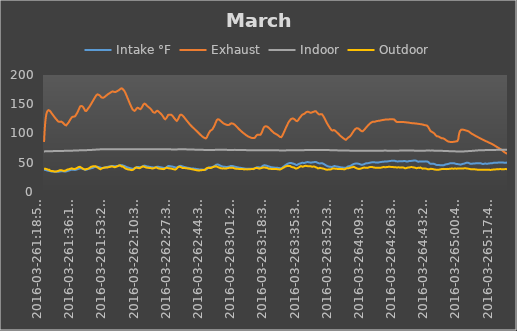
| Category | Intake °F | Exhaust | Indoor | Outdoor |
|---|---|---|---|---|
| 2016-03-261:18:55 PM | 37.85 | 85.662 | 69.35 | 40.1 |
| 2016-03-261:18:59 PM | 37.85 | 90.388 | 69.35 | 39.988 |
| 2016-03-261:19:03 PM | 37.85 | 94.888 | 69.35 | 39.988 |
| 2016-03-261:19:07 PM | 37.962 | 99.05 | 69.35 | 39.988 |
| 2016-03-261:19:11 PM | 37.962 | 102.875 | 69.35 | 40.1 |
| 2016-03-261:19:15 PM | 37.962 | 106.475 | 69.35 | 39.988 |
| 2016-03-261:19:19 PM | 37.962 | 109.738 | 69.35 | 39.875 |
| 2016-03-261:19:23 PM | 37.962 | 112.775 | 69.462 | 39.762 |
| 2016-03-261:19:27 PM | 37.85 | 115.588 | 69.462 | 39.762 |
| 2016-03-261:19:31 PM | 37.85 | 118.175 | 69.35 | 39.762 |
| 2016-03-261:19:35 PM | 37.85 | 120.425 | 69.462 | 39.65 |
| 2016-03-261:19:39 PM | 37.738 | 122.562 | 69.462 | 39.65 |
| 2016-03-261:19:43 PM | 37.738 | 124.588 | 69.462 | 39.65 |
| 2016-03-261:19:47 PM | 37.738 | 126.388 | 69.462 | 39.538 |
| 2016-03-261:19:51 PM | 37.625 | 127.962 | 69.462 | 39.425 |
| 2016-03-261:19:55 PM | 37.512 | 129.425 | 69.462 | 39.425 |
| 2016-03-261:20:00 PM | 37.512 | 130.775 | 69.462 | 39.425 |
| 2016-03-261:20:04 PM | 37.4 | 131.9 | 69.462 | 39.312 |
| 2016-03-261:20:08 PM | 37.288 | 133.025 | 69.462 | 39.312 |
| 2016-03-261:20:12 PM | 37.288 | 134.038 | 69.462 | 39.312 |
| 2016-03-261:20:16 PM | 37.175 | 134.825 | 69.462 | 39.2 |
| 2016-03-261:20:20 PM | 37.062 | 135.612 | 69.462 | 39.2 |
| 2016-03-261:20:24 PM | 37.062 | 136.288 | 69.462 | 39.088 |
| 2016-03-261:20:28 PM | 36.95 | 136.962 | 69.462 | 38.975 |
| 2016-03-261:20:32 PM | 36.838 | 137.525 | 69.462 | 38.75 |
| 2016-03-261:20:36 PM | 36.838 | 137.975 | 69.462 | 38.638 |
| 2016-03-261:20:40 PM | 36.725 | 138.312 | 69.462 | 38.525 |
| 2016-03-261:20:44 PM | 36.612 | 138.988 | 69.462 | 38.525 |
| 2016-03-261:20:48 PM | 36.612 | 139.212 | 69.462 | 38.412 |
| 2016-03-261:20:52 PM | 36.5 | 139.438 | 69.575 | 38.412 |
| 2016-03-261:20:56 PM | 36.5 | 139.662 | 69.462 | 38.188 |
| 2016-03-261:21:00 PM | 36.388 | 139.775 | 69.462 | 38.075 |
| 2016-03-261:21:05 PM | 36.388 | 139.775 | 69.575 | 38.075 |
| 2016-03-261:21:09 PM | 36.275 | 139.888 | 69.575 | 37.962 |
| 2016-03-261:21:13 PM | 36.162 | 139.888 | 69.575 | 37.85 |
| 2016-03-261:21:17 PM | 36.162 | 139.888 | 69.575 | 37.85 |
| 2016-03-261:21:21 PM | 36.05 | 139.888 | 69.575 | 37.85 |
| 2016-03-261:21:25 PM | 36.05 | 139.775 | 69.575 | 37.85 |
| 2016-03-261:21:29 PM | 35.938 | 139.662 | 69.575 | 37.962 |
| 2016-03-261:21:33 PM | 35.938 | 139.55 | 69.575 | 37.962 |
| 2016-03-261:21:37 PM | 35.938 | 139.438 | 69.575 | 37.962 |
| 2016-03-261:21:45 PM | 35.938 | 139.325 | 69.575 | 37.625 |
| 2016-03-261:21:49 PM | 35.825 | 139.212 | 69.688 | 37.4 |
| 2016-03-261:21:53 PM | 35.825 | 139.1 | 69.575 | 37.062 |
| 2016-03-261:21:57 PM | 35.825 | 138.875 | 69.575 | 36.725 |
| 2016-03-261:22:01 PM | 35.712 | 138.762 | 69.688 | 36.5 |
| 2016-03-261:22:05 PM | 35.6 | 138.538 | 69.688 | 36.5 |
| 2016-03-261:22:09 PM | 35.488 | 138.312 | 69.688 | 36.388 |
| 2016-03-261:22:13 PM | 35.6 | 138.088 | 69.688 | 36.388 |
| 2016-03-261:22:17 PM | 35.488 | 137.75 | 69.688 | 36.275 |
| 2016-03-261:22:21 PM | 35.488 | 137.525 | 69.688 | 36.275 |
| 2016-03-261:22:25 PM | 35.375 | 137.3 | 69.688 | 36.275 |
| 2016-03-261:22:29 PM | 35.262 | 137.075 | 69.688 | 36.162 |
| 2016-03-261:22:33 PM | 35.262 | 136.85 | 69.688 | 36.05 |
| 2016-03-261:22:37 PM | 35.262 | 136.175 | 69.688 | 36.05 |
| 2016-03-261:22:41 PM | 35.262 | 135.838 | 69.688 | 35.938 |
| 2016-03-261:22:45 PM | 35.15 | 135.5 | 69.688 | 35.938 |
| 2016-03-261:22:49 PM | 35.15 | 135.275 | 69.688 | 35.825 |
| 2016-03-261:22:53 PM | 35.15 | 134.938 | 69.688 | 35.825 |
| 2016-03-261:22:57 PM | 35.15 | 134.6 | 69.688 | 35.938 |
| 2016-03-261:23:01 PM | 35.15 | 134.375 | 69.688 | 35.938 |
| 2016-03-261:23:05 PM | 35.15 | 133.925 | 69.688 | 35.825 |
| 2016-03-261:23:13 PM | 35.038 | 133.7 | 69.8 | 35.825 |
| 2016-03-261:23:21 PM | 35.038 | 133.362 | 69.8 | 35.825 |
| 2016-03-261:23:25 PM | 35.038 | 133.138 | 69.688 | 35.825 |
| 2016-03-261:23:29 PM | 35.038 | 132.8 | 69.8 | 35.712 |
| 2016-03-261:23:33 PM | 35.038 | 132.462 | 69.8 | 35.6 |
| 2016-03-261:23:37 PM | 35.038 | 132.238 | 69.8 | 35.6 |
| 2016-03-261:23:41 PM | 34.925 | 131.9 | 69.8 | 35.6 |
| 2016-03-261:23:45 PM | 35.038 | 131.562 | 69.8 | 35.6 |
| 2016-03-261:23:49 PM | 34.925 | 131.338 | 69.8 | 35.488 |
| 2016-03-261:23:53 PM | 34.925 | 131 | 69.8 | 35.488 |
| 2016-03-261:23:58 PM | 34.925 | 130.775 | 69.912 | 35.488 |
| 2016-03-261:24:02 PM | 34.812 | 130.55 | 69.912 | 35.488 |
| 2016-03-261:24:06 PM | 34.925 | 130.212 | 69.912 | 35.375 |
| 2016-03-261:24:10 PM | 34.812 | 129.988 | 69.8 | 35.375 |
| 2016-03-261:24:14 PM | 34.812 | 129.65 | 69.8 | 35.262 |
| 2016-03-261:24:18 PM | 34.812 | 129.425 | 69.8 | 35.15 |
| 2016-03-261:24:22 PM | 34.812 | 129.088 | 69.912 | 35.15 |
| 2016-03-261:24:26 PM | 34.7 | 128.863 | 69.912 | 35.038 |
| 2016-03-261:24:30 PM | 34.7 | 128.525 | 69.912 | 35.038 |
| 2016-03-261:24:34 PM | 34.7 | 128.3 | 69.912 | 35.038 |
| 2016-03-261:24:38 PM | 34.7 | 127.962 | 69.912 | 35.038 |
| 2016-03-261:24:42 PM | 34.7 | 127.625 | 69.912 | 35.038 |
| 2016-03-261:24:46 PM | 34.7 | 127.4 | 69.912 | 35.15 |
| 2016-03-261:24:51 PM | 34.7 | 127.062 | 69.912 | 35.038 |
| 2016-03-261:24:55 PM | 34.7 | 126.838 | 69.912 | 35.038 |
| 2016-03-261:24:59 PM | 34.7 | 126.5 | 69.912 | 35.038 |
| 2016-03-261:25:03 PM | 34.588 | 126.163 | 69.912 | 34.925 |
| 2016-03-261:25:11 PM | 34.588 | 125.938 | 69.912 | 34.925 |
| 2016-03-261:25:15 PM | 34.588 | 125.712 | 69.912 | 35.038 |
| 2016-03-261:25:19 PM | 34.588 | 125.375 | 69.912 | 35.038 |
| 2016-03-261:25:23 PM | 34.588 | 125.15 | 69.912 | 35.15 |
| 2016-03-261:25:27 PM | 34.588 | 124.812 | 69.912 | 35.15 |
| 2016-03-261:25:31 PM | 34.588 | 124.588 | 69.912 | 35.15 |
| 2016-03-261:25:35 PM | 34.588 | 124.362 | 69.912 | 35.15 |
| 2016-03-261:25:39 PM | 34.588 | 124.025 | 69.912 | 35.15 |
| 2016-03-261:25:43 PM | 34.588 | 123.8 | 70.025 | 35.262 |
| 2016-03-261:25:47 PM | 34.475 | 123.462 | 70.025 | 35.375 |
| 2016-03-261:25:52 PM | 34.588 | 123.238 | 70.025 | 35.375 |
| 2016-03-261:25:56 PM | 34.588 | 123.012 | 70.025 | 35.488 |
| 2016-03-261:26:00 PM | 34.588 | 122.788 | 70.025 | 35.488 |
| 2016-03-261:26:04 PM | 34.588 | 122.562 | 70.025 | 35.6 |
| 2016-03-261:26:08 PM | 34.588 | 122.338 | 70.025 | 35.6 |
| 2016-03-261:26:12 PM | 34.588 | 122.112 | 70.025 | 35.712 |
| 2016-03-261:26:16 PM | 34.588 | 121.888 | 70.025 | 35.712 |
| 2016-03-261:26:20 PM | 34.588 | 121.663 | 70.025 | 35.712 |
| 2016-03-261:26:24 PM | 34.588 | 121.438 | 70.025 | 35.712 |
| 2016-03-261:26:28 PM | 34.588 | 121.212 | 70.025 | 35.712 |
| 2016-03-261:26:32 PM | 34.588 | 120.762 | 70.138 | 35.712 |
| 2016-03-261:26:36 PM | 34.588 | 120.538 | 70.025 | 35.825 |
| 2016-03-261:26:40 PM | 34.588 | 120.312 | 70.025 | 35.825 |
| 2016-03-261:26:44 PM | 34.588 | 120.088 | 70.138 | 36.05 |
| 2016-03-261:26:48 PM | 34.588 | 119.975 | 70.138 | 36.05 |
| 2016-03-261:26:52 PM | 34.7 | 119.862 | 70.138 | 36.275 |
| 2016-03-261:26:56 PM | 34.7 | 119.862 | 70.138 | 36.5 |
| 2016-03-261:27:00 PM | 34.7 | 119.862 | 70.138 | 36.612 |
| 2016-03-261:27:04 PM | 34.7 | 119.975 | 70.025 | 36.725 |
| 2016-03-261:27:09 PM | 34.812 | 119.975 | 70.138 | 36.838 |
| 2016-03-261:27:13 PM | 34.812 | 119.975 | 70.138 | 36.838 |
| 2016-03-261:27:17 PM | 34.925 | 119.975 | 70.138 | 36.95 |
| 2016-03-261:27:21 PM | 34.925 | 119.975 | 70.138 | 36.95 |
| 2016-03-261:27:25 PM | 35.038 | 119.975 | 70.138 | 37.062 |
| 2016-03-261:27:29 PM | 35.038 | 119.862 | 70.138 | 37.175 |
| 2016-03-261:27:33 PM | 35.038 | 119.862 | 70.138 | 37.175 |
| 2016-03-261:27:37 PM | 35.038 | 119.975 | 70.138 | 37.288 |
| 2016-03-261:27:41 PM | 35.15 | 120.088 | 70.138 | 37.4 |
| 2016-03-261:27:45 PM | 35.15 | 120.2 | 70.138 | 37.4 |
| 2016-03-261:27:49 PM | 35.262 | 120.2 | 70.138 | 37.4 |
| 2016-03-261:27:53 PM | 35.262 | 120.312 | 70.25 | 37.4 |
| 2016-03-261:27:57 PM | 35.375 | 120.425 | 70.25 | 37.4 |
| 2016-03-261:28:01 PM | 35.375 | 120.425 | 70.25 | 37.512 |
| 2016-03-261:28:06 PM | 35.488 | 120.425 | 70.25 | 37.512 |
| 2016-03-261:28:10 PM | 35.488 | 120.425 | 70.25 | 37.288 |
| 2016-03-261:28:14 PM | 35.488 | 120.312 | 70.25 | 37.288 |
| 2016-03-261:28:18 PM | 35.488 | 120.312 | 70.25 | 37.288 |
| 2016-03-261:28:22 PM | 35.488 | 120.2 | 70.25 | 37.175 |
| 2016-03-261:28:26 PM | 35.6 | 120.088 | 70.25 | 37.175 |
| 2016-03-261:28:30 PM | 35.6 | 119.975 | 70.25 | 37.175 |
| 2016-03-261:28:34 PM | 35.6 | 119.862 | 70.25 | 37.175 |
| 2016-03-261:28:38 PM | 35.488 | 119.75 | 70.25 | 37.175 |
| 2016-03-261:28:42 PM | 35.488 | 119.525 | 70.25 | 37.062 |
| 2016-03-261:28:46 PM | 35.488 | 119.413 | 70.25 | 37.062 |
| 2016-03-261:28:50 PM | 35.488 | 119.3 | 70.25 | 36.838 |
| 2016-03-261:28:54 PM | 35.488 | 119.075 | 70.25 | 36.725 |
| 2016-03-261:28:58 PM | 35.375 | 118.85 | 70.25 | 36.5 |
| 2016-03-261:29:03 PM | 35.488 | 118.625 | 70.25 | 36.388 |
| 2016-03-261:29:07 PM | 35.375 | 118.4 | 70.25 | 36.388 |
| 2016-03-261:29:11 PM | 35.375 | 118.175 | 70.362 | 36.275 |
| 2016-03-261:29:15 PM | 35.262 | 117.95 | 70.25 | 36.162 |
| 2016-03-261:29:19 PM | 35.262 | 117.725 | 70.362 | 36.162 |
| 2016-03-261:29:23 PM | 35.262 | 117.5 | 70.25 | 36.162 |
| 2016-03-261:29:27 PM | 35.262 | 117.275 | 70.25 | 36.05 |
| 2016-03-261:29:31 PM | 35.262 | 117.05 | 70.25 | 36.05 |
| 2016-03-261:29:35 PM | 35.15 | 116.825 | 70.362 | 36.05 |
| 2016-03-261:29:39 PM | 35.15 | 116.6 | 70.362 | 35.938 |
| 2016-03-261:29:43 PM | 35.15 | 116.262 | 70.25 | 35.938 |
| 2016-03-261:29:47 PM | 35.038 | 116.038 | 70.362 | 36.05 |
| 2016-03-261:29:51 PM | 35.038 | 115.812 | 70.362 | 36.05 |
| 2016-03-261:29:56 PM | 35.038 | 115.588 | 70.362 | 36.162 |
| 2016-03-261:30:00 PM | 35.038 | 115.362 | 70.362 | 36.162 |
| 2016-03-261:30:04 PM | 35.038 | 115.138 | 70.362 | 36.162 |
| 2016-03-261:30:08 PM | 35.038 | 114.913 | 70.362 | 36.275 |
| 2016-03-261:30:12 PM | 35.038 | 114.8 | 70.362 | 36.275 |
| 2016-03-261:30:16 PM | 35.038 | 114.575 | 70.362 | 36.275 |
| 2016-03-261:30:20 PM | 35.038 | 114.462 | 70.362 | 36.275 |
| 2016-03-261:30:24 PM | 35.038 | 114.35 | 70.362 | 36.388 |
| 2016-03-261:30:28 PM | 35.038 | 114.125 | 70.362 | 36.5 |
| 2016-03-261:30:32 PM | 35.038 | 114.012 | 70.362 | 36.5 |
| 2016-03-261:30:36 PM | 35.038 | 113.9 | 70.362 | 36.612 |
| 2016-03-261:30:40 PM | 35.038 | 113.9 | 70.362 | 36.838 |
| 2016-03-261:30:44 PM | 35.15 | 113.9 | 70.362 | 36.95 |
| 2016-03-261:30:48 PM | 35.15 | 113.9 | 70.362 | 37.062 |
| 2016-03-261:30:52 PM | 35.15 | 113.9 | 70.362 | 37.288 |
| 2016-03-261:30:57 PM | 35.262 | 114.125 | 70.362 | 37.512 |
| 2016-03-261:31:01 PM | 35.262 | 114.238 | 70.362 | 37.625 |
| 2016-03-261:31:05 PM | 35.375 | 114.462 | 70.362 | 37.85 |
| 2016-03-261:31:09 PM | 35.375 | 114.8 | 70.362 | 38.075 |
| 2016-03-261:31:13 PM | 35.488 | 115.138 | 70.475 | 38.188 |
| 2016-03-261:31:17 PM | 35.6 | 115.475 | 70.475 | 38.188 |
| 2016-03-261:31:21 PM | 35.712 | 115.812 | 70.475 | 38.3 |
| 2016-03-261:31:25 PM | 35.712 | 116.15 | 70.475 | 38.3 |
| 2016-03-261:31:29 PM | 35.938 | 116.488 | 70.475 | 38.412 |
| 2016-03-261:31:33 PM | 36.05 | 116.712 | 70.475 | 38.412 |
| 2016-03-261:31:37 PM | 36.162 | 116.938 | 70.475 | 38.525 |
| 2016-03-261:31:41 PM | 36.162 | 117.275 | 70.475 | 38.525 |
| 2016-03-261:31:45 PM | 36.275 | 117.388 | 70.475 | 38.638 |
| 2016-03-261:31:49 PM | 36.388 | 117.725 | 70.475 | 38.638 |
| 2016-03-261:31:53 PM | 36.388 | 117.95 | 70.475 | 38.638 |
| 2016-03-261:31:58 PM | 36.388 | 118.288 | 70.475 | 38.638 |
| 2016-03-261:32:02 PM | 36.388 | 118.512 | 70.475 | 38.525 |
| 2016-03-261:32:06 PM | 36.612 | 118.738 | 70.475 | 38.638 |
| 2016-03-261:32:10 PM | 36.612 | 119.075 | 70.475 | 38.75 |
| 2016-03-261:32:14 PM | 36.725 | 119.413 | 70.588 | 38.862 |
| 2016-03-261:32:18 PM | 36.725 | 119.862 | 70.475 | 39.088 |
| 2016-03-261:32:22 PM | 36.838 | 120.2 | 70.475 | 39.2 |
| 2016-03-261:32:26 PM | 36.838 | 120.65 | 70.588 | 39.2 |
| 2016-03-261:32:30 PM | 36.95 | 121.1 | 70.588 | 39.2 |
| 2016-03-261:32:34 PM | 37.062 | 121.438 | 70.588 | 39.2 |
| 2016-03-261:32:38 PM | 37.175 | 121.888 | 70.588 | 39.312 |
| 2016-03-261:32:42 PM | 37.175 | 122.225 | 70.588 | 39.425 |
| 2016-03-261:32:46 PM | 37.288 | 122.675 | 70.588 | 39.538 |
| 2016-03-261:32:50 PM | 37.4 | 123.012 | 70.588 | 39.65 |
| 2016-03-261:32:55 PM | 37.4 | 123.462 | 70.588 | 39.762 |
| 2016-03-261:32:59 PM | 37.512 | 123.8 | 70.588 | 39.875 |
| 2016-03-261:33:03 PM | 37.625 | 124.138 | 70.7 | 39.875 |
| 2016-03-261:33:07 PM | 37.625 | 124.475 | 70.588 | 39.762 |
| 2016-03-261:33:11 PM | 37.738 | 124.812 | 70.588 | 39.875 |
| 2016-03-261:33:15 PM | 37.738 | 125.038 | 70.588 | 39.875 |
| 2016-03-261:33:19 PM | 37.85 | 125.262 | 70.7 | 39.988 |
| 2016-03-261:33:23 PM | 37.85 | 125.6 | 70.7 | 40.1 |
| 2016-03-261:33:27 PM | 37.85 | 125.938 | 70.7 | 40.212 |
| 2016-03-261:33:31 PM | 37.962 | 126.275 | 70.7 | 40.212 |
| 2016-03-261:33:35 PM | 37.962 | 126.612 | 70.7 | 40.325 |
| 2016-03-261:33:39 PM | 37.962 | 126.95 | 70.7 | 40.438 |
| 2016-03-261:33:43 PM | 38.075 | 127.288 | 70.7 | 40.438 |
| 2016-03-261:33:47 PM | 38.075 | 127.625 | 70.7 | 40.438 |
| 2016-03-261:33:52 PM | 38.075 | 127.85 | 70.7 | 40.438 |
| 2016-03-261:33:56 PM | 38.188 | 128.075 | 70.7 | 40.438 |
| 2016-03-261:34:00 PM | 38.188 | 128.188 | 70.7 | 40.55 |
| 2016-03-261:34:04 PM | 38.188 | 128.3 | 70.812 | 40.438 |
| 2016-03-261:34:08 PM | 38.188 | 128.412 | 70.7 | 40.438 |
| 2016-03-261:34:12 PM | 38.188 | 128.525 | 70.812 | 40.212 |
| 2016-03-261:34:16 PM | 38.188 | 128.637 | 70.812 | 40.1 |
| 2016-03-261:34:20 PM | 38.188 | 128.637 | 70.7 | 39.875 |
| 2016-03-261:34:24 PM | 38.188 | 128.75 | 70.812 | 39.762 |
| 2016-03-261:34:28 PM | 38.188 | 128.75 | 70.7 | 39.538 |
| 2016-03-261:34:32 PM | 38.075 | 128.863 | 70.812 | 39.425 |
| 2016-03-261:34:36 PM | 38.075 | 128.863 | 70.7 | 39.312 |
| 2016-03-261:34:40 PM | 38.075 | 128.975 | 70.7 | 39.312 |
| 2016-03-261:34:44 PM | 38.075 | 128.975 | 70.812 | 39.312 |
| 2016-03-261:34:49 PM | 38.075 | 128.975 | 70.812 | 39.312 |
| 2016-03-261:34:53 PM | 37.962 | 128.863 | 70.812 | 39.2 |
| 2016-03-261:34:57 PM | 37.962 | 128.863 | 70.812 | 39.2 |
| 2016-03-261:35:01 PM | 37.962 | 128.863 | 70.812 | 39.425 |
| 2016-03-261:35:05 PM | 37.85 | 128.863 | 70.812 | 39.425 |
| 2016-03-261:35:09 PM | 37.85 | 128.975 | 70.812 | 39.425 |
| 2016-03-261:35:13 PM | 37.85 | 128.975 | 70.812 | 39.425 |
| 2016-03-261:35:17 PM | 37.738 | 129.088 | 70.812 | 39.425 |
| 2016-03-261:35:21 PM | 37.85 | 129.088 | 70.812 | 39.425 |
| 2016-03-261:35:25 PM | 37.738 | 129.2 | 70.812 | 39.425 |
| 2016-03-261:35:29 PM | 37.85 | 129.312 | 70.812 | 39.65 |
| 2016-03-261:35:33 PM | 37.85 | 129.538 | 70.812 | 39.762 |
| 2016-03-261:35:37 PM | 37.85 | 129.65 | 70.812 | 39.875 |
| 2016-03-261:35:41 PM | 37.85 | 129.988 | 70.812 | 39.988 |
| 2016-03-261:35:46 PM | 37.962 | 130.212 | 70.812 | 40.1 |
| 2016-03-261:35:50 PM | 37.962 | 130.55 | 70.925 | 40.1 |
| 2016-03-261:35:54 PM | 38.075 | 131 | 70.925 | 40.1 |
| 2016-03-261:35:58 PM | 38.075 | 131.338 | 70.925 | 40.1 |
| 2016-03-261:36:02 PM | 38.188 | 131.788 | 70.925 | 40.212 |
| 2016-03-261:36:06 PM | 38.188 | 132.125 | 70.925 | 40.325 |
| 2016-03-261:36:10 PM | 38.3 | 132.575 | 70.925 | 40.325 |
| 2016-03-261:36:14 PM | 38.3 | 132.912 | 70.925 | 40.438 |
| 2016-03-261:36:18 PM | 38.412 | 133.362 | 70.925 | 40.438 |
| 2016-03-261:36:22 PM | 38.525 | 133.7 | 70.925 | 40.55 |
| 2016-03-261:36:26 PM | 38.525 | 134.15 | 71.038 | 40.662 |
| 2016-03-261:36:30 PM | 38.638 | 134.488 | 71.038 | 40.775 |
| 2016-03-261:36:34 PM | 38.638 | 134.825 | 70.925 | 40.775 |
| 2016-03-261:36:38 PM | 38.75 | 135.162 | 71.038 | 40.888 |
| 2016-03-261:36:42 PM | 38.862 | 135.388 | 71.038 | 41 |
| 2016-03-261:36:46 PM | 38.862 | 135.838 | 71.038 | 41.338 |
| 2016-03-261:36:51 PM | 38.862 | 136.288 | 71.038 | 41.562 |
| 2016-03-261:36:55 PM | 38.975 | 136.738 | 71.038 | 41.788 |
| 2016-03-261:36:59 PM | 39.088 | 137.188 | 71.038 | 42.012 |
| 2016-03-261:37:03 PM | 39.2 | 137.638 | 71.038 | 42.125 |
| 2016-03-261:37:07 PM | 39.2 | 138.088 | 71.038 | 42.35 |
| 2016-03-261:37:11 PM | 39.312 | 138.65 | 71.038 | 42.575 |
| 2016-03-261:37:15 PM | 39.425 | 139.1 | 71.15 | 42.688 |
| 2016-03-261:37:19 PM | 39.538 | 139.55 | 71.15 | 42.8 |
| 2016-03-261:37:23 PM | 39.65 | 140.112 | 71.15 | 42.8 |
| 2016-03-261:37:27 PM | 39.762 | 140.675 | 71.15 | 42.8 |
| 2016-03-261:37:31 PM | 39.762 | 141.125 | 71.15 | 42.8 |
| 2016-03-261:37:35 PM | 39.875 | 141.688 | 71.15 | 42.8 |
| 2016-03-261:37:39 PM | 39.988 | 142.138 | 71.262 | 42.912 |
| 2016-03-261:37:43 PM | 39.988 | 142.7 | 71.262 | 43.025 |
| 2016-03-261:37:48 PM | 40.1 | 143.15 | 71.15 | 43.025 |
| 2016-03-261:37:52 PM | 40.212 | 143.712 | 71.15 | 43.025 |
| 2016-03-261:37:56 PM | 40.212 | 144.162 | 71.262 | 43.138 |
| 2016-03-261:38:00 PM | 40.325 | 144.725 | 71.262 | 43.25 |
| 2016-03-261:38:04 PM | 40.325 | 145.175 | 71.262 | 43.138 |
| 2016-03-261:38:08 PM | 40.325 | 145.625 | 71.262 | 43.025 |
| 2016-03-261:38:12 PM | 40.438 | 146.075 | 71.262 | 43.025 |
| 2016-03-261:38:16 PM | 40.438 | 146.3 | 71.262 | 42.912 |
| 2016-03-261:38:20 PM | 40.438 | 146.638 | 71.375 | 42.688 |
| 2016-03-261:38:24 PM | 40.55 | 146.75 | 71.262 | 42.462 |
| 2016-03-261:38:28 PM | 40.55 | 146.862 | 71.375 | 42.35 |
| 2016-03-261:38:32 PM | 40.438 | 146.862 | 71.262 | 42.125 |
| 2016-03-261:38:36 PM | 40.438 | 146.975 | 71.262 | 42.012 |
| 2016-03-261:38:40 PM | 40.438 | 146.862 | 71.375 | 41.9 |
| 2016-03-261:38:45 PM | 40.438 | 146.975 | 71.375 | 41.788 |
| 2016-03-261:38:49 PM | 40.325 | 146.975 | 71.375 | 41.675 |
| 2016-03-261:38:53 PM | 40.212 | 146.975 | 71.375 | 41.45 |
| 2016-03-261:38:57 PM | 40.212 | 146.862 | 71.375 | 41.338 |
| 2016-03-261:39:01 PM | 40.1 | 146.862 | 71.375 | 41.225 |
| 2016-03-261:39:05 PM | 39.988 | 146.862 | 71.375 | 41.112 |
| 2016-03-261:39:09 PM | 39.988 | 146.862 | 71.375 | 41 |
| 2016-03-261:39:13 PM | 39.988 | 146.862 | 71.375 | 40.888 |
| 2016-03-261:39:17 PM | 39.875 | 146.75 | 71.375 | 40.775 |
| 2016-03-261:39:21 PM | 39.875 | 146.638 | 71.375 | 40.662 |
| 2016-03-261:39:25 PM | 39.762 | 146.412 | 71.375 | 40.55 |
| 2016-03-261:39:29 PM | 39.65 | 146.3 | 71.375 | 40.325 |
| 2016-03-261:39:33 PM | 39.65 | 146.075 | 71.375 | 40.1 |
| 2016-03-261:39:37 PM | 39.538 | 145.85 | 71.488 | 39.988 |
| 2016-03-261:39:41 PM | 39.538 | 145.625 | 71.375 | 39.875 |
| 2016-03-261:39:46 PM | 39.425 | 145.288 | 71.375 | 39.762 |
| 2016-03-261:39:50 PM | 39.312 | 144.95 | 71.375 | 39.538 |
| 2016-03-261:39:54 PM | 39.312 | 144.612 | 71.375 | 39.312 |
| 2016-03-261:39:58 PM | 39.2 | 144.275 | 71.375 | 39.312 |
| 2016-03-261:40:02 PM | 39.088 | 143.938 | 71.488 | 39.2 |
| 2016-03-261:40:06 PM | 39.088 | 143.6 | 71.488 | 39.2 |
| 2016-03-261:40:10 PM | 38.975 | 143.262 | 71.375 | 39.088 |
| 2016-03-261:40:14 PM | 38.862 | 142.812 | 71.375 | 39.088 |
| 2016-03-261:40:18 PM | 38.75 | 142.475 | 71.375 | 38.975 |
| 2016-03-261:40:22 PM | 38.638 | 142.025 | 71.375 | 38.75 |
| 2016-03-261:40:26 PM | 38.638 | 141.575 | 71.375 | 38.638 |
| 2016-03-261:40:30 PM | 38.525 | 141.125 | 71.488 | 38.525 |
| 2016-03-261:40:34 PM | 38.412 | 140.675 | 71.488 | 38.525 |
| 2016-03-261:40:38 PM | 38.3 | 140.338 | 71.375 | 38.525 |
| 2016-03-261:40:43 PM | 38.3 | 139.888 | 71.488 | 38.412 |
| 2016-03-261:40:47 PM | 38.188 | 139.55 | 71.375 | 38.3 |
| 2016-03-261:40:51 PM | 38.075 | 139.1 | 71.375 | 38.3 |
| 2016-03-261:40:55 PM | 37.962 | 138.762 | 71.375 | 38.412 |
| 2016-03-261:40:59 PM | 37.962 | 138.538 | 71.375 | 38.525 |
| 2016-03-261:41:03 PM | 37.85 | 138.425 | 71.375 | 38.638 |
| 2016-03-261:41:07 PM | 37.85 | 138.312 | 71.375 | 38.862 |
| 2016-03-261:41:11 PM | 37.85 | 138.312 | 71.375 | 38.975 |
| 2016-03-261:41:15 PM | 37.85 | 138.312 | 71.375 | 39.088 |
| 2016-03-261:41:19 PM | 37.85 | 138.312 | 71.488 | 39.2 |
| 2016-03-261:41:23 PM | 37.962 | 138.425 | 71.488 | 39.2 |
| 2016-03-261:41:27 PM | 37.962 | 138.538 | 71.488 | 39.312 |
| 2016-03-261:41:31 PM | 38.075 | 138.762 | 71.488 | 39.312 |
| 2016-03-261:41:39 PM | 38.075 | 138.988 | 71.488 | 39.538 |
| 2016-03-261:41:43 PM | 38.188 | 139.212 | 71.488 | 39.538 |
| 2016-03-261:41:47 PM | 38.3 | 139.438 | 71.488 | 39.538 |
| 2016-03-261:41:51 PM | 38.3 | 139.662 | 71.488 | 39.538 |
| 2016-03-261:41:55 PM | 38.412 | 139.888 | 71.6 | 39.312 |
| 2016-03-261:41:59 PM | 38.525 | 140.225 | 71.6 | 39.312 |
| 2016-03-261:42:03 PM | 38.638 | 140.562 | 71.6 | 39.312 |
| 2016-03-261:42:08 PM | 38.75 | 140.9 | 71.6 | 39.312 |
| 2016-03-261:42:12 PM | 38.862 | 141.238 | 71.6 | 39.538 |
| 2016-03-261:42:16 PM | 38.975 | 141.575 | 71.6 | 39.65 |
| 2016-03-261:42:20 PM | 39.088 | 141.912 | 71.6 | 39.762 |
| 2016-03-261:42:24 PM | 39.088 | 142.25 | 71.6 | 39.875 |
| 2016-03-261:42:28 PM | 39.2 | 142.7 | 71.6 | 39.762 |
| 2016-03-261:42:32 PM | 39.312 | 143.038 | 71.6 | 39.875 |
| 2016-03-261:42:36 PM | 39.425 | 143.262 | 71.6 | 39.988 |
| 2016-03-261:42:40 PM | 39.538 | 143.6 | 71.6 | 40.1 |
| 2016-03-261:42:44 PM | 39.538 | 143.825 | 71.6 | 40.1 |
| 2016-03-261:42:48 PM | 39.65 | 144.05 | 71.712 | 40.212 |
| 2016-03-261:42:52 PM | 39.65 | 144.388 | 71.6 | 40.325 |
| 2016-03-261:42:56 PM | 39.65 | 144.612 | 71.6 | 40.438 |
| 2016-03-261:43:00 PM | 39.762 | 144.95 | 71.6 | 40.55 |
| 2016-03-261:43:05 PM | 39.762 | 145.175 | 71.6 | 40.662 |
| 2016-03-261:43:09 PM | 39.875 | 145.512 | 71.712 | 40.662 |
| 2016-03-261:43:13 PM | 39.875 | 145.738 | 71.6 | 40.775 |
| 2016-03-261:43:17 PM | 39.875 | 146.075 | 71.712 | 41 |
| 2016-03-261:43:25 PM | 39.875 | 146.412 | 71.712 | 41.338 |
| 2016-03-261:43:29 PM | 39.988 | 146.75 | 71.712 | 41.45 |
| 2016-03-261:43:33 PM | 39.988 | 147.2 | 71.712 | 41.675 |
| 2016-03-261:43:40 PM | 40.1 | 147.538 | 71.712 | 41.9 |
| 2016-03-261:43:44 PM | 40.1 | 147.988 | 71.712 | 42.125 |
| 2016-03-261:43:48 PM | 40.212 | 148.212 | 71.712 | 42.238 |
| 2016-03-261:43:52 PM | 40.212 | 148.662 | 71.825 | 42.35 |
| 2016-03-261:43:56 PM | 40.325 | 148.888 | 71.825 | 42.575 |
| 2016-03-261:44:00 PM | 40.438 | 149.338 | 71.712 | 42.688 |
| 2016-03-261:44:05 PM | 40.438 | 149.675 | 71.825 | 42.912 |
| 2016-03-261:44:09 PM | 40.438 | 150.125 | 71.825 | 43.025 |
| 2016-03-261:44:13 PM | 40.55 | 150.35 | 71.825 | 43.025 |
| 2016-03-261:44:17 PM | 40.55 | 150.8 | 71.825 | 43.138 |
| 2016-03-261:44:21 PM | 40.662 | 151.138 | 71.825 | 43.25 |
| 2016-03-261:44:25 PM | 40.662 | 151.588 | 71.825 | 43.362 |
| 2016-03-261:44:29 PM | 40.662 | 151.925 | 71.825 | 43.475 |
| 2016-03-261:44:33 PM | 40.775 | 152.375 | 71.938 | 43.475 |
| 2016-03-261:44:37 PM | 40.888 | 152.712 | 71.938 | 43.475 |
| 2016-03-261:44:41 PM | 40.888 | 153.05 | 71.938 | 43.475 |
| 2016-03-261:44:45 PM | 41 | 153.5 | 72.05 | 43.362 |
| 2016-03-261:44:49 PM | 41.112 | 153.838 | 72.05 | 43.475 |
| 2016-03-261:44:53 PM | 41.112 | 154.175 | 72.05 | 43.588 |
| 2016-03-261:44:57 PM | 41.225 | 154.625 | 72.05 | 43.7 |
| 2016-03-261:45:01 PM | 41.338 | 154.962 | 72.05 | 43.7 |
| 2016-03-261:45:05 PM | 41.338 | 155.412 | 72.05 | 43.812 |
| 2016-03-261:45:10 PM | 41.45 | 155.75 | 72.162 | 43.812 |
| 2016-03-261:45:14 PM | 41.562 | 156.088 | 72.162 | 43.925 |
| 2016-03-261:45:18 PM | 41.562 | 156.425 | 72.162 | 44.038 |
| 2016-03-261:45:22 PM | 41.675 | 156.875 | 72.162 | 44.15 |
| 2016-03-261:45:26 PM | 41.9 | 157.212 | 72.162 | 44.262 |
| 2016-03-261:45:30 PM | 41.9 | 157.55 | 72.162 | 44.375 |
| 2016-03-261:45:34 PM | 42.012 | 158 | 72.162 | 44.375 |
| 2016-03-261:45:38 PM | 42.125 | 158.338 | 72.162 | 44.375 |
| 2016-03-261:45:42 PM | 42.238 | 158.788 | 72.275 | 44.488 |
| 2016-03-261:45:46 PM | 42.35 | 159.125 | 72.275 | 44.375 |
| 2016-03-261:45:50 PM | 42.35 | 159.462 | 72.275 | 44.262 |
| 2016-03-261:45:54 PM | 42.462 | 159.912 | 72.275 | 44.15 |
| 2016-03-261:45:58 PM | 42.462 | 160.25 | 72.275 | 44.15 |
| 2016-03-261:46:02 PM | 42.575 | 160.588 | 72.275 | 44.15 |
| 2016-03-261:46:07 PM | 42.688 | 160.925 | 72.275 | 43.925 |
| 2016-03-261:46:11 PM | 42.688 | 161.375 | 72.388 | 44.038 |
| 2016-03-261:46:15 PM | 42.688 | 161.712 | 72.388 | 44.038 |
| 2016-03-261:46:19 PM | 42.8 | 162.05 | 72.388 | 44.038 |
| 2016-03-261:46:23 PM | 42.912 | 162.388 | 72.388 | 44.038 |
| 2016-03-261:46:27 PM | 42.912 | 162.725 | 72.388 | 44.15 |
| 2016-03-261:46:31 PM | 42.912 | 163.062 | 72.388 | 44.15 |
| 2016-03-261:46:35 PM | 43.025 | 163.513 | 72.388 | 44.15 |
| 2016-03-261:46:39 PM | 43.025 | 163.738 | 72.5 | 44.038 |
| 2016-03-261:46:43 PM | 43.025 | 164.075 | 72.5 | 43.925 |
| 2016-03-261:46:47 PM | 43.025 | 164.525 | 72.5 | 43.812 |
| 2016-03-261:46:51 PM | 43.138 | 164.75 | 72.5 | 43.7 |
| 2016-03-261:46:55 PM | 43.138 | 165.088 | 72.612 | 43.475 |
| 2016-03-261:46:59 PM | 43.25 | 165.425 | 72.5 | 43.362 |
| 2016-03-261:47:03 PM | 43.138 | 165.763 | 72.612 | 43.25 |
| 2016-03-261:47:08 PM | 43.25 | 166.1 | 72.612 | 43.025 |
| 2016-03-261:47:12 PM | 43.25 | 166.325 | 72.612 | 42.912 |
| 2016-03-261:47:16 PM | 43.138 | 166.55 | 72.612 | 42.8 |
| 2016-03-261:47:20 PM | 43.25 | 166.775 | 72.612 | 42.575 |
| 2016-03-261:47:24 PM | 43.25 | 166.775 | 72.612 | 42.35 |
| 2016-03-261:47:28 PM | 43.138 | 166.888 | 72.612 | 42.238 |
| 2016-03-261:47:35 PM | 43.138 | 166.888 | 72.725 | 41.9 |
| 2016-03-261:47:39 PM | 43.138 | 166.888 | 72.725 | 41.788 |
| 2016-03-261:47:43 PM | 43.025 | 166.775 | 72.725 | 41.675 |
| 2016-03-261:47:47 PM | 43.025 | 166.775 | 72.725 | 41.338 |
| 2016-03-261:47:51 PM | 42.912 | 166.662 | 72.725 | 41.112 |
| 2016-03-261:47:55 PM | 42.8 | 166.662 | 72.725 | 41 |
| 2016-03-261:47:59 PM | 42.8 | 166.55 | 72.725 | 41 |
| 2016-03-261:48:04 PM | 42.688 | 166.438 | 72.725 | 41 |
| 2016-03-261:48:08 PM | 42.688 | 166.325 | 72.838 | 41 |
| 2016-03-261:48:12 PM | 42.575 | 166.212 | 72.725 | 41 |
| 2016-03-261:48:16 PM | 42.462 | 166.1 | 72.838 | 40.888 |
| 2016-03-261:48:20 PM | 42.462 | 165.988 | 72.838 | 40.888 |
| 2016-03-261:48:24 PM | 42.35 | 165.875 | 72.838 | 40.775 |
| 2016-03-261:48:28 PM | 42.238 | 165.763 | 72.838 | 40.662 |
| 2016-03-261:48:32 PM | 42.238 | 165.763 | 72.838 | 40.325 |
| 2016-03-261:48:40 PM | 42.238 | 165.65 | 72.95 | 39.762 |
| 2016-03-261:48:44 PM | 42.125 | 165.538 | 72.838 | 39.65 |
| 2016-03-261:48:48 PM | 42.125 | 165.425 | 72.838 | 39.312 |
| 2016-03-261:48:52 PM | 42.125 | 165.312 | 72.838 | 39.088 |
| 2016-03-261:48:56 PM | 42.012 | 165.088 | 72.95 | 38.862 |
| 2016-03-261:49:00 PM | 42.012 | 164.862 | 72.95 | 38.75 |
| 2016-03-261:49:04 PM | 41.9 | 164.638 | 72.838 | 38.638 |
| 2016-03-261:49:08 PM | 41.788 | 164.3 | 72.95 | 38.638 |
| 2016-03-261:49:12 PM | 41.675 | 163.962 | 72.95 | 38.75 |
| 2016-03-261:49:16 PM | 41.675 | 163.625 | 72.95 | 38.862 |
| 2016-03-261:49:21 PM | 41.562 | 163.288 | 72.95 | 38.975 |
| 2016-03-261:49:25 PM | 41.45 | 162.95 | 72.838 | 39.088 |
| 2016-03-261:49:29 PM | 41.338 | 162.612 | 72.838 | 39.2 |
| 2016-03-261:49:33 PM | 41.225 | 162.275 | 72.838 | 39.312 |
| 2016-03-261:49:37 PM | 41.112 | 162.162 | 72.838 | 39.425 |
| 2016-03-261:49:41 PM | 41 | 161.938 | 72.838 | 39.65 |
| 2016-03-261:49:45 PM | 41 | 161.825 | 72.95 | 39.762 |
| 2016-03-261:49:49 PM | 41 | 161.712 | 72.95 | 39.988 |
| 2016-03-261:49:53 PM | 41 | 161.712 | 72.95 | 40.1 |
| 2016-03-261:49:57 PM | 41 | 161.6 | 72.95 | 40.212 |
| 2016-03-261:50:01 PM | 41 | 161.488 | 72.95 | 40.212 |
| 2016-03-261:50:05 PM | 41 | 161.488 | 72.95 | 40.325 |
| 2016-03-261:50:09 PM | 41 | 161.375 | 72.95 | 40.55 |
| 2016-03-261:50:13 PM | 41.112 | 161.375 | 72.95 | 40.55 |
| 2016-03-261:50:17 PM | 41 | 161.263 | 72.95 | 40.775 |
| 2016-03-261:50:22 PM | 41 | 161.15 | 72.95 | 40.888 |
| 2016-03-261:50:26 PM | 41 | 161.038 | 73.062 | 40.775 |
| 2016-03-261:50:30 PM | 41 | 160.925 | 72.95 | 40.775 |
| 2016-03-261:50:34 PM | 41 | 160.925 | 72.95 | 40.888 |
| 2016-03-261:50:38 PM | 41 | 160.925 | 73.062 | 40.888 |
| 2016-03-261:50:42 PM | 41 | 161.038 | 73.062 | 41 |
| 2016-03-261:50:46 PM | 41 | 161.15 | 73.062 | 41.112 |
| 2016-03-261:50:50 PM | 41.112 | 161.263 | 73.062 | 41.225 |
| 2016-03-261:50:54 PM | 41.112 | 161.263 | 73.062 | 41.45 |
| 2016-03-261:50:58 PM | 41.225 | 161.375 | 73.062 | 41.562 |
| 2016-03-261:51:02 PM | 41.225 | 161.6 | 73.062 | 41.562 |
| 2016-03-261:51:06 PM | 41.338 | 161.712 | 73.062 | 41.562 |
| 2016-03-261:51:10 PM | 41.45 | 161.825 | 73.062 | 41.562 |
| 2016-03-261:51:15 PM | 41.562 | 162.05 | 73.062 | 41.675 |
| 2016-03-261:51:19 PM | 41.562 | 162.162 | 73.062 | 41.788 |
| 2016-03-261:51:23 PM | 41.675 | 162.275 | 73.062 | 41.788 |
| 2016-03-261:51:27 PM | 41.788 | 162.388 | 73.175 | 41.675 |
| 2016-03-261:51:31 PM | 41.788 | 162.612 | 73.175 | 41.675 |
| 2016-03-261:51:35 PM | 41.9 | 162.838 | 73.175 | 41.788 |
| 2016-03-261:51:39 PM | 42.012 | 162.95 | 73.175 | 41.675 |
| 2016-03-261:51:43 PM | 42.012 | 163.175 | 73.175 | 41.675 |
| 2016-03-261:51:47 PM | 42.125 | 163.288 | 73.175 | 41.788 |
| 2016-03-261:51:51 PM | 42.125 | 163.513 | 73.175 | 41.788 |
| 2016-03-261:51:55 PM | 42.238 | 163.625 | 73.175 | 41.788 |
| 2016-03-261:51:59 PM | 42.238 | 163.85 | 73.175 | 41.675 |
| 2016-03-261:52:03 PM | 42.35 | 164.075 | 73.175 | 41.562 |
| 2016-03-261:52:07 PM | 42.35 | 164.188 | 73.288 | 41.45 |
| 2016-03-261:52:11 PM | 42.462 | 164.412 | 73.288 | 41.562 |
| 2016-03-261:52:16 PM | 42.575 | 164.525 | 73.175 | 41.675 |
| 2016-03-261:52:20 PM | 42.575 | 164.75 | 73.175 | 41.675 |
| 2016-03-261:52:24 PM | 42.575 | 165.088 | 73.175 | 41.788 |
| 2016-03-261:52:28 PM | 42.575 | 165.2 | 73.175 | 41.788 |
| 2016-03-261:52:32 PM | 42.688 | 165.425 | 73.062 | 41.788 |
| 2016-03-261:52:36 PM | 42.688 | 165.65 | 73.062 | 41.788 |
| 2016-03-261:52:40 PM | 42.688 | 165.763 | 73.062 | 41.788 |
| 2016-03-261:52:44 PM | 42.688 | 165.988 | 73.062 | 41.788 |
| 2016-03-261:52:48 PM | 42.8 | 166.1 | 73.062 | 41.788 |
| 2016-03-261:52:52 PM | 42.8 | 166.325 | 73.062 | 41.9 |
| 2016-03-261:52:56 PM | 42.912 | 166.438 | 72.95 | 42.012 |
| 2016-03-261:53:00 PM | 42.912 | 166.55 | 72.95 | 42.012 |
| 2016-03-261:53:04 PM | 42.912 | 166.775 | 73.062 | 42.012 |
| 2016-03-261:53:08 PM | 43.025 | 166.888 | 73.062 | 42.125 |
| 2016-03-261:53:12 PM | 43.025 | 167.112 | 73.062 | 42.238 |
| 2016-03-261:53:17 PM | 43.138 | 167.225 | 73.062 | 42.35 |
| 2016-03-261:53:21 PM | 43.138 | 167.338 | 73.062 | 42.35 |
| 2016-03-261:53:25 PM | 43.25 | 167.45 | 73.062 | 42.462 |
| 2016-03-261:53:28 PM | 43.25 | 167.675 | 73.062 | 42.462 |
| 2016-03-261:53:32 PM | 43.25 | 167.788 | 73.062 | 42.575 |
| 2016-03-261:53:36 PM | 43.362 | 167.9 | 73.062 | 42.575 |
| 2016-03-261:53:40 PM | 43.362 | 168.013 | 73.062 | 42.575 |
| 2016-03-261:53:44 PM | 43.362 | 168.238 | 73.062 | 42.575 |
| 2016-03-261:53:48 PM | 43.362 | 168.35 | 73.062 | 42.575 |
| 2016-03-261:53:53 PM | 43.475 | 168.462 | 73.175 | 42.575 |
| 2016-03-261:53:57 PM | 43.588 | 168.575 | 73.175 | 42.575 |
| 2016-03-261:54:01 PM | 43.588 | 168.8 | 73.175 | 42.575 |
| 2016-03-261:54:05 PM | 43.7 | 168.912 | 73.062 | 42.575 |
| 2016-03-261:54:09 PM | 43.812 | 169.025 | 73.062 | 42.688 |
| 2016-03-261:54:13 PM | 43.812 | 169.138 | 73.175 | 42.8 |
| 2016-03-261:54:17 PM | 43.925 | 169.362 | 73.175 | 43.025 |
| 2016-03-261:54:21 PM | 43.925 | 169.475 | 73.175 | 43.138 |
| 2016-03-261:54:25 PM | 44.038 | 169.588 | 73.175 | 43.25 |
| 2016-03-261:54:29 PM | 44.038 | 169.812 | 73.175 | 43.25 |
| 2016-03-261:54:33 PM | 44.038 | 169.925 | 73.175 | 43.362 |
| 2016-03-261:54:37 PM | 44.038 | 170.038 | 73.175 | 43.362 |
| 2016-03-261:54:41 PM | 44.15 | 170.263 | 73.175 | 43.475 |
| 2016-03-261:54:45 PM | 44.15 | 170.375 | 73.288 | 43.475 |
| 2016-03-261:54:49 PM | 44.262 | 170.488 | 73.175 | 43.475 |
| 2016-03-261:54:53 PM | 44.262 | 170.712 | 73.175 | 43.588 |
| 2016-03-261:54:57 PM | 44.262 | 170.825 | 73.288 | 43.588 |
| 2016-03-261:55:02 PM | 44.375 | 171.05 | 73.288 | 43.7 |
| 2016-03-261:55:06 PM | 44.375 | 171.162 | 73.288 | 43.7 |
| 2016-03-261:55:10 PM | 44.375 | 171.275 | 73.288 | 43.588 |
| 2016-03-261:55:14 PM | 44.375 | 171.388 | 73.175 | 43.475 |
| 2016-03-261:55:18 PM | 44.262 | 171.388 | 73.175 | 43.588 |
| 2016-03-261:55:22 PM | 44.262 | 171.5 | 73.175 | 43.588 |
| 2016-03-261:55:26 PM | 44.375 | 171.612 | 73.175 | 43.588 |
| 2016-03-261:55:30 PM | 44.375 | 171.725 | 73.175 | 43.588 |
| 2016-03-261:55:34 PM | 44.375 | 171.838 | 73.175 | 43.588 |
| 2016-03-261:55:38 PM | 44.375 | 171.95 | 73.175 | 43.475 |
| 2016-03-261:55:42 PM | 44.375 | 171.95 | 73.175 | 43.475 |
| 2016-03-261:55:46 PM | 44.375 | 171.95 | 73.175 | 43.362 |
| 2016-03-261:55:50 PM | 44.375 | 171.95 | 73.175 | 43.362 |
| 2016-03-261:55:58 PM | 44.375 | 171.95 | 73.175 | 43.475 |
| 2016-03-261:56:02 PM | 44.262 | 171.838 | 73.175 | 43.362 |
| 2016-03-261:56:06 PM | 44.262 | 171.725 | 73.175 | 43.25 |
| 2016-03-261:56:10 PM | 44.262 | 171.612 | 73.175 | 43.362 |
| 2016-03-261:56:14 PM | 44.262 | 171.388 | 73.175 | 43.25 |
| 2016-03-261:56:19 PM | 44.15 | 171.275 | 73.175 | 43.138 |
| 2016-03-261:56:23 PM | 44.15 | 171.275 | 73.175 | 42.912 |
| 2016-03-261:56:27 PM | 44.038 | 171.162 | 73.175 | 42.575 |
| 2016-03-261:56:31 PM | 44.038 | 171.275 | 73.062 | 42.35 |
| 2016-03-261:56:35 PM | 44.038 | 171.162 | 73.062 | 42.125 |
| 2016-03-261:56:39 PM | 44.038 | 171.162 | 73.175 | 42.125 |
| 2016-03-261:56:43 PM | 43.925 | 171.05 | 73.062 | 42.012 |
| 2016-03-261:56:47 PM | 44.038 | 171.05 | 73.062 | 42.125 |
| 2016-03-261:56:51 PM | 43.925 | 171.05 | 73.062 | 42.238 |
| 2016-03-261:56:55 PM | 43.925 | 171.05 | 73.062 | 42.35 |
| 2016-03-261:56:59 PM | 43.925 | 171.05 | 73.062 | 42.462 |
| 2016-03-261:57:03 PM | 43.925 | 171.05 | 73.062 | 42.575 |
| 2016-03-261:57:07 PM | 43.925 | 171.162 | 73.062 | 42.688 |
| 2016-03-261:57:11 PM | 43.925 | 171.162 | 73.062 | 42.688 |
| 2016-03-261:57:15 PM | 44.038 | 171.162 | 73.062 | 42.688 |
| 2016-03-261:57:19 PM | 44.038 | 171.275 | 73.062 | 42.8 |
| 2016-03-261:57:24 PM | 44.038 | 171.05 | 73.062 | 42.912 |
| 2016-03-261:57:28 PM | 44.15 | 171.05 | 73.062 | 42.912 |
| 2016-03-261:57:32 PM | 44.15 | 171.275 | 73.062 | 43.025 |
| 2016-03-261:57:36 PM | 44.262 | 171.388 | 73.062 | 43.138 |
| 2016-03-261:57:40 PM | 44.262 | 171.5 | 73.175 | 43.25 |
| 2016-03-261:57:44 PM | 44.262 | 171.725 | 73.175 | 43.362 |
| 2016-03-261:57:48 PM | 44.262 | 171.838 | 73.175 | 43.475 |
| 2016-03-261:57:52 PM | 44.375 | 171.95 | 73.175 | 43.588 |
| 2016-03-261:57:56 PM | 44.262 | 172.062 | 73.062 | 43.588 |
| 2016-03-261:58:00 PM | 44.375 | 172.062 | 73.062 | 43.588 |
| 2016-03-261:58:04 PM | 44.488 | 172.175 | 73.062 | 43.7 |
| 2016-03-261:58:08 PM | 44.488 | 172.288 | 73.175 | 43.812 |
| 2016-03-261:58:12 PM | 44.488 | 172.4 | 73.062 | 43.925 |
| 2016-03-261:58:16 PM | 44.6 | 172.513 | 73.175 | 44.038 |
| 2016-03-261:58:20 PM | 44.712 | 172.625 | 73.175 | 44.15 |
| 2016-03-261:58:24 PM | 44.6 | 172.738 | 73.175 | 44.262 |
| 2016-03-261:58:29 PM | 44.712 | 172.962 | 73.175 | 44.375 |
| 2016-03-261:58:33 PM | 44.712 | 173.075 | 73.175 | 44.375 |
| 2016-03-261:58:37 PM | 44.712 | 173.188 | 73.175 | 44.6 |
| 2016-03-261:58:41 PM | 44.825 | 173.3 | 73.175 | 44.6 |
| 2016-03-261:58:45 PM | 44.825 | 173.412 | 73.175 | 44.825 |
| 2016-03-261:58:49 PM | 44.938 | 173.638 | 73.175 | 44.825 |
| 2016-03-261:58:53 PM | 45.05 | 173.75 | 73.175 | 44.938 |
| 2016-03-261:58:57 PM | 45.05 | 173.862 | 73.175 | 45.05 |
| 2016-03-261:59:01 PM | 45.05 | 173.975 | 73.175 | 45.162 |
| 2016-03-261:59:05 PM | 45.162 | 174.088 | 73.175 | 45.275 |
| 2016-03-261:59:09 PM | 45.275 | 174.2 | 73.175 | 45.388 |
| 2016-03-261:59:13 PM | 45.275 | 174.425 | 73.175 | 45.5 |
| 2016-03-261:59:17 PM | 45.275 | 174.65 | 73.175 | 45.612 |
| 2016-03-261:59:21 PM | 45.388 | 174.763 | 73.062 | 45.612 |
| 2016-03-261:59:25 PM | 45.388 | 174.875 | 73.175 | 45.612 |
| 2016-03-261:59:29 PM | 45.388 | 175.1 | 73.175 | 45.612 |
| 2016-03-261:59:34 PM | 45.5 | 175.325 | 73.175 | 45.725 |
| 2016-03-261:59:38 PM | 45.5 | 175.438 | 73.175 | 45.612 |
| 2016-03-261:59:42 PM | 45.612 | 175.662 | 73.175 | 45.725 |
| 2016-03-261:59:46 PM | 45.612 | 175.888 | 73.175 | 45.612 |
| 2016-03-261:59:50 PM | 45.725 | 176.112 | 73.175 | 45.388 |
| 2016-03-261:59:54 PM | 45.725 | 176.225 | 73.175 | 45.05 |
| 2016-03-261:59:58 PM | 45.725 | 176.45 | 73.175 | 44.825 |
| 2016-03-262:00:02 PM | 45.838 | 176.675 | 73.175 | 44.6 |
| 2016-03-262:00:06 PM | 45.838 | 176.788 | 73.175 | 44.488 |
| 2016-03-262:00:10 PM | 45.838 | 176.9 | 73.175 | 44.375 |
| 2016-03-262:00:14 PM | 45.838 | 177.013 | 73.175 | 44.262 |
| 2016-03-262:00:18 PM | 45.95 | 177.125 | 73.175 | 44.262 |
| 2016-03-262:00:22 PM | 45.95 | 177.238 | 73.175 | 44.038 |
| 2016-03-262:00:26 PM | 45.95 | 177.238 | 73.175 | 43.925 |
| 2016-03-262:00:30 PM | 45.838 | 177.35 | 73.175 | 43.925 |
| 2016-03-262:00:35 PM | 45.838 | 177.35 | 73.175 | 43.7 |
| 2016-03-262:00:39 PM | 45.838 | 177.238 | 73.175 | 43.588 |
| 2016-03-262:00:43 PM | 45.838 | 177.238 | 73.175 | 43.362 |
| 2016-03-262:00:47 PM | 45.725 | 177.013 | 73.175 | 43.362 |
| 2016-03-262:00:51 PM | 45.725 | 176.788 | 73.175 | 43.475 |
| 2016-03-262:00:55 PM | 45.612 | 176.562 | 73.175 | 43.475 |
| 2016-03-262:00:59 PM | 45.5 | 176.338 | 73.175 | 43.475 |
| 2016-03-262:01:03 PM | 45.388 | 176.112 | 73.175 | 43.588 |
| 2016-03-262:01:07 PM | 45.388 | 175.775 | 73.062 | 43.588 |
| 2016-03-262:01:11 PM | 45.275 | 175.55 | 73.062 | 43.475 |
| 2016-03-262:01:15 PM | 45.05 | 175.325 | 73.062 | 43.475 |
| 2016-03-262:01:19 PM | 45.05 | 174.988 | 73.062 | 43.475 |
| 2016-03-262:01:23 PM | 45.05 | 174.875 | 73.062 | 43.25 |
| 2016-03-262:01:27 PM | 44.938 | 174.65 | 73.062 | 43.138 |
| 2016-03-262:01:32 PM | 44.938 | 174.538 | 73.062 | 42.912 |
| 2016-03-262:01:36 PM | 44.938 | 174.312 | 73.062 | 42.688 |
| 2016-03-262:01:40 PM | 44.825 | 174.088 | 73.175 | 42.575 |
| 2016-03-262:01:44 PM | 44.712 | 173.75 | 73.062 | 42.238 |
| 2016-03-262:01:48 PM | 44.712 | 173.412 | 73.175 | 41.9 |
| 2016-03-262:01:52 PM | 44.6 | 173.075 | 73.175 | 41.562 |
| 2016-03-262:01:56 PM | 44.488 | 172.85 | 73.175 | 41.338 |
| 2016-03-262:02:00 PM | 44.375 | 172.4 | 73.175 | 41.225 |
| 2016-03-262:02:04 PM | 44.375 | 172.062 | 73.175 | 41.112 |
| 2016-03-262:02:08 PM | 44.262 | 171.725 | 73.175 | 41 |
| 2016-03-262:02:12 PM | 44.15 | 171.275 | 73.175 | 40.888 |
| 2016-03-262:02:16 PM | 44.038 | 170.938 | 73.175 | 40.662 |
| 2016-03-262:02:20 PM | 43.925 | 170.488 | 73.175 | 40.55 |
| 2016-03-262:02:24 PM | 43.812 | 170.038 | 73.175 | 40.438 |
| 2016-03-262:02:28 PM | 43.7 | 169.588 | 73.175 | 40.438 |
| 2016-03-262:02:33 PM | 43.588 | 169.025 | 73.175 | 40.438 |
| 2016-03-262:02:37 PM | 43.475 | 168.575 | 73.175 | 40.325 |
| 2016-03-262:02:41 PM | 43.362 | 168.013 | 73.175 | 40.325 |
| 2016-03-262:02:45 PM | 43.138 | 167.562 | 73.175 | 40.1 |
| 2016-03-262:02:49 PM | 43.138 | 167 | 73.175 | 39.875 |
| 2016-03-262:02:53 PM | 43.025 | 166.55 | 73.175 | 39.65 |
| 2016-03-262:02:57 PM | 42.912 | 165.988 | 73.175 | 39.538 |
| 2016-03-262:03:01 PM | 42.8 | 165.425 | 73.175 | 39.312 |
| 2016-03-262:03:05 PM | 42.688 | 164.975 | 73.175 | 39.312 |
| 2016-03-262:03:09 PM | 42.688 | 164.412 | 73.175 | 39.2 |
| 2016-03-262:03:13 PM | 42.575 | 163.962 | 73.175 | 39.2 |
| 2016-03-262:03:17 PM | 42.462 | 163.4 | 73.175 | 39.2 |
| 2016-03-262:03:21 PM | 42.462 | 162.838 | 73.175 | 39.2 |
| 2016-03-262:03:25 PM | 42.35 | 162.275 | 73.175 | 39.2 |
| 2016-03-262:03:29 PM | 42.238 | 161.825 | 73.175 | 39.088 |
| 2016-03-262:03:34 PM | 42.125 | 161.263 | 73.175 | 39.088 |
| 2016-03-262:03:38 PM | 42.125 | 160.812 | 73.175 | 38.862 |
| 2016-03-262:03:42 PM | 42.012 | 160.138 | 73.175 | 38.862 |
| 2016-03-262:03:46 PM | 41.9 | 159.575 | 73.175 | 38.75 |
| 2016-03-262:03:50 PM | 41.9 | 159.125 | 73.175 | 38.638 |
| 2016-03-262:03:54 PM | 41.788 | 158.562 | 73.175 | 38.638 |
| 2016-03-262:03:58 PM | 41.675 | 158 | 73.175 | 38.525 |
| 2016-03-262:04:02 PM | 41.675 | 157.55 | 73.175 | 38.412 |
| 2016-03-262:04:06 PM | 41.45 | 156.988 | 73.175 | 38.412 |
| 2016-03-262:04:10 PM | 41.45 | 156.425 | 73.175 | 38.412 |
| 2016-03-262:04:14 PM | 41.45 | 155.975 | 73.175 | 38.412 |
| 2016-03-262:04:18 PM | 41.338 | 155.412 | 73.062 | 38.3 |
| 2016-03-262:04:22 PM | 41.338 | 154.85 | 73.062 | 38.412 |
| 2016-03-262:04:26 PM | 41.225 | 154.4 | 73.062 | 38.412 |
| 2016-03-262:04:30 PM | 41.225 | 153.838 | 73.062 | 38.412 |
| 2016-03-262:04:35 PM | 41.112 | 153.388 | 73.062 | 38.412 |
| 2016-03-262:04:39 PM | 41 | 152.825 | 73.062 | 38.3 |
| 2016-03-262:04:43 PM | 40.888 | 152.263 | 73.062 | 38.3 |
| 2016-03-262:04:47 PM | 40.775 | 151.7 | 73.062 | 38.188 |
| 2016-03-262:04:51 PM | 40.775 | 151.25 | 73.175 | 38.075 |
| 2016-03-262:04:55 PM | 40.775 | 150.688 | 73.062 | 38.075 |
| 2016-03-262:04:59 PM | 40.662 | 150.238 | 73.062 | 38.075 |
| 2016-03-262:05:03 PM | 40.662 | 149.675 | 73.062 | 38.075 |
| 2016-03-262:05:07 PM | 40.55 | 149.225 | 73.062 | 37.85 |
| 2016-03-262:05:11 PM | 40.55 | 148.775 | 73.062 | 37.738 |
| 2016-03-262:05:15 PM | 40.55 | 148.212 | 73.062 | 37.738 |
| 2016-03-262:05:19 PM | 40.438 | 147.763 | 73.062 | 37.738 |
| 2016-03-262:05:23 PM | 40.325 | 147.2 | 73.062 | 37.625 |
| 2016-03-262:05:27 PM | 40.325 | 146.75 | 73.175 | 37.512 |
| 2016-03-262:05:31 PM | 40.325 | 146.3 | 73.062 | 37.512 |
| 2016-03-262:05:36 PM | 40.212 | 145.85 | 73.062 | 37.4 |
| 2016-03-262:05:40 PM | 40.1 | 145.4 | 73.062 | 37.4 |
| 2016-03-262:05:44 PM | 40.1 | 144.838 | 73.062 | 37.4 |
| 2016-03-262:05:48 PM | 39.988 | 144.388 | 73.062 | 37.512 |
| 2016-03-262:05:52 PM | 39.988 | 143.938 | 73.062 | 37.512 |
| 2016-03-262:05:56 PM | 39.875 | 143.375 | 73.062 | 37.512 |
| 2016-03-262:06:00 PM | 39.762 | 142.925 | 73.062 | 37.512 |
| 2016-03-262:06:04 PM | 39.762 | 142.475 | 73.062 | 37.625 |
| 2016-03-262:06:08 PM | 39.762 | 142.138 | 73.062 | 37.625 |
| 2016-03-262:06:12 PM | 39.65 | 141.688 | 73.062 | 37.625 |
| 2016-03-262:06:16 PM | 39.65 | 141.35 | 73.062 | 37.738 |
| 2016-03-262:06:20 PM | 39.65 | 141.012 | 73.062 | 37.85 |
| 2016-03-262:06:24 PM | 39.538 | 140.675 | 73.062 | 38.075 |
| 2016-03-262:06:28 PM | 39.65 | 140.45 | 73.062 | 38.188 |
| 2016-03-262:06:32 PM | 39.538 | 140.225 | 73.175 | 38.188 |
| 2016-03-262:06:37 PM | 39.538 | 140 | 73.062 | 38.188 |
| 2016-03-262:06:41 PM | 39.65 | 139.888 | 73.062 | 38.3 |
| 2016-03-262:06:45 PM | 39.65 | 139.775 | 73.062 | 38.3 |
| 2016-03-262:06:49 PM | 39.762 | 139.662 | 73.062 | 38.525 |
| 2016-03-262:06:53 PM | 39.762 | 139.55 | 73.062 | 38.638 |
| 2016-03-262:06:57 PM | 39.875 | 139.438 | 73.062 | 38.862 |
| 2016-03-262:07:01 PM | 39.875 | 139.325 | 73.062 | 39.088 |
| 2016-03-262:07:05 PM | 39.988 | 139.1 | 73.062 | 39.312 |
| 2016-03-262:07:09 PM | 39.988 | 138.988 | 73.062 | 39.538 |
| 2016-03-262:07:13 PM | 40.1 | 138.875 | 73.062 | 39.762 |
| 2016-03-262:07:17 PM | 40.212 | 138.875 | 73.062 | 39.988 |
| 2016-03-262:07:21 PM | 40.212 | 138.875 | 73.062 | 40.212 |
| 2016-03-262:07:25 PM | 40.212 | 138.762 | 73.062 | 40.438 |
| 2016-03-262:07:29 PM | 40.325 | 138.762 | 73.062 | 40.662 |
| 2016-03-262:07:33 PM | 40.438 | 138.988 | 73.062 | 40.888 |
| 2016-03-262:07:38 PM | 40.55 | 139.1 | 73.062 | 41.112 |
| 2016-03-262:07:42 PM | 40.662 | 139.325 | 73.062 | 41.338 |
| 2016-03-262:07:46 PM | 40.775 | 139.55 | 73.062 | 41.45 |
| 2016-03-262:07:50 PM | 41 | 139.888 | 73.062 | 41.562 |
| 2016-03-262:07:54 PM | 41.112 | 140.112 | 73.062 | 41.788 |
| 2016-03-262:07:58 PM | 41.338 | 140.45 | 73.062 | 41.788 |
| 2016-03-262:08:02 PM | 41.45 | 140.788 | 73.062 | 41.9 |
| 2016-03-262:08:06 PM | 41.675 | 141.125 | 73.062 | 41.9 |
| 2016-03-262:08:10 PM | 41.788 | 141.575 | 73.062 | 41.9 |
| 2016-03-262:08:14 PM | 42.012 | 141.912 | 73.062 | 41.9 |
| 2016-03-262:08:18 PM | 42.238 | 142.362 | 73.062 | 41.9 |
| 2016-03-262:08:22 PM | 42.35 | 142.7 | 73.062 | 41.788 |
| 2016-03-262:08:26 PM | 42.462 | 143.038 | 73.062 | 41.675 |
| 2016-03-262:08:30 PM | 42.575 | 143.262 | 73.062 | 41.45 |
| 2016-03-262:08:35 PM | 42.688 | 143.488 | 73.062 | 41.338 |
| 2016-03-262:08:39 PM | 42.8 | 143.6 | 73.175 | 41.338 |
| 2016-03-262:08:43 PM | 42.912 | 143.712 | 73.175 | 41.338 |
| 2016-03-262:08:47 PM | 42.912 | 143.825 | 73.175 | 41.225 |
| 2016-03-262:08:51 PM | 42.912 | 143.938 | 73.175 | 41.338 |
| 2016-03-262:08:55 PM | 43.025 | 144.05 | 73.175 | 41.45 |
| 2016-03-262:08:59 PM | 43.025 | 144.05 | 73.175 | 41.338 |
| 2016-03-262:09:03 PM | 42.912 | 143.938 | 73.062 | 41.45 |
| 2016-03-262:09:07 PM | 42.912 | 144.05 | 73.062 | 41.45 |
| 2016-03-262:09:11 PM | 42.912 | 143.938 | 73.062 | 41.338 |
| 2016-03-262:09:15 PM | 42.8 | 143.825 | 73.062 | 41.112 |
| 2016-03-262:09:19 PM | 42.8 | 143.825 | 73.175 | 41 |
| 2016-03-262:09:23 PM | 42.8 | 143.712 | 73.175 | 40.888 |
| 2016-03-262:09:27 PM | 42.8 | 143.6 | 73.175 | 40.775 |
| 2016-03-262:09:31 PM | 42.688 | 143.375 | 73.175 | 40.662 |
| 2016-03-262:09:36 PM | 42.688 | 143.262 | 73.175 | 40.55 |
| 2016-03-262:09:40 PM | 42.575 | 143.038 | 73.175 | 40.325 |
| 2016-03-262:09:44 PM | 42.575 | 142.812 | 73.175 | 40.325 |
| 2016-03-262:09:48 PM | 42.462 | 142.588 | 73.175 | 40.438 |
| 2016-03-262:09:52 PM | 42.462 | 142.362 | 73.175 | 40.55 |
| 2016-03-262:09:56 PM | 42.35 | 142.138 | 73.175 | 40.662 |
| 2016-03-262:10:00 PM | 42.35 | 141.912 | 73.175 | 40.662 |
| 2016-03-262:10:04 PM | 42.238 | 141.575 | 73.175 | 40.775 |
| 2016-03-262:10:08 PM | 42.238 | 141.35 | 73.175 | 40.775 |
| 2016-03-262:10:12 PM | 42.125 | 141.35 | 73.175 | 40.888 |
| 2016-03-262:10:16 PM | 42.012 | 141.35 | 73.175 | 40.888 |
| 2016-03-262:10:20 PM | 42.012 | 141.462 | 73.175 | 41.112 |
| 2016-03-262:10:24 PM | 42.012 | 141.462 | 73.175 | 41.225 |
| 2016-03-262:10:28 PM | 42.125 | 141.575 | 73.175 | 41.338 |
| 2016-03-262:10:33 PM | 42.125 | 141.8 | 73.175 | 41.562 |
| 2016-03-262:10:37 PM | 42.238 | 142.025 | 73.175 | 41.9 |
| 2016-03-262:10:41 PM | 42.238 | 142.25 | 73.175 | 42.012 |
| 2016-03-262:10:45 PM | 42.462 | 142.475 | 73.175 | 42.125 |
| 2016-03-262:10:49 PM | 42.462 | 142.7 | 73.175 | 42.35 |
| 2016-03-262:10:53 PM | 42.575 | 143.038 | 73.175 | 42.462 |
| 2016-03-262:10:57 PM | 42.688 | 143.375 | 73.175 | 42.575 |
| 2016-03-262:11:01 PM | 42.688 | 143.712 | 73.175 | 42.8 |
| 2016-03-262:11:05 PM | 42.8 | 144.05 | 73.175 | 42.912 |
| 2016-03-262:11:09 PM | 42.912 | 144.388 | 73.175 | 43.138 |
| 2016-03-262:11:13 PM | 43.025 | 144.725 | 73.175 | 43.138 |
| 2016-03-262:11:17 PM | 43.138 | 145.062 | 73.175 | 43.138 |
| 2016-03-262:11:21 PM | 43.25 | 145.512 | 73.288 | 43.25 |
| 2016-03-262:11:25 PM | 43.362 | 145.85 | 73.175 | 43.362 |
| 2016-03-262:11:29 PM | 43.475 | 146.3 | 73.288 | 43.475 |
| 2016-03-262:11:33 PM | 43.588 | 146.638 | 73.175 | 43.7 |
| 2016-03-262:11:38 PM | 43.7 | 147.088 | 73.288 | 43.7 |
| 2016-03-262:11:42 PM | 43.812 | 147.425 | 73.288 | 43.812 |
| 2016-03-262:11:46 PM | 43.925 | 147.875 | 73.288 | 43.925 |
| 2016-03-262:11:50 PM | 44.038 | 148.325 | 73.288 | 43.925 |
| 2016-03-262:11:54 PM | 44.15 | 148.662 | 73.175 | 43.925 |
| 2016-03-262:11:58 PM | 44.375 | 149.112 | 73.288 | 43.812 |
| 2016-03-262:12:02 PM | 44.488 | 149.562 | 73.288 | 43.7 |
| 2016-03-262:12:06 PM | 44.6 | 149.9 | 73.288 | 43.588 |
| 2016-03-262:12:10 PM | 44.712 | 150.238 | 73.288 | 43.588 |
| 2016-03-262:12:14 PM | 44.825 | 150.462 | 73.288 | 43.588 |
| 2016-03-262:12:18 PM | 44.938 | 150.688 | 73.288 | 43.475 |
| 2016-03-262:12:22 PM | 44.938 | 150.8 | 73.288 | 43.475 |
| 2016-03-262:12:26 PM | 45.05 | 150.912 | 73.288 | 43.25 |
| 2016-03-262:12:30 PM | 44.938 | 151.025 | 73.288 | 43.138 |
| 2016-03-262:12:35 PM | 45.05 | 151.025 | 73.4 | 43.025 |
| 2016-03-262:12:39 PM | 45.05 | 151.025 | 73.288 | 42.912 |
| 2016-03-262:12:43 PM | 44.938 | 151.025 | 73.288 | 42.912 |
| 2016-03-262:12:47 PM | 44.938 | 150.912 | 73.288 | 42.912 |
| 2016-03-262:12:51 PM | 44.938 | 150.8 | 73.288 | 42.8 |
| 2016-03-262:12:55 PM | 44.825 | 150.688 | 73.4 | 42.8 |
| 2016-03-262:12:59 PM | 44.712 | 150.575 | 73.288 | 42.688 |
| 2016-03-262:13:03 PM | 44.712 | 150.35 | 73.288 | 42.462 |
| 2016-03-262:13:07 PM | 44.6 | 150.238 | 73.288 | 42.35 |
| 2016-03-262:13:11 PM | 44.488 | 150.013 | 73.288 | 42.125 |
| 2016-03-262:13:15 PM | 44.488 | 149.9 | 73.288 | 42.012 |
| 2016-03-262:13:19 PM | 44.375 | 149.675 | 73.288 | 41.9 |
| 2016-03-262:13:23 PM | 44.262 | 149.45 | 73.288 | 41.675 |
| 2016-03-262:13:27 PM | 44.262 | 149.225 | 73.288 | 41.562 |
| 2016-03-262:13:31 PM | 44.15 | 149 | 73.288 | 41.562 |
| 2016-03-262:13:36 PM | 44.038 | 148.662 | 73.288 | 41.562 |
| 2016-03-262:13:40 PM | 44.038 | 148.438 | 73.288 | 41.562 |
| 2016-03-262:13:44 PM | 43.925 | 148.212 | 73.288 | 41.675 |
| 2016-03-262:13:48 PM | 43.925 | 147.875 | 73.288 | 41.788 |
| 2016-03-262:13:52 PM | 43.812 | 147.65 | 73.288 | 41.788 |
| 2016-03-262:13:56 PM | 43.7 | 147.425 | 73.288 | 41.788 |
| 2016-03-262:14:00 PM | 43.7 | 147.088 | 73.288 | 41.788 |
| 2016-03-262:14:04 PM | 43.588 | 146.862 | 73.288 | 41.675 |
| 2016-03-262:14:08 PM | 43.588 | 146.75 | 73.175 | 41.562 |
| 2016-03-262:14:12 PM | 43.588 | 146.525 | 73.288 | 41.45 |
| 2016-03-262:14:16 PM | 43.588 | 146.3 | 73.175 | 41.45 |
| 2016-03-262:14:20 PM | 43.475 | 146.188 | 73.175 | 41.562 |
| 2016-03-262:14:24 PM | 43.475 | 145.962 | 73.175 | 41.45 |
| 2016-03-262:14:28 PM | 43.362 | 145.85 | 73.175 | 41.338 |
| 2016-03-262:14:32 PM | 43.362 | 145.625 | 73.175 | 41.338 |
| 2016-03-262:14:37 PM | 43.362 | 145.512 | 73.175 | 41.338 |
| 2016-03-262:14:41 PM | 43.25 | 145.4 | 73.175 | 41.225 |
| 2016-03-262:14:45 PM | 43.25 | 145.175 | 73.288 | 41.225 |
| 2016-03-262:14:49 PM | 43.25 | 144.95 | 73.175 | 41.225 |
| 2016-03-262:14:53 PM | 43.138 | 144.838 | 73.288 | 41.112 |
| 2016-03-262:14:57 PM | 43.138 | 144.725 | 73.288 | 41.112 |
| 2016-03-262:15:01 PM | 43.138 | 144.5 | 73.175 | 41.112 |
| 2016-03-262:15:05 PM | 43.025 | 144.388 | 73.288 | 41.112 |
| 2016-03-262:15:09 PM | 43.025 | 144.162 | 73.175 | 41.225 |
| 2016-03-262:15:13 PM | 43.025 | 143.938 | 73.175 | 41.225 |
| 2016-03-262:15:17 PM | 42.912 | 143.825 | 73.175 | 41.225 |
| 2016-03-262:15:21 PM | 42.8 | 143.6 | 73.288 | 41.112 |
| 2016-03-262:15:25 PM | 42.8 | 143.375 | 73.288 | 41.112 |
| 2016-03-262:15:29 PM | 42.688 | 143.15 | 73.288 | 41.112 |
| 2016-03-262:15:33 PM | 42.688 | 142.925 | 73.288 | 41 |
| 2016-03-262:15:37 PM | 42.688 | 142.812 | 73.175 | 41.112 |
| 2016-03-262:15:42 PM | 42.575 | 142.475 | 73.288 | 41.112 |
| 2016-03-262:15:46 PM | 42.575 | 142.362 | 73.288 | 41 |
| 2016-03-262:15:50 PM | 42.575 | 142.138 | 73.288 | 40.888 |
| 2016-03-262:15:54 PM | 42.575 | 141.912 | 73.288 | 40.888 |
| 2016-03-262:15:58 PM | 42.575 | 141.688 | 73.288 | 40.775 |
| 2016-03-262:16:02 PM | 42.575 | 141.35 | 73.175 | 40.662 |
| 2016-03-262:16:06 PM | 42.462 | 141.125 | 73.288 | 40.55 |
| 2016-03-262:16:10 PM | 42.462 | 140.9 | 73.175 | 40.438 |
| 2016-03-262:16:14 PM | 42.35 | 140.562 | 73.175 | 40.438 |
| 2016-03-262:16:18 PM | 42.462 | 140.338 | 73.175 | 40.438 |
| 2016-03-262:16:22 PM | 42.35 | 140 | 73.288 | 40.325 |
| 2016-03-262:16:26 PM | 42.35 | 139.662 | 73.175 | 40.325 |
| 2016-03-262:16:30 PM | 42.238 | 139.438 | 73.175 | 40.325 |
| 2016-03-262:16:34 PM | 42.238 | 139.1 | 73.175 | 40.438 |
| 2016-03-262:16:38 PM | 42.238 | 138.762 | 73.175 | 40.325 |
| 2016-03-262:16:43 PM | 42.125 | 138.425 | 73.175 | 40.325 |
| 2016-03-262:16:47 PM | 42.125 | 138.2 | 73.175 | 40.325 |
| 2016-03-262:16:51 PM | 42.125 | 137.862 | 73.175 | 40.212 |
| 2016-03-262:16:55 PM | 42.012 | 137.525 | 73.175 | 40.212 |
| 2016-03-262:16:59 PM | 42.012 | 137.188 | 73.175 | 40.212 |
| 2016-03-262:17:03 PM | 41.9 | 136.962 | 73.062 | 40.325 |
| 2016-03-262:17:07 PM | 41.9 | 136.738 | 73.175 | 40.325 |
| 2016-03-262:17:11 PM | 41.9 | 136.512 | 73.175 | 40.325 |
| 2016-03-262:17:15 PM | 41.9 | 136.4 | 73.062 | 40.325 |
| 2016-03-262:17:19 PM | 41.9 | 136.288 | 73.062 | 40.438 |
| 2016-03-262:17:23 PM | 41.9 | 136.062 | 73.175 | 40.438 |
| 2016-03-262:17:27 PM | 41.9 | 135.95 | 73.062 | 40.55 |
| 2016-03-262:17:31 PM | 41.9 | 135.838 | 73.175 | 40.662 |
| 2016-03-262:17:35 PM | 41.9 | 135.725 | 73.175 | 40.662 |
| 2016-03-262:17:40 PM | 41.9 | 135.612 | 73.175 | 40.888 |
| 2016-03-262:17:44 PM | 41.9 | 135.612 | 73.175 | 40.888 |
| 2016-03-262:17:48 PM | 41.9 | 135.5 | 73.175 | 41.112 |
| 2016-03-262:17:52 PM | 42.012 | 135.5 | 73.175 | 41.338 |
| 2016-03-262:17:56 PM | 41.9 | 135.5 | 73.062 | 41.45 |
| 2016-03-262:18:00 PM | 42.012 | 135.388 | 73.175 | 41.45 |
| 2016-03-262:18:04 PM | 41.9 | 135.388 | 73.175 | 41.562 |
| 2016-03-262:18:08 PM | 42.012 | 135.388 | 73.062 | 41.675 |
| 2016-03-262:18:12 PM | 42.012 | 135.5 | 73.175 | 41.788 |
| 2016-03-262:18:16 PM | 42.125 | 135.725 | 73.175 | 41.9 |
| 2016-03-262:18:20 PM | 42.238 | 135.838 | 73.175 | 42.012 |
| 2016-03-262:18:24 PM | 42.238 | 136.062 | 73.175 | 42.012 |
| 2016-03-262:18:28 PM | 42.35 | 136.4 | 73.175 | 42.012 |
| 2016-03-262:18:32 PM | 42.462 | 136.738 | 73.175 | 42.012 |
| 2016-03-262:18:36 PM | 42.462 | 137.075 | 73.175 | 42.012 |
| 2016-03-262:18:41 PM | 42.575 | 137.412 | 73.175 | 42.012 |
| 2016-03-262:18:45 PM | 42.688 | 137.75 | 73.175 | 42.012 |
| 2016-03-262:18:49 PM | 42.8 | 138.088 | 73.175 | 42.012 |
| 2016-03-262:18:53 PM | 42.912 | 138.2 | 73.175 | 42.012 |
| 2016-03-262:18:57 PM | 43.025 | 138.425 | 73.175 | 41.9 |
| 2016-03-262:19:01 PM | 43.025 | 138.538 | 73.175 | 41.9 |
| 2016-03-262:19:05 PM | 43.138 | 138.762 | 73.175 | 41.788 |
| 2016-03-262:19:09 PM | 43.138 | 138.762 | 73.175 | 41.675 |
| 2016-03-262:19:13 PM | 43.25 | 138.875 | 73.175 | 41.675 |
| 2016-03-262:19:17 PM | 43.25 | 138.875 | 73.062 | 41.562 |
| 2016-03-262:19:21 PM | 43.25 | 138.875 | 73.175 | 41.338 |
| 2016-03-262:19:25 PM | 43.25 | 138.875 | 73.175 | 41.112 |
| 2016-03-262:19:29 PM | 43.25 | 138.875 | 73.175 | 41 |
| 2016-03-262:19:33 PM | 43.25 | 138.762 | 73.175 | 40.888 |
| 2016-03-262:19:37 PM | 43.25 | 138.65 | 73.175 | 40.775 |
| 2016-03-262:19:42 PM | 43.25 | 138.538 | 73.175 | 40.55 |
| 2016-03-262:19:46 PM | 43.138 | 138.312 | 73.062 | 40.55 |
| 2016-03-262:19:50 PM | 43.138 | 138.2 | 73.062 | 40.438 |
| 2016-03-262:19:54 PM | 43.138 | 137.975 | 73.062 | 40.438 |
| 2016-03-262:19:58 PM | 43.025 | 137.75 | 73.175 | 40.325 |
| 2016-03-262:20:02 PM | 43.025 | 137.525 | 73.175 | 40.212 |
| 2016-03-262:20:06 PM | 42.912 | 137.412 | 73.175 | 40.1 |
| 2016-03-262:20:10 PM | 42.912 | 137.188 | 73.062 | 40.1 |
| 2016-03-262:20:14 PM | 42.8 | 136.962 | 73.175 | 40.1 |
| 2016-03-262:20:18 PM | 42.688 | 136.738 | 73.062 | 39.988 |
| 2016-03-262:20:22 PM | 42.575 | 136.512 | 73.062 | 39.988 |
| 2016-03-262:20:26 PM | 42.575 | 136.4 | 73.175 | 39.988 |
| 2016-03-262:20:30 PM | 42.575 | 136.175 | 73.062 | 39.875 |
| 2016-03-262:20:34 PM | 42.462 | 135.95 | 73.175 | 39.988 |
| 2016-03-262:20:39 PM | 42.35 | 135.725 | 73.062 | 39.875 |
| 2016-03-262:20:43 PM | 42.35 | 135.5 | 73.062 | 39.875 |
| 2016-03-262:20:47 PM | 42.35 | 135.388 | 73.062 | 39.875 |
| 2016-03-262:20:51 PM | 42.238 | 135.05 | 73.062 | 39.875 |
| 2016-03-262:20:55 PM | 42.238 | 134.825 | 73.062 | 39.875 |
| 2016-03-262:20:59 PM | 42.238 | 134.6 | 73.062 | 39.875 |
| 2016-03-262:21:03 PM | 42.238 | 134.375 | 73.062 | 39.762 |
| 2016-03-262:21:07 PM | 42.125 | 134.262 | 73.062 | 39.762 |
| 2016-03-262:21:11 PM | 42.125 | 134.038 | 73.062 | 39.762 |
| 2016-03-262:21:15 PM | 42.125 | 133.812 | 73.062 | 39.65 |
| 2016-03-262:21:19 PM | 42.125 | 133.588 | 73.062 | 39.65 |
| 2016-03-262:21:23 PM | 42.125 | 133.362 | 73.062 | 39.65 |
| 2016-03-262:21:27 PM | 42.012 | 133.138 | 73.062 | 39.538 |
| 2016-03-262:21:31 PM | 42.012 | 132.912 | 73.062 | 39.65 |
| 2016-03-262:21:36 PM | 42.012 | 132.688 | 73.062 | 39.538 |
| 2016-03-262:21:40 PM | 42.012 | 132.35 | 73.062 | 39.538 |
| 2016-03-262:21:44 PM | 41.9 | 132.125 | 73.062 | 39.538 |
| 2016-03-262:21:48 PM | 41.9 | 131.9 | 73.062 | 39.538 |
| 2016-03-262:21:52 PM | 41.9 | 131.562 | 73.062 | 39.425 |
| 2016-03-262:21:56 PM | 41.788 | 131.225 | 73.062 | 39.425 |
| 2016-03-262:22:00 PM | 41.788 | 131 | 73.062 | 39.312 |
| 2016-03-262:22:04 PM | 41.675 | 130.662 | 73.062 | 39.312 |
| 2016-03-262:22:08 PM | 41.675 | 130.438 | 73.062 | 39.312 |
| 2016-03-262:22:12 PM | 41.562 | 130.1 | 73.062 | 39.2 |
| 2016-03-262:22:16 PM | 41.562 | 129.762 | 73.062 | 39.2 |
| 2016-03-262:22:20 PM | 41.45 | 129.425 | 73.062 | 39.088 |
| 2016-03-262:22:24 PM | 41.338 | 129.088 | 73.062 | 39.088 |
| 2016-03-262:22:28 PM | 41.338 | 128.75 | 73.062 | 39.088 |
| 2016-03-262:22:32 PM | 41.338 | 128.3 | 72.95 | 39.088 |
| 2016-03-262:22:37 PM | 41.225 | 128.075 | 73.062 | 38.975 |
| 2016-03-262:22:41 PM | 41.112 | 127.625 | 73.062 | 38.975 |
| 2016-03-262:22:45 PM | 41.112 | 127.288 | 72.95 | 38.975 |
| 2016-03-262:22:49 PM | 41.112 | 126.95 | 72.95 | 38.975 |
| 2016-03-262:22:53 PM | 41 | 126.5 | 72.95 | 39.088 |
| 2016-03-262:22:57 PM | 41 | 126.275 | 72.95 | 39.2 |
| 2016-03-262:23:01 PM | 40.888 | 125.825 | 72.95 | 39.312 |
| 2016-03-262:23:05 PM | 40.888 | 125.488 | 72.95 | 39.425 |
| 2016-03-262:23:09 PM | 40.775 | 125.15 | 72.95 | 39.65 |
| 2016-03-262:23:13 PM | 40.775 | 124.812 | 72.95 | 39.762 |
| 2016-03-262:23:17 PM | 40.662 | 124.588 | 72.95 | 39.988 |
| 2016-03-262:23:21 PM | 40.662 | 124.362 | 72.95 | 40.212 |
| 2016-03-262:23:25 PM | 40.662 | 124.25 | 72.95 | 40.325 |
| 2016-03-262:23:29 PM | 40.775 | 124.25 | 72.95 | 40.325 |
| 2016-03-262:23:33 PM | 40.775 | 124.25 | 72.95 | 40.438 |
| 2016-03-262:23:38 PM | 40.888 | 124.362 | 72.838 | 40.55 |
| 2016-03-262:23:42 PM | 41.112 | 124.475 | 72.95 | 40.775 |
| 2016-03-262:23:46 PM | 41.112 | 124.7 | 72.95 | 41 |
| 2016-03-262:23:50 PM | 41.338 | 124.812 | 72.95 | 41.112 |
| 2016-03-262:23:54 PM | 41.45 | 125.038 | 72.95 | 41.338 |
| 2016-03-262:23:58 PM | 41.562 | 125.375 | 72.95 | 41.45 |
| 2016-03-262:24:02 PM | 41.675 | 125.6 | 72.95 | 41.338 |
| 2016-03-262:24:06 PM | 41.788 | 125.938 | 72.95 | 41.338 |
| 2016-03-262:24:10 PM | 42.012 | 126.275 | 72.95 | 41.112 |
| 2016-03-262:24:14 PM | 42.238 | 126.612 | 72.95 | 41 |
| 2016-03-262:24:18 PM | 42.462 | 127.062 | 72.95 | 41.112 |
| 2016-03-262:24:22 PM | 42.575 | 127.512 | 72.95 | 41.112 |
| 2016-03-262:24:26 PM | 42.688 | 127.85 | 72.95 | 41.112 |
| 2016-03-262:24:30 PM | 42.912 | 128.188 | 72.95 | 41.225 |
| 2016-03-262:24:34 PM | 43.138 | 128.525 | 72.95 | 41.338 |
| 2016-03-262:24:38 PM | 43.25 | 128.975 | 72.95 | 41.225 |
| 2016-03-262:24:42 PM | 43.362 | 129.312 | 72.95 | 41.112 |
| 2016-03-262:24:47 PM | 43.475 | 129.762 | 72.95 | 41.112 |
| 2016-03-262:24:51 PM | 43.7 | 130.212 | 72.95 | 41.112 |
| 2016-03-262:24:55 PM | 43.812 | 130.662 | 73.062 | 41 |
| 2016-03-262:24:59 PM | 44.038 | 131.112 | 73.062 | 40.888 |
| 2016-03-262:25:03 PM | 44.15 | 131.45 | 73.062 | 40.888 |
| 2016-03-262:25:07 PM | 44.262 | 131.675 | 72.95 | 40.775 |
| 2016-03-262:25:11 PM | 44.262 | 131.9 | 72.95 | 40.775 |
| 2016-03-262:25:15 PM | 44.375 | 132.012 | 72.95 | 40.775 |
| 2016-03-262:25:19 PM | 44.375 | 132.125 | 72.95 | 40.775 |
| 2016-03-262:25:23 PM | 44.375 | 132.125 | 72.95 | 40.662 |
| 2016-03-262:25:27 PM | 44.375 | 132.125 | 72.95 | 40.662 |
| 2016-03-262:25:31 PM | 44.262 | 132.125 | 72.95 | 40.55 |
| 2016-03-262:25:35 PM | 44.375 | 132.238 | 72.95 | 40.55 |
| 2016-03-262:25:39 PM | 44.262 | 132.238 | 72.95 | 40.55 |
| 2016-03-262:25:43 PM | 44.262 | 132.238 | 72.95 | 40.438 |
| 2016-03-262:25:47 PM | 44.262 | 132.238 | 72.95 | 40.438 |
| 2016-03-262:25:51 PM | 44.262 | 132.238 | 72.95 | 40.212 |
| 2016-03-262:25:56 PM | 44.15 | 132.35 | 72.95 | 40.212 |
| 2016-03-262:26:00 PM | 44.15 | 132.238 | 72.95 | 40.1 |
| 2016-03-262:26:04 PM | 44.15 | 132.35 | 72.95 | 40.1 |
| 2016-03-262:26:08 PM | 44.15 | 132.35 | 72.95 | 40.1 |
| 2016-03-262:26:12 PM | 44.038 | 132.238 | 72.95 | 40.1 |
| 2016-03-262:26:16 PM | 44.038 | 132.238 | 72.95 | 39.988 |
| 2016-03-262:26:20 PM | 43.925 | 132.238 | 72.95 | 39.988 |
| 2016-03-262:26:24 PM | 44.038 | 132.238 | 72.95 | 39.988 |
| 2016-03-262:26:28 PM | 43.925 | 132.125 | 72.95 | 39.988 |
| 2016-03-262:26:32 PM | 43.925 | 132.125 | 72.95 | 39.988 |
| 2016-03-262:26:36 PM | 43.812 | 132.125 | 72.95 | 39.988 |
| 2016-03-262:26:40 PM | 43.812 | 132.125 | 72.95 | 39.988 |
| 2016-03-262:26:44 PM | 43.812 | 132.012 | 72.838 | 39.988 |
| 2016-03-262:26:48 PM | 43.812 | 131.9 | 72.95 | 39.988 |
| 2016-03-262:26:52 PM | 43.812 | 131.788 | 72.95 | 39.875 |
| 2016-03-262:26:57 PM | 43.812 | 131.675 | 72.838 | 39.875 |
| 2016-03-262:27:01 PM | 43.812 | 131.45 | 72.838 | 39.875 |
| 2016-03-262:27:05 PM | 43.7 | 131.338 | 72.95 | 39.762 |
| 2016-03-262:27:09 PM | 43.7 | 131.112 | 72.838 | 39.65 |
| 2016-03-262:27:13 PM | 43.588 | 130.887 | 72.838 | 39.538 |
| 2016-03-262:27:17 PM | 43.588 | 130.662 | 72.838 | 39.425 |
| 2016-03-262:27:21 PM | 43.475 | 130.438 | 72.838 | 39.312 |
| 2016-03-262:27:25 PM | 43.362 | 130.212 | 72.838 | 39.312 |
| 2016-03-262:27:29 PM | 43.362 | 129.875 | 72.838 | 39.2 |
| 2016-03-262:27:33 PM | 43.362 | 129.538 | 72.838 | 39.2 |
| 2016-03-262:27:37 PM | 43.25 | 129.312 | 72.838 | 39.088 |
| 2016-03-262:27:41 PM | 43.138 | 128.975 | 72.838 | 39.088 |
| 2016-03-262:27:45 PM | 43.138 | 128.75 | 72.838 | 39.088 |
| 2016-03-262:27:49 PM | 43.025 | 128.412 | 72.838 | 39.088 |
| 2016-03-262:27:53 PM | 42.912 | 128.075 | 72.838 | 39.088 |
| 2016-03-262:27:57 PM | 42.912 | 127.85 | 72.838 | 39.088 |
| 2016-03-262:28:01 PM | 42.8 | 127.512 | 72.838 | 38.975 |
| 2016-03-262:28:05 PM | 42.688 | 127.175 | 72.838 | 38.975 |
| 2016-03-262:28:09 PM | 42.688 | 126.838 | 72.838 | 38.862 |
| 2016-03-262:28:13 PM | 42.575 | 126.5 | 72.838 | 38.75 |
| 2016-03-262:28:18 PM | 42.575 | 126.275 | 72.838 | 38.75 |
| 2016-03-262:28:22 PM | 42.462 | 126.05 | 72.838 | 38.638 |
| 2016-03-262:28:26 PM | 42.462 | 125.712 | 72.838 | 38.525 |
| 2016-03-262:28:30 PM | 42.35 | 125.488 | 72.838 | 38.412 |
| 2016-03-262:28:34 PM | 42.35 | 125.15 | 72.838 | 38.3 |
| 2016-03-262:28:38 PM | 42.238 | 124.925 | 72.838 | 38.3 |
| 2016-03-262:28:42 PM | 42.125 | 124.588 | 72.838 | 38.188 |
| 2016-03-262:28:46 PM | 42.125 | 124.362 | 72.838 | 38.188 |
| 2016-03-262:28:50 PM | 42.012 | 124.138 | 72.838 | 38.3 |
| 2016-03-262:28:54 PM | 42.012 | 123.8 | 72.838 | 38.3 |
| 2016-03-262:28:58 PM | 41.9 | 123.575 | 72.838 | 38.412 |
| 2016-03-262:29:02 PM | 41.9 | 123.238 | 72.838 | 38.525 |
| 2016-03-262:29:06 PM | 41.9 | 123.012 | 72.838 | 38.638 |
| 2016-03-262:29:10 PM | 41.788 | 122.788 | 72.838 | 38.862 |
| 2016-03-262:29:14 PM | 41.788 | 122.45 | 72.838 | 39.088 |
| 2016-03-262:29:18 PM | 41.788 | 122.225 | 72.838 | 39.2 |
| 2016-03-262:29:22 PM | 41.788 | 121.888 | 72.838 | 39.312 |
| 2016-03-262:29:27 PM | 41.788 | 121.663 | 72.838 | 39.538 |
| 2016-03-262:29:31 PM | 41.675 | 121.663 | 72.838 | 39.762 |
| 2016-03-262:29:35 PM | 41.675 | 121.55 | 72.838 | 39.988 |
| 2016-03-262:29:39 PM | 41.675 | 121.55 | 72.838 | 40.212 |
| 2016-03-262:29:43 PM | 41.675 | 121.663 | 72.838 | 40.438 |
| 2016-03-262:29:47 PM | 41.788 | 121.775 | 72.838 | 40.662 |
| 2016-03-262:29:51 PM | 41.9 | 122 | 72.838 | 40.775 |
| 2016-03-262:29:55 PM | 42.012 | 122.225 | 72.838 | 41 |
| 2016-03-262:29:59 PM | 42.238 | 122.562 | 72.838 | 41.225 |
| 2016-03-262:30:03 PM | 42.238 | 122.9 | 72.838 | 41.338 |
| 2016-03-262:30:07 PM | 42.462 | 123.238 | 72.838 | 41.562 |
| 2016-03-262:30:11 PM | 42.575 | 123.575 | 72.838 | 41.788 |
| 2016-03-262:30:15 PM | 42.688 | 124.025 | 72.838 | 41.9 |
| 2016-03-262:30:19 PM | 42.912 | 124.475 | 72.95 | 42.125 |
| 2016-03-262:30:23 PM | 43.025 | 124.812 | 72.838 | 42.35 |
| 2016-03-262:30:28 PM | 43.25 | 125.375 | 72.95 | 42.575 |
| 2016-03-262:30:32 PM | 43.362 | 125.825 | 72.95 | 42.8 |
| 2016-03-262:30:36 PM | 43.588 | 126.275 | 72.95 | 42.8 |
| 2016-03-262:30:40 PM | 43.7 | 126.725 | 72.95 | 42.912 |
| 2016-03-262:30:44 PM | 43.812 | 127.288 | 72.95 | 43.025 |
| 2016-03-262:30:48 PM | 44.038 | 127.85 | 72.95 | 43.138 |
| 2016-03-262:30:52 PM | 44.15 | 128.412 | 72.95 | 43.138 |
| 2016-03-262:30:56 PM | 44.262 | 128.863 | 72.95 | 43.138 |
| 2016-03-262:31:00 PM | 44.375 | 129.425 | 72.95 | 43.138 |
| 2016-03-262:31:04 PM | 44.488 | 129.875 | 73.062 | 43.138 |
| 2016-03-262:31:08 PM | 44.6 | 130.212 | 73.062 | 43.138 |
| 2016-03-262:31:12 PM | 44.712 | 130.662 | 73.062 | 43.138 |
| 2016-03-262:31:16 PM | 44.6 | 131 | 73.062 | 43.025 |
| 2016-03-262:31:20 PM | 44.712 | 131.338 | 73.062 | 43.025 |
| 2016-03-262:31:24 PM | 44.712 | 131.562 | 73.062 | 43.025 |
| 2016-03-262:31:28 PM | 44.825 | 131.788 | 73.062 | 43.025 |
| 2016-03-262:31:32 PM | 44.825 | 131.9 | 73.062 | 42.8 |
| 2016-03-262:31:36 PM | 44.712 | 132.012 | 73.062 | 42.8 |
| 2016-03-262:31:40 PM | 44.712 | 132.125 | 73.062 | 42.575 |
| 2016-03-262:31:44 PM | 44.712 | 132.238 | 72.95 | 42.462 |
| 2016-03-262:31:49 PM | 44.6 | 132.238 | 73.062 | 42.462 |
| 2016-03-262:31:53 PM | 44.6 | 132.238 | 73.062 | 42.35 |
| 2016-03-262:31:57 PM | 44.488 | 132.238 | 73.062 | 42.35 |
| 2016-03-262:32:01 PM | 44.488 | 132.125 | 73.062 | 42.238 |
| 2016-03-262:32:05 PM | 44.375 | 132.012 | 73.062 | 42.238 |
| 2016-03-262:32:09 PM | 44.262 | 132.012 | 73.062 | 42.012 |
| 2016-03-262:32:13 PM | 44.15 | 131.9 | 73.062 | 41.788 |
| 2016-03-262:32:17 PM | 44.038 | 131.675 | 73.062 | 41.675 |
| 2016-03-262:32:21 PM | 44.038 | 131.562 | 73.062 | 41.45 |
| 2016-03-262:32:25 PM | 43.925 | 131.45 | 73.062 | 41.338 |
| 2016-03-262:32:29 PM | 43.925 | 131.225 | 73.062 | 41.225 |
| 2016-03-262:32:33 PM | 43.812 | 131.112 | 73.062 | 41.112 |
| 2016-03-262:32:37 PM | 43.7 | 130.887 | 73.062 | 41 |
| 2016-03-262:32:41 PM | 43.588 | 130.775 | 73.062 | 41 |
| 2016-03-262:32:45 PM | 43.588 | 130.438 | 73.062 | 41 |
| 2016-03-262:32:49 PM | 43.475 | 130.325 | 73.062 | 40.888 |
| 2016-03-262:32:53 PM | 43.362 | 129.988 | 73.062 | 40.888 |
| 2016-03-262:32:57 PM | 43.362 | 129.762 | 73.062 | 40.888 |
| 2016-03-262:33:01 PM | 43.25 | 129.538 | 73.062 | 40.888 |
| 2016-03-262:33:06 PM | 43.25 | 129.312 | 73.062 | 40.888 |
| 2016-03-262:33:10 PM | 43.138 | 129.088 | 73.062 | 40.888 |
| 2016-03-262:33:14 PM | 43.138 | 128.863 | 73.062 | 40.888 |
| 2016-03-262:33:18 PM | 43.025 | 128.637 | 72.95 | 40.888 |
| 2016-03-262:33:22 PM | 43.025 | 128.3 | 72.95 | 40.888 |
| 2016-03-262:33:26 PM | 42.912 | 128.075 | 73.062 | 40.888 |
| 2016-03-262:33:30 PM | 42.912 | 127.85 | 72.95 | 40.888 |
| 2016-03-262:33:34 PM | 42.8 | 127.512 | 72.95 | 40.775 |
| 2016-03-262:33:38 PM | 42.8 | 127.288 | 72.95 | 40.888 |
| 2016-03-262:33:42 PM | 42.688 | 126.95 | 72.95 | 40.888 |
| 2016-03-262:33:46 PM | 42.688 | 126.725 | 72.95 | 40.888 |
| 2016-03-262:33:50 PM | 42.688 | 126.388 | 72.95 | 40.888 |
| 2016-03-262:33:54 PM | 42.575 | 126.163 | 72.95 | 40.775 |
| 2016-03-262:33:58 PM | 42.575 | 125.825 | 72.95 | 40.775 |
| 2016-03-262:34:02 PM | 42.462 | 125.6 | 72.95 | 40.775 |
| 2016-03-262:34:07 PM | 42.462 | 125.262 | 72.95 | 40.775 |
| 2016-03-262:34:11 PM | 42.35 | 125.038 | 72.95 | 40.775 |
| 2016-03-262:34:15 PM | 42.35 | 124.7 | 72.95 | 40.775 |
| 2016-03-262:34:19 PM | 42.238 | 124.475 | 72.95 | 40.775 |
| 2016-03-262:34:23 PM | 42.125 | 124.138 | 72.95 | 40.775 |
| 2016-03-262:34:27 PM | 42.012 | 123.913 | 72.95 | 40.775 |
| 2016-03-262:34:31 PM | 42.012 | 123.688 | 72.95 | 40.662 |
| 2016-03-262:34:35 PM | 42.012 | 123.35 | 72.95 | 40.662 |
| 2016-03-262:34:39 PM | 41.9 | 123.125 | 72.95 | 40.55 |
| 2016-03-262:34:43 PM | 41.9 | 122.788 | 72.95 | 40.55 |
| 2016-03-262:34:47 PM | 41.788 | 122.562 | 72.838 | 40.438 |
| 2016-03-262:34:51 PM | 41.788 | 122.225 | 72.838 | 40.438 |
| 2016-03-262:34:55 PM | 41.788 | 122 | 72.838 | 40.438 |
| 2016-03-262:34:59 PM | 41.675 | 121.663 | 72.838 | 40.438 |
| 2016-03-262:35:03 PM | 41.675 | 121.438 | 72.838 | 40.438 |
| 2016-03-262:35:08 PM | 41.562 | 121.1 | 72.838 | 40.325 |
| 2016-03-262:35:12 PM | 41.562 | 120.875 | 72.838 | 40.325 |
| 2016-03-262:35:16 PM | 41.45 | 120.65 | 72.838 | 40.325 |
| 2016-03-262:35:20 PM | 41.45 | 120.312 | 72.838 | 40.438 |
| 2016-03-262:35:24 PM | 41.45 | 120.088 | 72.838 | 40.325 |
| 2016-03-262:35:28 PM | 41.338 | 119.75 | 72.838 | 40.325 |
| 2016-03-262:35:32 PM | 41.338 | 119.525 | 72.838 | 40.325 |
| 2016-03-262:35:36 PM | 41.225 | 119.188 | 72.838 | 40.325 |
| 2016-03-262:35:40 PM | 41.225 | 118.962 | 72.838 | 40.212 |
| 2016-03-262:35:44 PM | 41.225 | 118.738 | 72.838 | 39.988 |
| 2016-03-262:35:48 PM | 41.112 | 118.4 | 72.838 | 39.988 |
| 2016-03-262:35:52 PM | 41.112 | 118.175 | 72.725 | 39.762 |
| 2016-03-262:35:56 PM | 41.112 | 117.95 | 72.725 | 39.875 |
| 2016-03-262:36:00 PM | 41.112 | 117.612 | 72.725 | 39.762 |
| 2016-03-262:36:04 PM | 41.112 | 117.388 | 72.725 | 39.762 |
| 2016-03-262:36:08 PM | 41 | 117.163 | 72.725 | 39.65 |
| 2016-03-262:36:12 PM | 41 | 116.825 | 72.725 | 39.65 |
| 2016-03-262:36:17 PM | 40.888 | 116.6 | 72.725 | 39.65 |
| 2016-03-262:36:21 PM | 40.888 | 116.375 | 72.725 | 39.65 |
| 2016-03-262:36:25 PM | 40.775 | 116.15 | 72.725 | 39.65 |
| 2016-03-262:36:29 PM | 40.775 | 115.925 | 72.725 | 39.65 |
| 2016-03-262:36:33 PM | 40.775 | 115.588 | 72.612 | 39.65 |
| 2016-03-262:36:37 PM | 40.662 | 115.362 | 72.612 | 39.65 |
| 2016-03-262:36:41 PM | 40.662 | 115.138 | 72.612 | 39.538 |
| 2016-03-262:36:45 PM | 40.662 | 114.913 | 72.612 | 39.538 |
| 2016-03-262:36:49 PM | 40.55 | 114.575 | 72.612 | 39.425 |
| 2016-03-262:36:53 PM | 40.55 | 114.35 | 72.612 | 39.425 |
| 2016-03-262:36:57 PM | 40.438 | 114.125 | 72.612 | 39.425 |
| 2016-03-262:37:01 PM | 40.438 | 113.9 | 72.612 | 39.425 |
| 2016-03-262:37:05 PM | 40.438 | 113.675 | 72.612 | 39.425 |
| 2016-03-262:37:09 PM | 40.438 | 113.45 | 72.612 | 39.425 |
| 2016-03-262:37:14 PM | 40.325 | 113.225 | 72.612 | 39.312 |
| 2016-03-262:37:18 PM | 40.325 | 113 | 72.612 | 39.2 |
| 2016-03-262:37:22 PM | 40.325 | 112.775 | 72.612 | 39.088 |
| 2016-03-262:37:26 PM | 40.212 | 112.55 | 72.5 | 38.975 |
| 2016-03-262:37:30 PM | 40.212 | 112.325 | 72.612 | 38.975 |
| 2016-03-262:37:34 PM | 40.212 | 111.988 | 72.5 | 38.975 |
| 2016-03-262:37:38 PM | 40.212 | 111.762 | 72.5 | 38.975 |
| 2016-03-262:37:42 PM | 40.212 | 111.65 | 72.5 | 38.862 |
| 2016-03-262:37:46 PM | 40.1 | 111.312 | 72.5 | 38.862 |
| 2016-03-262:37:50 PM | 40.1 | 111.088 | 72.612 | 38.862 |
| 2016-03-262:37:54 PM | 40.1 | 110.975 | 72.5 | 38.75 |
| 2016-03-262:37:58 PM | 40.1 | 110.75 | 72.5 | 38.75 |
| 2016-03-262:38:02 PM | 40.1 | 110.525 | 72.5 | 38.638 |
| 2016-03-262:38:06 PM | 40.1 | 110.413 | 72.5 | 38.638 |
| 2016-03-262:38:10 PM | 39.988 | 110.188 | 72.5 | 38.525 |
| 2016-03-262:38:14 PM | 39.988 | 109.962 | 72.5 | 38.525 |
| 2016-03-262:38:19 PM | 39.988 | 109.738 | 72.5 | 38.525 |
| 2016-03-262:38:23 PM | 39.988 | 109.625 | 72.5 | 38.412 |
| 2016-03-262:38:27 PM | 39.988 | 109.4 | 72.5 | 38.412 |
| 2016-03-262:38:31 PM | 39.988 | 109.175 | 72.5 | 38.412 |
| 2016-03-262:38:35 PM | 39.988 | 108.95 | 72.5 | 38.412 |
| 2016-03-262:38:39 PM | 39.988 | 108.838 | 72.5 | 38.3 |
| 2016-03-262:38:43 PM | 39.988 | 108.612 | 72.5 | 38.3 |
| 2016-03-262:38:47 PM | 39.988 | 108.388 | 72.5 | 38.188 |
| 2016-03-262:38:51 PM | 39.988 | 108.163 | 72.5 | 38.075 |
| 2016-03-262:38:55 PM | 39.875 | 107.938 | 72.5 | 38.075 |
| 2016-03-262:38:59 PM | 39.875 | 107.825 | 72.388 | 37.962 |
| 2016-03-262:39:03 PM | 39.875 | 107.6 | 72.388 | 37.962 |
| 2016-03-262:39:07 PM | 39.762 | 107.375 | 72.388 | 37.85 |
| 2016-03-262:39:11 PM | 39.762 | 107.15 | 72.388 | 37.85 |
| 2016-03-262:39:15 PM | 39.762 | 106.925 | 72.388 | 37.738 |
| 2016-03-262:39:20 PM | 39.762 | 106.812 | 72.388 | 37.625 |
| 2016-03-262:39:24 PM | 39.762 | 106.588 | 72.388 | 37.512 |
| 2016-03-262:39:28 PM | 39.762 | 106.362 | 72.388 | 37.512 |
| 2016-03-262:39:32 PM | 39.65 | 106.138 | 72.388 | 37.512 |
| 2016-03-262:39:36 PM | 39.538 | 105.913 | 72.388 | 37.512 |
| 2016-03-262:39:40 PM | 39.538 | 105.8 | 72.388 | 37.4 |
| 2016-03-262:39:44 PM | 39.538 | 105.575 | 72.388 | 37.4 |
| 2016-03-262:39:48 PM | 39.425 | 105.35 | 72.388 | 37.288 |
| 2016-03-262:39:52 PM | 39.425 | 105.125 | 72.388 | 37.288 |
| 2016-03-262:39:56 PM | 39.425 | 104.9 | 72.388 | 37.175 |
| 2016-03-262:40:00 PM | 39.312 | 104.675 | 72.388 | 37.288 |
| 2016-03-262:40:04 PM | 39.312 | 104.45 | 72.388 | 37.288 |
| 2016-03-262:40:08 PM | 39.312 | 104.225 | 72.388 | 37.288 |
| 2016-03-262:40:12 PM | 39.312 | 104.112 | 72.388 | 37.288 |
| 2016-03-262:40:16 PM | 39.2 | 103.888 | 72.388 | 37.288 |
| 2016-03-262:40:21 PM | 39.2 | 103.663 | 72.388 | 37.288 |
| 2016-03-262:40:25 PM | 39.2 | 103.325 | 72.275 | 37.288 |
| 2016-03-262:40:29 PM | 39.088 | 103.212 | 72.275 | 37.175 |
| 2016-03-262:40:33 PM | 39.088 | 102.988 | 72.388 | 37.062 |
| 2016-03-262:40:37 PM | 39.088 | 102.762 | 72.275 | 36.95 |
| 2016-03-262:40:41 PM | 38.975 | 102.538 | 72.275 | 36.838 |
| 2016-03-262:40:45 PM | 38.975 | 102.312 | 72.275 | 36.838 |
| 2016-03-262:40:49 PM | 38.975 | 102.088 | 72.275 | 36.838 |
| 2016-03-262:40:53 PM | 38.862 | 101.862 | 72.275 | 36.838 |
| 2016-03-262:40:57 PM | 38.862 | 101.638 | 72.275 | 36.725 |
| 2016-03-262:41:01 PM | 38.862 | 101.413 | 72.275 | 36.725 |
| 2016-03-262:41:05 PM | 38.75 | 101.3 | 72.275 | 36.725 |
| 2016-03-262:41:09 PM | 38.75 | 100.962 | 72.275 | 36.725 |
| 2016-03-262:41:13 PM | 38.638 | 100.738 | 72.275 | 36.725 |
| 2016-03-262:41:17 PM | 38.638 | 100.625 | 72.162 | 36.838 |
| 2016-03-262:41:22 PM | 38.638 | 100.4 | 72.162 | 36.838 |
| 2016-03-262:41:26 PM | 38.638 | 100.175 | 72.162 | 36.838 |
| 2016-03-262:41:30 PM | 38.525 | 99.95 | 72.162 | 36.838 |
| 2016-03-262:41:34 PM | 38.525 | 99.725 | 72.162 | 36.95 |
| 2016-03-262:41:38 PM | 38.525 | 99.5 | 72.162 | 36.95 |
| 2016-03-262:41:42 PM | 38.525 | 99.275 | 72.162 | 36.95 |
| 2016-03-262:41:46 PM | 38.412 | 99.05 | 72.162 | 36.95 |
| 2016-03-262:41:50 PM | 38.412 | 98.825 | 72.162 | 36.95 |
| 2016-03-262:41:54 PM | 38.412 | 98.6 | 72.162 | 36.95 |
| 2016-03-262:41:58 PM | 38.412 | 98.375 | 72.162 | 37.062 |
| 2016-03-262:42:02 PM | 38.412 | 98.15 | 72.162 | 36.95 |
| 2016-03-262:42:06 PM | 38.412 | 97.925 | 72.162 | 36.95 |
| 2016-03-262:42:10 PM | 38.3 | 97.7 | 72.162 | 36.95 |
| 2016-03-262:42:14 PM | 38.3 | 97.475 | 72.162 | 36.95 |
| 2016-03-262:42:19 PM | 38.3 | 97.25 | 72.162 | 36.95 |
| 2016-03-262:42:23 PM | 38.3 | 97.025 | 72.162 | 37.062 |
| 2016-03-262:42:27 PM | 38.3 | 96.913 | 72.162 | 37.062 |
| 2016-03-262:42:31 PM | 38.3 | 96.688 | 72.162 | 37.062 |
| 2016-03-262:42:35 PM | 38.3 | 96.462 | 72.162 | 37.175 |
| 2016-03-262:42:39 PM | 38.3 | 96.238 | 72.162 | 37.175 |
| 2016-03-262:42:43 PM | 38.3 | 96.125 | 72.162 | 37.288 |
| 2016-03-262:42:47 PM | 38.3 | 95.9 | 72.162 | 37.288 |
| 2016-03-262:42:51 PM | 38.3 | 95.675 | 72.05 | 37.288 |
| 2016-03-262:42:55 PM | 38.3 | 95.45 | 72.05 | 37.4 |
| 2016-03-262:42:59 PM | 38.3 | 95.338 | 72.05 | 37.4 |
| 2016-03-262:43:03 PM | 38.3 | 95.112 | 72.05 | 37.512 |
| 2016-03-262:43:07 PM | 38.188 | 95 | 72.05 | 37.512 |
| 2016-03-262:43:11 PM | 38.188 | 94.775 | 72.05 | 37.512 |
| 2016-03-262:43:15 PM | 38.3 | 94.663 | 72.05 | 37.512 |
| 2016-03-262:43:19 PM | 38.188 | 94.438 | 72.05 | 37.625 |
| 2016-03-262:43:23 PM | 38.3 | 94.212 | 72.05 | 37.512 |
| 2016-03-262:43:27 PM | 38.3 | 94.1 | 72.05 | 37.512 |
| 2016-03-262:43:32 PM | 38.188 | 93.988 | 72.05 | 37.512 |
| 2016-03-262:43:36 PM | 38.3 | 93.762 | 72.05 | 37.512 |
| 2016-03-262:43:40 PM | 38.188 | 93.65 | 72.05 | 37.512 |
| 2016-03-262:43:44 PM | 38.188 | 93.538 | 72.05 | 37.625 |
| 2016-03-262:43:48 PM | 38.188 | 93.312 | 71.938 | 37.512 |
| 2016-03-262:43:52 PM | 38.188 | 93.2 | 72.05 | 37.625 |
| 2016-03-262:43:56 PM | 38.3 | 93.088 | 71.938 | 37.625 |
| 2016-03-262:44:00 PM | 38.188 | 92.975 | 71.938 | 37.625 |
| 2016-03-262:44:04 PM | 38.188 | 92.75 | 71.938 | 37.738 |
| 2016-03-262:44:08 PM | 38.188 | 92.638 | 72.05 | 37.738 |
| 2016-03-262:44:12 PM | 38.188 | 92.525 | 71.938 | 37.85 |
| 2016-03-262:44:16 PM | 38.188 | 92.525 | 72.05 | 37.85 |
| 2016-03-262:44:20 PM | 38.188 | 92.3 | 71.938 | 37.85 |
| 2016-03-262:44:24 PM | 38.188 | 92.3 | 71.938 | 37.962 |
| 2016-03-262:44:28 PM | 38.188 | 92.188 | 71.938 | 37.962 |
| 2016-03-262:44:33 PM | 38.188 | 92.075 | 71.938 | 38.075 |
| 2016-03-262:44:37 PM | 38.188 | 91.962 | 71.938 | 38.075 |
| 2016-03-262:44:41 PM | 38.188 | 91.85 | 71.938 | 38.3 |
| 2016-03-262:44:45 PM | 38.188 | 91.85 | 71.938 | 38.525 |
| 2016-03-262:44:49 PM | 38.188 | 91.738 | 71.938 | 38.638 |
| 2016-03-262:44:53 PM | 38.188 | 91.625 | 71.938 | 38.975 |
| 2016-03-262:44:57 PM | 38.188 | 91.625 | 71.938 | 39.2 |
| 2016-03-262:45:01 PM | 38.188 | 91.625 | 71.938 | 39.538 |
| 2016-03-262:45:05 PM | 38.3 | 91.625 | 71.938 | 39.762 |
| 2016-03-262:45:09 PM | 38.3 | 91.738 | 71.938 | 39.988 |
| 2016-03-262:45:13 PM | 38.412 | 91.85 | 71.938 | 40.1 |
| 2016-03-262:45:17 PM | 38.525 | 92.188 | 71.938 | 40.325 |
| 2016-03-262:45:21 PM | 38.75 | 92.525 | 71.938 | 40.55 |
| 2016-03-262:45:25 PM | 38.862 | 92.862 | 71.938 | 40.55 |
| 2016-03-262:45:29 PM | 39.088 | 93.312 | 71.938 | 40.662 |
| 2016-03-262:45:34 PM | 39.312 | 93.762 | 71.938 | 40.775 |
| 2016-03-262:45:38 PM | 39.538 | 94.212 | 71.938 | 40.888 |
| 2016-03-262:45:42 PM | 39.762 | 94.775 | 71.938 | 41 |
| 2016-03-262:45:46 PM | 39.988 | 95.225 | 71.938 | 41.112 |
| 2016-03-262:45:50 PM | 40.212 | 95.788 | 71.938 | 41 |
| 2016-03-262:45:54 PM | 40.438 | 96.238 | 71.938 | 41.112 |
| 2016-03-262:45:58 PM | 40.662 | 96.8 | 71.938 | 41.225 |
| 2016-03-262:46:02 PM | 40.775 | 97.25 | 71.938 | 41.338 |
| 2016-03-262:46:06 PM | 41 | 97.812 | 71.938 | 41.45 |
| 2016-03-262:46:10 PM | 41.112 | 98.262 | 71.938 | 41.45 |
| 2016-03-262:46:14 PM | 41.225 | 98.6 | 71.938 | 41.562 |
| 2016-03-262:46:18 PM | 41.45 | 99.05 | 71.938 | 41.562 |
| 2016-03-262:46:22 PM | 41.562 | 99.5 | 71.938 | 41.562 |
| 2016-03-262:46:26 PM | 41.675 | 99.95 | 71.938 | 41.45 |
| 2016-03-262:46:30 PM | 41.675 | 100.288 | 71.938 | 41.338 |
| 2016-03-262:46:34 PM | 41.788 | 100.738 | 71.938 | 41.338 |
| 2016-03-262:46:39 PM | 41.9 | 100.962 | 71.938 | 41.225 |
| 2016-03-262:46:43 PM | 42.012 | 101.413 | 71.938 | 41.112 |
| 2016-03-262:46:47 PM | 42.012 | 101.75 | 71.938 | 41 |
| 2016-03-262:46:51 PM | 42.125 | 102.088 | 71.938 | 41 |
| 2016-03-262:46:55 PM | 42.238 | 102.538 | 71.938 | 41 |
| 2016-03-262:46:59 PM | 42.238 | 102.875 | 71.938 | 40.888 |
| 2016-03-262:47:03 PM | 42.35 | 103.212 | 71.938 | 41 |
| 2016-03-262:47:07 PM | 42.35 | 103.663 | 71.938 | 41 |
| 2016-03-262:47:11 PM | 42.35 | 104 | 71.938 | 41 |
| 2016-03-262:47:15 PM | 42.462 | 104.338 | 71.938 | 41 |
| 2016-03-262:47:19 PM | 42.462 | 104.562 | 71.938 | 41 |
| 2016-03-262:47:23 PM | 42.462 | 104.788 | 71.938 | 41 |
| 2016-03-262:47:27 PM | 42.462 | 105.012 | 71.938 | 40.888 |
| 2016-03-262:47:31 PM | 42.462 | 105.125 | 71.938 | 41 |
| 2016-03-262:47:35 PM | 42.462 | 105.35 | 71.938 | 41 |
| 2016-03-262:47:40 PM | 42.35 | 105.462 | 71.938 | 41 |
| 2016-03-262:47:44 PM | 42.462 | 105.575 | 71.938 | 41 |
| 2016-03-262:47:48 PM | 42.35 | 105.688 | 71.938 | 41.112 |
| 2016-03-262:47:52 PM | 42.35 | 105.688 | 71.938 | 41.225 |
| 2016-03-262:47:56 PM | 42.35 | 105.8 | 71.938 | 41.338 |
| 2016-03-262:48:00 PM | 42.238 | 105.8 | 71.938 | 41.45 |
| 2016-03-262:48:04 PM | 42.238 | 105.913 | 71.938 | 41.562 |
| 2016-03-262:48:08 PM | 42.125 | 105.913 | 71.938 | 41.788 |
| 2016-03-262:48:12 PM | 42.125 | 106.025 | 71.938 | 42.012 |
| 2016-03-262:48:16 PM | 42.125 | 106.138 | 71.938 | 42.125 |
| 2016-03-262:48:20 PM | 42.238 | 106.362 | 71.825 | 42.238 |
| 2016-03-262:48:24 PM | 42.238 | 106.7 | 71.938 | 42.238 |
| 2016-03-262:48:28 PM | 42.35 | 107.038 | 71.938 | 42.238 |
| 2016-03-262:48:32 PM | 42.575 | 107.375 | 71.938 | 42.238 |
| 2016-03-262:48:36 PM | 42.688 | 107.825 | 71.938 | 42.238 |
| 2016-03-262:48:40 PM | 42.8 | 108.163 | 71.938 | 42.125 |
| 2016-03-262:48:45 PM | 43.025 | 108.612 | 71.938 | 42.238 |
| 2016-03-262:48:49 PM | 43.138 | 109.062 | 71.938 | 42.35 |
| 2016-03-262:48:53 PM | 43.362 | 109.512 | 71.938 | 42.575 |
| 2016-03-262:48:57 PM | 43.475 | 109.85 | 71.938 | 42.688 |
| 2016-03-262:49:01 PM | 43.588 | 110.3 | 71.938 | 42.8 |
| 2016-03-262:49:05 PM | 43.812 | 110.638 | 71.938 | 42.8 |
| 2016-03-262:49:09 PM | 43.812 | 110.975 | 71.938 | 42.8 |
| 2016-03-262:49:13 PM | 43.925 | 111.312 | 71.938 | 42.912 |
| 2016-03-262:49:17 PM | 44.038 | 111.762 | 71.938 | 42.912 |
| 2016-03-262:49:21 PM | 44.15 | 112.1 | 71.938 | 43.138 |
| 2016-03-262:49:25 PM | 44.262 | 112.55 | 71.938 | 43.25 |
| 2016-03-262:49:29 PM | 44.375 | 113 | 71.938 | 43.362 |
| 2016-03-262:49:33 PM | 44.488 | 113.562 | 71.938 | 43.475 |
| 2016-03-262:49:37 PM | 44.6 | 114.012 | 71.938 | 43.588 |
| 2016-03-262:49:41 PM | 44.712 | 114.462 | 71.938 | 43.7 |
| 2016-03-262:49:45 PM | 44.938 | 115.025 | 72.05 | 43.812 |
| 2016-03-262:49:49 PM | 45.162 | 115.588 | 71.938 | 43.925 |
| 2016-03-262:49:53 PM | 45.275 | 116.15 | 71.938 | 43.925 |
| 2016-03-262:49:57 PM | 45.388 | 116.6 | 71.938 | 43.812 |
| 2016-03-262:50:01 PM | 45.5 | 117.163 | 72.05 | 43.812 |
| 2016-03-262:50:05 PM | 45.612 | 117.725 | 72.05 | 43.812 |
| 2016-03-262:50:09 PM | 45.838 | 118.288 | 72.05 | 43.7 |
| 2016-03-262:50:13 PM | 45.95 | 118.85 | 72.05 | 43.7 |
| 2016-03-262:50:17 PM | 46.175 | 119.3 | 72.05 | 43.812 |
| 2016-03-262:50:21 PM | 46.288 | 119.975 | 72.05 | 43.812 |
| 2016-03-262:50:25 PM | 46.4 | 120.425 | 72.05 | 43.7 |
| 2016-03-262:50:29 PM | 46.512 | 120.988 | 72.05 | 43.7 |
| 2016-03-262:50:33 PM | 46.625 | 121.438 | 72.05 | 43.7 |
| 2016-03-262:50:37 PM | 46.738 | 121.888 | 72.05 | 43.588 |
| 2016-03-262:50:41 PM | 46.85 | 122.338 | 72.05 | 43.588 |
| 2016-03-262:50:45 PM | 46.962 | 122.788 | 72.05 | 43.475 |
| 2016-03-262:50:49 PM | 46.962 | 123.125 | 72.05 | 43.25 |
| 2016-03-262:50:53 PM | 46.962 | 123.35 | 72.05 | 43.138 |
| 2016-03-262:50:58 PM | 47.075 | 123.575 | 72.05 | 43.138 |
| 2016-03-262:51:02 PM | 47.075 | 123.8 | 72.05 | 43.025 |
| 2016-03-262:51:06 PM | 47.075 | 123.913 | 72.05 | 43.025 |
| 2016-03-262:51:10 PM | 47.075 | 124.138 | 72.05 | 42.912 |
| 2016-03-262:51:14 PM | 46.962 | 124.25 | 72.05 | 42.688 |
| 2016-03-262:51:18 PM | 46.962 | 124.362 | 72.05 | 42.575 |
| 2016-03-262:51:22 PM | 46.962 | 124.362 | 72.05 | 42.462 |
| 2016-03-262:51:26 PM | 46.85 | 124.362 | 72.162 | 42.35 |
| 2016-03-262:51:30 PM | 46.85 | 124.362 | 72.05 | 42.238 |
| 2016-03-262:51:34 PM | 46.738 | 124.25 | 72.05 | 42.125 |
| 2016-03-262:51:38 PM | 46.738 | 124.25 | 72.162 | 42.125 |
| 2016-03-262:51:42 PM | 46.625 | 124.25 | 72.05 | 42.012 |
| 2016-03-262:51:47 PM | 46.512 | 124.138 | 72.05 | 42.012 |
| 2016-03-262:51:51 PM | 46.4 | 124.025 | 72.05 | 41.9 |
| 2016-03-262:51:55 PM | 46.288 | 123.913 | 72.05 | 41.9 |
| 2016-03-262:51:59 PM | 46.175 | 123.8 | 72.05 | 41.9 |
| 2016-03-262:52:03 PM | 46.062 | 123.575 | 72.05 | 41.788 |
| 2016-03-262:52:07 PM | 45.95 | 123.462 | 72.05 | 41.675 |
| 2016-03-262:52:11 PM | 45.838 | 123.35 | 72.162 | 41.562 |
| 2016-03-262:52:15 PM | 45.725 | 123.125 | 72.05 | 41.45 |
| 2016-03-262:52:19 PM | 45.612 | 123.012 | 72.05 | 41.338 |
| 2016-03-262:52:23 PM | 45.5 | 122.788 | 72.05 | 41.225 |
| 2016-03-262:52:27 PM | 45.388 | 122.562 | 72.05 | 41.112 |
| 2016-03-262:52:31 PM | 45.275 | 122.338 | 72.05 | 41 |
| 2016-03-262:52:35 PM | 45.275 | 122.225 | 72.05 | 41 |
| 2016-03-262:52:39 PM | 45.162 | 122 | 72.05 | 40.775 |
| 2016-03-262:52:43 PM | 44.938 | 121.775 | 72.162 | 40.775 |
| 2016-03-262:52:47 PM | 44.938 | 121.663 | 72.162 | 40.662 |
| 2016-03-262:52:51 PM | 44.825 | 121.438 | 72.05 | 40.662 |
| 2016-03-262:52:55 PM | 44.6 | 121.212 | 72.162 | 40.662 |
| 2016-03-262:52:59 PM | 44.488 | 120.988 | 72.05 | 40.55 |
| 2016-03-262:53:03 PM | 44.375 | 120.762 | 72.162 | 40.55 |
| 2016-03-262:53:07 PM | 44.375 | 120.538 | 72.05 | 40.438 |
| 2016-03-262:53:11 PM | 44.15 | 120.425 | 72.05 | 40.55 |
| 2016-03-262:53:15 PM | 44.15 | 120.2 | 72.162 | 40.438 |
| 2016-03-262:53:19 PM | 44.038 | 119.975 | 72.05 | 40.438 |
| 2016-03-262:53:23 PM | 44.038 | 119.75 | 72.05 | 40.325 |
| 2016-03-262:53:27 PM | 43.925 | 119.525 | 72.05 | 40.325 |
| 2016-03-262:53:31 PM | 43.812 | 119.3 | 72.162 | 40.325 |
| 2016-03-262:53:35 PM | 43.812 | 119.188 | 72.05 | 40.325 |
| 2016-03-262:53:39 PM | 43.7 | 118.962 | 72.05 | 40.325 |
| 2016-03-262:53:43 PM | 43.7 | 118.738 | 72.162 | 40.325 |
| 2016-03-262:53:47 PM | 43.588 | 118.625 | 72.162 | 40.212 |
| 2016-03-262:53:51 PM | 43.475 | 118.288 | 72.05 | 40.212 |
| 2016-03-262:53:55 PM | 43.475 | 118.175 | 72.162 | 40.325 |
| 2016-03-262:53:59 PM | 43.362 | 117.95 | 72.05 | 40.438 |
| 2016-03-262:54:03 PM | 43.362 | 117.725 | 72.05 | 40.438 |
| 2016-03-262:54:07 PM | 43.25 | 117.612 | 72.162 | 40.55 |
| 2016-03-262:54:11 PM | 43.25 | 117.388 | 72.05 | 40.55 |
| 2016-03-262:54:16 PM | 43.25 | 117.275 | 72.05 | 40.55 |
| 2016-03-262:54:20 PM | 43.138 | 117.163 | 72.05 | 40.55 |
| 2016-03-262:54:24 PM | 43.25 | 116.938 | 72.05 | 40.438 |
| 2016-03-262:54:28 PM | 43.138 | 116.938 | 72.05 | 40.438 |
| 2016-03-262:54:32 PM | 43.138 | 116.825 | 72.05 | 40.438 |
| 2016-03-262:54:36 PM | 43.138 | 116.712 | 72.05 | 40.438 |
| 2016-03-262:54:40 PM | 43.138 | 116.6 | 72.05 | 40.325 |
| 2016-03-262:54:44 PM | 43.138 | 116.6 | 72.05 | 40.325 |
| 2016-03-262:54:48 PM | 43.138 | 116.488 | 72.05 | 40.212 |
| 2016-03-262:54:52 PM | 43.138 | 116.375 | 72.05 | 40.1 |
| 2016-03-262:54:56 PM | 43.138 | 116.262 | 72.05 | 40.1 |
| 2016-03-262:55:00 PM | 43.138 | 116.15 | 72.05 | 40.212 |
| 2016-03-262:55:04 PM | 43.138 | 116.038 | 72.05 | 40.212 |
| 2016-03-262:55:08 PM | 43.138 | 115.925 | 72.05 | 40.212 |
| 2016-03-262:55:12 PM | 43.025 | 115.812 | 72.05 | 40.325 |
| 2016-03-262:55:16 PM | 43.025 | 115.7 | 72.05 | 40.212 |
| 2016-03-262:55:20 PM | 42.912 | 115.7 | 72.05 | 40.212 |
| 2016-03-262:55:24 PM | 42.912 | 115.475 | 72.05 | 40.325 |
| 2016-03-262:55:28 PM | 42.912 | 115.475 | 72.05 | 40.212 |
| 2016-03-262:55:32 PM | 42.912 | 115.362 | 72.05 | 40.212 |
| 2016-03-262:55:36 PM | 42.912 | 115.25 | 72.05 | 40.212 |
| 2016-03-262:55:40 PM | 42.912 | 115.25 | 72.05 | 40.212 |
| 2016-03-262:55:44 PM | 42.912 | 115.138 | 72.05 | 40.325 |
| 2016-03-262:55:48 PM | 42.912 | 115.025 | 72.05 | 40.325 |
| 2016-03-262:55:52 PM | 42.912 | 115.025 | 72.05 | 40.325 |
| 2016-03-262:55:56 PM | 42.912 | 114.913 | 72.05 | 40.325 |
| 2016-03-262:56:00 PM | 42.912 | 114.8 | 71.938 | 40.438 |
| 2016-03-262:56:04 PM | 42.912 | 114.8 | 72.05 | 40.55 |
| 2016-03-262:56:08 PM | 42.912 | 114.688 | 72.05 | 40.662 |
| 2016-03-262:56:12 PM | 42.912 | 114.575 | 72.05 | 40.775 |
| 2016-03-262:56:16 PM | 42.912 | 114.575 | 71.938 | 40.775 |
| 2016-03-262:56:20 PM | 42.912 | 114.462 | 71.938 | 40.888 |
| 2016-03-262:56:24 PM | 42.912 | 114.462 | 71.938 | 40.775 |
| 2016-03-262:56:28 PM | 42.912 | 114.462 | 71.938 | 40.775 |
| 2016-03-262:56:33 PM | 43.025 | 114.462 | 71.938 | 40.888 |
| 2016-03-262:56:37 PM | 43.025 | 114.462 | 71.938 | 40.888 |
| 2016-03-262:56:41 PM | 43.138 | 114.575 | 71.938 | 41 |
| 2016-03-262:56:45 PM | 43.138 | 114.575 | 71.938 | 41 |
| 2016-03-262:56:49 PM | 43.25 | 114.688 | 71.938 | 40.888 |
| 2016-03-262:56:53 PM | 43.362 | 114.688 | 71.938 | 40.888 |
| 2016-03-262:56:57 PM | 43.362 | 114.8 | 71.938 | 41 |
| 2016-03-262:57:01 PM | 43.362 | 114.8 | 71.938 | 41.112 |
| 2016-03-262:57:05 PM | 43.475 | 114.8 | 71.938 | 41.338 |
| 2016-03-262:57:09 PM | 43.475 | 114.8 | 71.938 | 41.338 |
| 2016-03-262:57:13 PM | 43.475 | 114.8 | 71.938 | 41.45 |
| 2016-03-262:57:17 PM | 43.588 | 114.913 | 71.938 | 41.562 |
| 2016-03-262:57:21 PM | 43.475 | 114.8 | 71.938 | 41.788 |
| 2016-03-262:57:25 PM | 43.475 | 114.913 | 71.938 | 41.788 |
| 2016-03-262:57:29 PM | 43.588 | 115.025 | 71.938 | 41.788 |
| 2016-03-262:57:33 PM | 43.588 | 115.25 | 71.938 | 41.675 |
| 2016-03-262:57:37 PM | 43.7 | 115.475 | 71.938 | 41.675 |
| 2016-03-262:57:41 PM | 43.925 | 115.812 | 71.938 | 41.562 |
| 2016-03-262:57:45 PM | 44.038 | 116.038 | 71.938 | 41.562 |
| 2016-03-262:57:49 PM | 44.15 | 116.375 | 71.938 | 41.562 |
| 2016-03-262:57:53 PM | 44.375 | 116.712 | 71.938 | 41.562 |
| 2016-03-262:57:57 PM | 44.488 | 116.938 | 71.938 | 41.562 |
| 2016-03-262:58:01 PM | 44.488 | 117.05 | 71.938 | 41.562 |
| 2016-03-262:58:05 PM | 44.6 | 117.163 | 71.938 | 41.562 |
| 2016-03-262:58:09 PM | 44.6 | 117.275 | 72.05 | 41.562 |
| 2016-03-262:58:13 PM | 44.6 | 117.388 | 71.938 | 41.562 |
| 2016-03-262:58:18 PM | 44.6 | 117.388 | 72.05 | 41.562 |
| 2016-03-262:58:22 PM | 44.712 | 117.388 | 71.938 | 41.562 |
| 2016-03-262:58:26 PM | 44.6 | 117.388 | 71.938 | 41.562 |
| 2016-03-262:58:30 PM | 44.6 | 117.388 | 71.938 | 41.562 |
| 2016-03-262:58:34 PM | 44.488 | 117.388 | 71.938 | 41.562 |
| 2016-03-262:58:38 PM | 44.488 | 117.275 | 71.938 | 41.675 |
| 2016-03-262:58:42 PM | 44.488 | 117.275 | 72.05 | 41.675 |
| 2016-03-262:58:46 PM | 44.375 | 117.163 | 71.938 | 41.788 |
| 2016-03-262:58:50 PM | 44.375 | 117.163 | 71.938 | 41.788 |
| 2016-03-262:58:54 PM | 44.262 | 117.05 | 71.938 | 41.788 |
| 2016-03-262:58:58 PM | 44.262 | 116.938 | 71.938 | 41.675 |
| 2016-03-262:59:02 PM | 44.15 | 116.938 | 71.938 | 41.675 |
| 2016-03-262:59:06 PM | 44.15 | 116.825 | 71.938 | 41.562 |
| 2016-03-262:59:10 PM | 44.15 | 116.825 | 71.938 | 41.562 |
| 2016-03-262:59:15 PM | 44.038 | 116.712 | 71.938 | 41.338 |
| 2016-03-262:59:19 PM | 44.038 | 116.712 | 71.938 | 41.225 |
| 2016-03-262:59:23 PM | 44.038 | 116.6 | 71.938 | 41.225 |
| 2016-03-262:59:27 PM | 44.038 | 116.488 | 71.938 | 41.112 |
| 2016-03-262:59:31 PM | 43.925 | 116.488 | 71.938 | 41 |
| 2016-03-262:59:35 PM | 43.925 | 116.375 | 71.938 | 41 |
| 2016-03-262:59:39 PM | 43.812 | 116.262 | 71.938 | 41 |
| 2016-03-262:59:43 PM | 43.812 | 116.038 | 71.938 | 40.888 |
| 2016-03-262:59:47 PM | 43.7 | 115.925 | 71.938 | 40.775 |
| 2016-03-262:59:51 PM | 43.7 | 115.812 | 71.938 | 40.662 |
| 2016-03-262:59:55 PM | 43.588 | 115.588 | 71.938 | 40.55 |
| 2016-03-262:59:59 PM | 43.475 | 115.475 | 71.938 | 40.438 |
| 2016-03-263:00:03 PM | 43.475 | 115.25 | 71.938 | 40.212 |
| 2016-03-263:00:07 PM | 43.362 | 115.025 | 71.938 | 40.1 |
| 2016-03-263:00:11 PM | 43.362 | 114.913 | 72.05 | 40.1 |
| 2016-03-263:00:15 PM | 43.25 | 114.688 | 72.05 | 40.1 |
| 2016-03-263:00:20 PM | 43.138 | 114.575 | 71.938 | 40.1 |
| 2016-03-263:00:24 PM | 43.025 | 114.35 | 71.938 | 39.988 |
| 2016-03-263:00:28 PM | 43.025 | 114.125 | 71.938 | 39.988 |
| 2016-03-263:00:32 PM | 42.912 | 113.9 | 71.938 | 39.875 |
| 2016-03-263:00:36 PM | 42.912 | 113.675 | 71.938 | 39.875 |
| 2016-03-263:00:40 PM | 42.8 | 113.45 | 71.938 | 39.875 |
| 2016-03-263:00:44 PM | 42.8 | 113.225 | 71.938 | 39.875 |
| 2016-03-263:00:48 PM | 42.8 | 113 | 71.938 | 39.875 |
| 2016-03-263:00:52 PM | 42.688 | 112.888 | 71.938 | 39.762 |
| 2016-03-263:00:56 PM | 42.688 | 112.663 | 71.938 | 39.875 |
| 2016-03-263:01:00 PM | 42.688 | 112.325 | 71.938 | 39.875 |
| 2016-03-263:01:04 PM | 42.575 | 112.1 | 71.938 | 39.875 |
| 2016-03-263:01:08 PM | 42.575 | 111.875 | 71.938 | 39.875 |
| 2016-03-263:01:12 PM | 42.462 | 111.762 | 71.938 | 39.875 |
| 2016-03-263:01:17 PM | 42.35 | 111.425 | 71.938 | 39.875 |
| 2016-03-263:01:21 PM | 42.35 | 111.312 | 71.938 | 39.875 |
| 2016-03-263:01:25 PM | 42.35 | 111.088 | 71.825 | 39.875 |
| 2016-03-263:01:29 PM | 42.238 | 110.75 | 71.825 | 39.875 |
| 2016-03-263:01:33 PM | 42.125 | 110.638 | 71.825 | 39.762 |
| 2016-03-263:01:37 PM | 42.125 | 110.413 | 71.938 | 39.762 |
| 2016-03-263:01:41 PM | 42.125 | 110.075 | 71.825 | 39.65 |
| 2016-03-263:01:45 PM | 42.012 | 109.962 | 71.825 | 39.65 |
| 2016-03-263:01:49 PM | 42.012 | 109.625 | 71.825 | 39.65 |
| 2016-03-263:01:53 PM | 42.012 | 109.4 | 71.825 | 39.65 |
| 2016-03-263:01:57 PM | 41.9 | 109.175 | 71.825 | 39.762 |
| 2016-03-263:02:01 PM | 41.788 | 108.95 | 71.825 | 39.65 |
| 2016-03-263:02:05 PM | 41.788 | 108.725 | 71.825 | 39.538 |
| 2016-03-263:02:09 PM | 41.788 | 108.5 | 71.825 | 39.538 |
| 2016-03-263:02:13 PM | 41.788 | 108.275 | 71.825 | 39.425 |
| 2016-03-263:02:18 PM | 41.675 | 108.05 | 71.825 | 39.425 |
| 2016-03-263:02:22 PM | 41.675 | 107.938 | 71.825 | 39.425 |
| 2016-03-263:02:26 PM | 41.675 | 107.6 | 71.825 | 39.425 |
| 2016-03-263:02:30 PM | 41.675 | 107.375 | 71.825 | 39.538 |
| 2016-03-263:02:34 PM | 41.562 | 107.15 | 71.825 | 39.538 |
| 2016-03-263:02:38 PM | 41.562 | 106.925 | 71.825 | 39.538 |
| 2016-03-263:02:42 PM | 41.562 | 106.7 | 71.825 | 39.425 |
| 2016-03-263:02:46 PM | 41.562 | 106.475 | 71.825 | 39.425 |
| 2016-03-263:02:50 PM | 41.45 | 106.362 | 71.825 | 39.425 |
| 2016-03-263:02:54 PM | 41.45 | 106.025 | 71.825 | 39.425 |
| 2016-03-263:02:58 PM | 41.45 | 105.913 | 71.825 | 39.425 |
| 2016-03-263:03:02 PM | 41.338 | 105.688 | 71.825 | 39.425 |
| 2016-03-263:03:06 PM | 41.338 | 105.462 | 71.825 | 39.538 |
| 2016-03-263:03:10 PM | 41.338 | 105.238 | 71.825 | 39.538 |
| 2016-03-263:03:15 PM | 41.225 | 105.012 | 71.825 | 39.538 |
| 2016-03-263:03:19 PM | 41.225 | 104.9 | 71.712 | 39.425 |
| 2016-03-263:03:23 PM | 41.225 | 104.675 | 71.712 | 39.425 |
| 2016-03-263:03:27 PM | 41.112 | 104.45 | 71.712 | 39.425 |
| 2016-03-263:03:31 PM | 41.112 | 104.225 | 71.712 | 39.425 |
| 2016-03-263:03:35 PM | 41.112 | 104.112 | 71.825 | 39.538 |
| 2016-03-263:03:39 PM | 41 | 103.775 | 71.712 | 39.425 |
| 2016-03-263:03:43 PM | 41 | 103.663 | 71.712 | 39.425 |
| 2016-03-263:03:47 PM | 41 | 103.438 | 71.712 | 39.425 |
| 2016-03-263:03:51 PM | 41 | 103.325 | 71.712 | 39.312 |
| 2016-03-263:03:55 PM | 41 | 103.1 | 71.712 | 39.2 |
| 2016-03-263:03:59 PM | 40.888 | 102.875 | 71.712 | 39.2 |
| 2016-03-263:04:03 PM | 40.888 | 102.762 | 71.712 | 39.2 |
| 2016-03-263:04:07 PM | 40.888 | 102.538 | 71.712 | 39.088 |
| 2016-03-263:04:11 PM | 40.775 | 102.312 | 71.712 | 39.088 |
| 2016-03-263:04:16 PM | 40.775 | 102.2 | 71.712 | 39.088 |
| 2016-03-263:04:20 PM | 40.775 | 101.975 | 71.712 | 39.088 |
| 2016-03-263:04:24 PM | 40.775 | 101.75 | 71.712 | 39.088 |
| 2016-03-263:04:28 PM | 40.662 | 101.638 | 71.712 | 39.088 |
| 2016-03-263:04:32 PM | 40.662 | 101.413 | 71.712 | 39.088 |
| 2016-03-263:04:36 PM | 40.55 | 101.188 | 71.712 | 39.088 |
| 2016-03-263:04:40 PM | 40.55 | 101.075 | 71.712 | 38.975 |
| 2016-03-263:04:44 PM | 40.55 | 100.962 | 71.712 | 38.862 |
| 2016-03-263:04:48 PM | 40.438 | 100.738 | 71.712 | 38.975 |
| 2016-03-263:04:52 PM | 40.438 | 100.512 | 71.712 | 38.862 |
| 2016-03-263:04:56 PM | 40.438 | 100.4 | 71.712 | 38.75 |
| 2016-03-263:05:00 PM | 40.325 | 100.175 | 71.712 | 38.75 |
| 2016-03-263:05:04 PM | 40.325 | 100.062 | 71.712 | 38.75 |
| 2016-03-263:05:08 PM | 40.212 | 99.838 | 71.712 | 38.638 |
| 2016-03-263:05:12 PM | 40.212 | 99.612 | 71.712 | 38.638 |
| 2016-03-263:05:17 PM | 40.212 | 99.5 | 71.712 | 38.638 |
| 2016-03-263:05:21 PM | 40.212 | 99.275 | 71.6 | 38.638 |
| 2016-03-263:05:25 PM | 40.1 | 99.163 | 71.6 | 38.638 |
| 2016-03-263:05:29 PM | 40.1 | 99.05 | 71.6 | 38.638 |
| 2016-03-263:05:33 PM | 40.1 | 98.825 | 71.6 | 38.638 |
| 2016-03-263:05:37 PM | 39.988 | 98.6 | 71.6 | 38.638 |
| 2016-03-263:05:41 PM | 39.988 | 98.488 | 71.6 | 38.75 |
| 2016-03-263:05:45 PM | 39.988 | 98.262 | 71.6 | 38.638 |
| 2016-03-263:05:49 PM | 39.988 | 98.15 | 71.6 | 38.638 |
| 2016-03-263:05:53 PM | 39.875 | 97.925 | 71.6 | 38.638 |
| 2016-03-263:05:57 PM | 39.875 | 97.812 | 71.6 | 38.75 |
| 2016-03-263:06:01 PM | 39.875 | 97.7 | 71.6 | 38.75 |
| 2016-03-263:06:05 PM | 39.875 | 97.475 | 71.6 | 38.638 |
| 2016-03-263:06:09 PM | 39.762 | 97.362 | 71.6 | 38.75 |
| 2016-03-263:06:13 PM | 39.762 | 97.25 | 71.6 | 38.75 |
| 2016-03-263:06:18 PM | 39.762 | 97.025 | 71.6 | 38.75 |
| 2016-03-263:06:22 PM | 39.762 | 96.913 | 71.488 | 38.75 |
| 2016-03-263:06:26 PM | 39.65 | 96.8 | 71.6 | 38.75 |
| 2016-03-263:06:30 PM | 39.762 | 96.575 | 71.6 | 38.75 |
| 2016-03-263:06:34 PM | 39.65 | 96.462 | 71.488 | 38.75 |
| 2016-03-263:06:38 PM | 39.65 | 96.35 | 71.488 | 38.75 |
| 2016-03-263:06:42 PM | 39.65 | 96.125 | 71.488 | 38.75 |
| 2016-03-263:06:46 PM | 39.65 | 96.012 | 71.488 | 38.638 |
| 2016-03-263:06:50 PM | 39.65 | 95.9 | 71.488 | 38.75 |
| 2016-03-263:06:54 PM | 39.65 | 95.788 | 71.6 | 38.75 |
| 2016-03-263:06:58 PM | 39.65 | 95.675 | 71.488 | 38.75 |
| 2016-03-263:07:02 PM | 39.538 | 95.45 | 71.488 | 38.75 |
| 2016-03-263:07:06 PM | 39.65 | 95.338 | 71.488 | 38.75 |
| 2016-03-263:07:10 PM | 39.538 | 95.225 | 71.488 | 38.75 |
| 2016-03-263:07:14 PM | 39.65 | 95.112 | 71.488 | 38.75 |
| 2016-03-263:07:19 PM | 39.538 | 95 | 71.488 | 38.75 |
| 2016-03-263:07:23 PM | 39.538 | 94.888 | 71.488 | 38.862 |
| 2016-03-263:07:27 PM | 39.538 | 94.775 | 71.488 | 38.862 |
| 2016-03-263:07:31 PM | 39.538 | 94.663 | 71.488 | 38.975 |
| 2016-03-263:07:35 PM | 39.538 | 94.55 | 71.488 | 38.862 |
| 2016-03-263:07:39 PM | 39.538 | 94.438 | 71.488 | 38.975 |
| 2016-03-263:07:43 PM | 39.538 | 94.325 | 71.488 | 38.975 |
| 2016-03-263:07:47 PM | 39.538 | 94.212 | 71.488 | 38.975 |
| 2016-03-263:07:51 PM | 39.538 | 94.1 | 71.488 | 38.975 |
| 2016-03-263:07:55 PM | 39.538 | 93.988 | 71.488 | 38.975 |
| 2016-03-263:07:59 PM | 39.538 | 93.875 | 71.488 | 38.975 |
| 2016-03-263:08:03 PM | 39.538 | 93.762 | 71.488 | 38.975 |
| 2016-03-263:08:07 PM | 39.538 | 93.65 | 71.488 | 38.975 |
| 2016-03-263:08:11 PM | 39.538 | 93.65 | 71.488 | 38.975 |
| 2016-03-263:08:15 PM | 39.425 | 93.538 | 71.488 | 38.975 |
| 2016-03-263:08:20 PM | 39.538 | 93.425 | 71.488 | 38.975 |
| 2016-03-263:08:24 PM | 39.538 | 93.312 | 71.488 | 38.975 |
| 2016-03-263:08:28 PM | 39.538 | 93.312 | 71.488 | 39.088 |
| 2016-03-263:08:32 PM | 39.538 | 93.2 | 71.488 | 38.975 |
| 2016-03-263:08:36 PM | 39.538 | 93.088 | 71.375 | 39.088 |
| 2016-03-263:08:40 PM | 39.538 | 92.975 | 71.375 | 39.088 |
| 2016-03-263:08:44 PM | 39.538 | 92.975 | 71.375 | 39.088 |
| 2016-03-263:08:48 PM | 39.538 | 92.862 | 71.375 | 39.2 |
| 2016-03-263:08:52 PM | 39.538 | 92.75 | 71.375 | 39.2 |
| 2016-03-263:08:56 PM | 39.538 | 92.75 | 71.375 | 39.2 |
| 2016-03-263:09:00 PM | 39.538 | 92.638 | 71.375 | 39.312 |
| 2016-03-263:09:04 PM | 39.538 | 92.638 | 71.375 | 39.2 |
| 2016-03-263:09:08 PM | 39.538 | 92.525 | 71.375 | 39.2 |
| 2016-03-263:09:12 PM | 39.538 | 92.525 | 71.375 | 39.312 |
| 2016-03-263:09:16 PM | 39.65 | 92.413 | 71.375 | 39.312 |
| 2016-03-263:09:21 PM | 39.65 | 92.413 | 71.375 | 39.312 |
| 2016-03-263:09:25 PM | 39.65 | 92.413 | 71.375 | 39.312 |
| 2016-03-263:09:29 PM | 39.65 | 92.3 | 71.375 | 39.2 |
| 2016-03-263:09:33 PM | 39.762 | 92.3 | 71.375 | 39.2 |
| 2016-03-263:09:37 PM | 39.65 | 92.3 | 71.375 | 39.2 |
| 2016-03-263:09:41 PM | 39.762 | 92.3 | 71.375 | 39.2 |
| 2016-03-263:09:45 PM | 39.762 | 92.3 | 71.375 | 39.088 |
| 2016-03-263:09:49 PM | 39.762 | 92.3 | 71.375 | 39.088 |
| 2016-03-263:09:53 PM | 39.762 | 92.3 | 71.262 | 39.088 |
| 2016-03-263:09:57 PM | 39.875 | 92.3 | 71.262 | 39.088 |
| 2016-03-263:10:01 PM | 39.875 | 92.3 | 71.375 | 39.088 |
| 2016-03-263:10:05 PM | 39.875 | 92.3 | 71.262 | 39.2 |
| 2016-03-263:10:09 PM | 39.988 | 92.188 | 71.375 | 39.2 |
| 2016-03-263:10:13 PM | 39.988 | 92.188 | 71.262 | 39.2 |
| 2016-03-263:10:17 PM | 39.988 | 92.188 | 71.375 | 39.312 |
| 2016-03-263:10:21 PM | 39.988 | 92.188 | 71.375 | 39.425 |
| 2016-03-263:10:26 PM | 40.1 | 92.188 | 71.262 | 39.65 |
| 2016-03-263:10:30 PM | 40.1 | 92.188 | 71.375 | 39.762 |
| 2016-03-263:10:34 PM | 40.1 | 92.188 | 71.375 | 39.988 |
| 2016-03-263:10:38 PM | 40.1 | 92.3 | 71.375 | 40.212 |
| 2016-03-263:10:42 PM | 40.212 | 92.3 | 71.262 | 40.325 |
| 2016-03-263:10:46 PM | 40.212 | 92.525 | 71.262 | 40.438 |
| 2016-03-263:10:50 PM | 40.325 | 92.638 | 71.262 | 40.55 |
| 2016-03-263:10:54 PM | 40.325 | 92.862 | 71.262 | 40.662 |
| 2016-03-263:10:58 PM | 40.55 | 93.2 | 71.262 | 40.662 |
| 2016-03-263:11:02 PM | 40.775 | 93.65 | 71.262 | 40.775 |
| 2016-03-263:11:06 PM | 40.888 | 93.988 | 71.262 | 40.775 |
| 2016-03-263:11:10 PM | 41.112 | 94.325 | 71.262 | 40.888 |
| 2016-03-263:11:14 PM | 41.338 | 94.663 | 71.375 | 40.888 |
| 2016-03-263:11:18 PM | 41.45 | 94.888 | 71.262 | 41 |
| 2016-03-263:11:22 PM | 41.562 | 95.225 | 71.262 | 41 |
| 2016-03-263:11:27 PM | 41.675 | 95.562 | 71.375 | 41.112 |
| 2016-03-263:11:31 PM | 41.788 | 95.9 | 71.375 | 41.112 |
| 2016-03-263:11:35 PM | 41.9 | 96.125 | 71.375 | 41.112 |
| 2016-03-263:11:39 PM | 42.012 | 96.462 | 71.375 | 41.112 |
| 2016-03-263:11:43 PM | 42.125 | 96.688 | 71.262 | 41.112 |
| 2016-03-263:11:47 PM | 42.238 | 96.913 | 71.262 | 41.112 |
| 2016-03-263:11:51 PM | 42.238 | 97.138 | 71.262 | 41.112 |
| 2016-03-263:11:55 PM | 42.35 | 97.362 | 71.375 | 41 |
| 2016-03-263:11:59 PM | 42.35 | 97.475 | 71.375 | 41 |
| 2016-03-263:12:03 PM | 42.462 | 97.588 | 71.262 | 41 |
| 2016-03-263:12:07 PM | 42.462 | 97.7 | 71.262 | 41 |
| 2016-03-263:12:11 PM | 42.462 | 97.812 | 71.375 | 40.888 |
| 2016-03-263:12:15 PM | 42.462 | 97.812 | 71.375 | 40.775 |
| 2016-03-263:12:19 PM | 42.462 | 97.925 | 71.375 | 40.775 |
| 2016-03-263:12:23 PM | 42.462 | 97.925 | 71.375 | 40.662 |
| 2016-03-263:12:28 PM | 42.462 | 98.038 | 71.375 | 40.662 |
| 2016-03-263:12:32 PM | 42.462 | 98.038 | 71.262 | 40.662 |
| 2016-03-263:12:36 PM | 42.35 | 98.038 | 71.262 | 40.55 |
| 2016-03-263:12:40 PM | 42.35 | 98.038 | 71.262 | 40.438 |
| 2016-03-263:12:44 PM | 42.35 | 98.038 | 71.375 | 40.325 |
| 2016-03-263:12:48 PM | 42.35 | 97.925 | 71.375 | 40.212 |
| 2016-03-263:12:52 PM | 42.238 | 98.038 | 71.375 | 40.212 |
| 2016-03-263:12:56 PM | 42.238 | 97.925 | 71.262 | 40.1 |
| 2016-03-263:13:00 PM | 42.125 | 97.925 | 71.262 | 39.988 |
| 2016-03-263:13:04 PM | 42.238 | 97.925 | 71.262 | 39.988 |
| 2016-03-263:13:08 PM | 42.012 | 97.812 | 71.262 | 39.875 |
| 2016-03-263:13:12 PM | 42.012 | 97.812 | 71.262 | 39.875 |
| 2016-03-263:13:16 PM | 42.012 | 97.7 | 71.262 | 39.875 |
| 2016-03-263:13:20 PM | 41.9 | 97.7 | 71.262 | 39.875 |
| 2016-03-263:13:24 PM | 41.788 | 97.7 | 71.262 | 40.1 |
| 2016-03-263:13:29 PM | 41.788 | 97.7 | 71.375 | 40.1 |
| 2016-03-263:13:33 PM | 41.788 | 97.588 | 71.262 | 40.325 |
| 2016-03-263:13:37 PM | 41.675 | 97.588 | 71.262 | 40.55 |
| 2016-03-263:13:41 PM | 41.562 | 97.7 | 71.262 | 40.662 |
| 2016-03-263:13:45 PM | 41.562 | 97.812 | 71.262 | 40.662 |
| 2016-03-263:13:49 PM | 41.562 | 97.925 | 71.262 | 40.55 |
| 2016-03-263:13:53 PM | 41.562 | 98.15 | 71.262 | 40.55 |
| 2016-03-263:13:57 PM | 41.675 | 98.488 | 71.262 | 40.55 |
| 2016-03-263:14:01 PM | 41.788 | 98.712 | 71.262 | 40.55 |
| 2016-03-263:14:05 PM | 41.9 | 99.05 | 71.262 | 40.438 |
| 2016-03-263:14:09 PM | 42.012 | 99.5 | 71.262 | 40.55 |
| 2016-03-263:14:13 PM | 42.238 | 99.838 | 71.262 | 40.662 |
| 2016-03-263:14:17 PM | 42.35 | 100.288 | 71.262 | 40.775 |
| 2016-03-263:14:21 PM | 42.575 | 100.738 | 71.262 | 40.888 |
| 2016-03-263:14:26 PM | 42.8 | 101.188 | 71.262 | 41.225 |
| 2016-03-263:14:30 PM | 43.025 | 101.75 | 71.375 | 41.338 |
| 2016-03-263:14:34 PM | 43.25 | 102.312 | 71.262 | 41.45 |
| 2016-03-263:14:38 PM | 43.362 | 102.762 | 71.262 | 41.562 |
| 2016-03-263:14:42 PM | 43.588 | 103.325 | 71.375 | 41.675 |
| 2016-03-263:14:46 PM | 43.812 | 103.888 | 71.375 | 41.675 |
| 2016-03-263:14:50 PM | 44.038 | 104.45 | 71.375 | 41.675 |
| 2016-03-263:14:54 PM | 44.262 | 105.012 | 71.375 | 41.788 |
| 2016-03-263:14:58 PM | 44.488 | 105.575 | 71.375 | 42.012 |
| 2016-03-263:15:02 PM | 44.6 | 106.138 | 71.375 | 42.125 |
| 2016-03-263:15:06 PM | 44.825 | 106.7 | 71.375 | 42.012 |
| 2016-03-263:15:10 PM | 44.938 | 107.262 | 71.375 | 42.125 |
| 2016-03-263:15:14 PM | 45.05 | 107.825 | 71.375 | 42.012 |
| 2016-03-263:15:18 PM | 45.162 | 108.388 | 71.375 | 42.012 |
| 2016-03-263:15:22 PM | 45.275 | 108.95 | 71.375 | 42.012 |
| 2016-03-263:15:27 PM | 45.388 | 109.512 | 71.488 | 42.012 |
| 2016-03-263:15:31 PM | 45.5 | 109.85 | 71.375 | 42.012 |
| 2016-03-263:15:35 PM | 45.5 | 110.3 | 71.375 | 41.9 |
| 2016-03-263:15:39 PM | 45.612 | 110.638 | 71.375 | 42.012 |
| 2016-03-263:15:43 PM | 45.725 | 110.862 | 71.375 | 42.012 |
| 2016-03-263:15:47 PM | 45.725 | 111.088 | 71.375 | 41.9 |
| 2016-03-263:15:51 PM | 45.612 | 111.312 | 71.375 | 42.012 |
| 2016-03-263:15:55 PM | 45.612 | 111.538 | 71.375 | 42.012 |
| 2016-03-263:15:59 PM | 45.612 | 111.65 | 71.375 | 42.012 |
| 2016-03-263:16:03 PM | 45.612 | 111.762 | 71.375 | 42.012 |
| 2016-03-263:16:07 PM | 45.612 | 111.875 | 71.375 | 42.012 |
| 2016-03-263:16:11 PM | 45.612 | 111.988 | 71.375 | 41.9 |
| 2016-03-263:16:15 PM | 45.612 | 112.1 | 71.375 | 41.788 |
| 2016-03-263:16:19 PM | 45.5 | 112.212 | 71.375 | 41.562 |
| 2016-03-263:16:23 PM | 45.5 | 112.325 | 71.375 | 41.562 |
| 2016-03-263:16:28 PM | 45.5 | 112.325 | 71.375 | 41.562 |
| 2016-03-263:16:32 PM | 45.388 | 112.438 | 71.375 | 41.45 |
| 2016-03-263:16:36 PM | 45.388 | 112.438 | 71.375 | 41.45 |
| 2016-03-263:16:40 PM | 45.388 | 112.438 | 71.375 | 41.45 |
| 2016-03-263:16:44 PM | 45.275 | 112.438 | 71.375 | 41.338 |
| 2016-03-263:16:48 PM | 45.275 | 112.438 | 71.375 | 41.338 |
| 2016-03-263:16:52 PM | 45.162 | 112.325 | 71.375 | 41.338 |
| 2016-03-263:16:56 PM | 45.05 | 112.325 | 71.375 | 41.338 |
| 2016-03-263:17:00 PM | 44.938 | 112.212 | 71.375 | 41.338 |
| 2016-03-263:17:04 PM | 44.938 | 112.1 | 71.375 | 41.338 |
| 2016-03-263:17:08 PM | 44.825 | 112.1 | 71.375 | 41.338 |
| 2016-03-263:17:12 PM | 44.712 | 111.988 | 71.375 | 41.225 |
| 2016-03-263:17:16 PM | 44.6 | 111.875 | 71.375 | 41.112 |
| 2016-03-263:17:20 PM | 44.488 | 111.762 | 71.375 | 41 |
| 2016-03-263:17:24 PM | 44.375 | 111.65 | 71.375 | 40.888 |
| 2016-03-263:17:29 PM | 44.375 | 111.538 | 71.375 | 40.775 |
| 2016-03-263:17:33 PM | 44.262 | 111.425 | 71.375 | 40.662 |
| 2016-03-263:17:37 PM | 44.262 | 111.312 | 71.375 | 40.662 |
| 2016-03-263:17:41 PM | 44.262 | 111.2 | 71.375 | 40.438 |
| 2016-03-263:17:45 PM | 44.15 | 110.975 | 71.375 | 40.438 |
| 2016-03-263:17:49 PM | 44.15 | 110.862 | 71.375 | 40.212 |
| 2016-03-263:17:53 PM | 44.038 | 110.638 | 71.375 | 40.1 |
| 2016-03-263:17:57 PM | 44.038 | 110.525 | 71.375 | 39.988 |
| 2016-03-263:18:01 PM | 43.925 | 110.3 | 71.375 | 39.988 |
| 2016-03-263:18:05 PM | 43.925 | 110.075 | 71.375 | 39.988 |
| 2016-03-263:18:09 PM | 43.812 | 109.962 | 71.375 | 39.875 |
| 2016-03-263:18:13 PM | 43.7 | 109.738 | 71.375 | 39.762 |
| 2016-03-263:18:17 PM | 43.588 | 109.4 | 71.375 | 39.65 |
| 2016-03-263:18:21 PM | 43.588 | 109.288 | 71.375 | 39.65 |
| 2016-03-263:18:25 PM | 43.475 | 109.062 | 71.375 | 39.65 |
| 2016-03-263:18:30 PM | 43.362 | 108.838 | 71.375 | 39.65 |
| 2016-03-263:18:34 PM | 43.25 | 108.612 | 71.375 | 39.65 |
| 2016-03-263:18:38 PM | 43.25 | 108.388 | 71.375 | 39.65 |
| 2016-03-263:18:42 PM | 43.138 | 108.163 | 71.375 | 39.65 |
| 2016-03-263:18:46 PM | 43.025 | 107.938 | 71.375 | 39.65 |
| 2016-03-263:18:50 PM | 42.912 | 107.712 | 71.375 | 39.65 |
| 2016-03-263:18:54 PM | 42.912 | 107.488 | 71.375 | 39.65 |
| 2016-03-263:18:58 PM | 42.8 | 107.262 | 71.375 | 39.65 |
| 2016-03-263:19:02 PM | 42.8 | 106.925 | 71.262 | 39.538 |
| 2016-03-263:19:06 PM | 42.688 | 106.7 | 71.375 | 39.538 |
| 2016-03-263:19:10 PM | 42.688 | 106.475 | 71.375 | 39.538 |
| 2016-03-263:19:14 PM | 42.575 | 106.25 | 71.262 | 39.538 |
| 2016-03-263:19:18 PM | 42.575 | 106.025 | 71.375 | 39.425 |
| 2016-03-263:19:23 PM | 42.462 | 105.8 | 71.262 | 39.425 |
| 2016-03-263:19:27 PM | 42.462 | 105.575 | 71.262 | 39.312 |
| 2016-03-263:19:31 PM | 42.462 | 105.35 | 71.262 | 39.425 |
| 2016-03-263:19:35 PM | 42.35 | 105.125 | 71.262 | 39.312 |
| 2016-03-263:19:39 PM | 42.35 | 104.9 | 71.262 | 39.425 |
| 2016-03-263:19:43 PM | 42.238 | 104.675 | 71.262 | 39.425 |
| 2016-03-263:19:47 PM | 42.238 | 104.45 | 71.262 | 39.312 |
| 2016-03-263:19:51 PM | 42.238 | 104.225 | 71.262 | 39.425 |
| 2016-03-263:19:55 PM | 42.238 | 104 | 71.262 | 39.425 |
| 2016-03-263:19:59 PM | 42.125 | 103.888 | 71.262 | 39.312 |
| 2016-03-263:20:03 PM | 42.125 | 103.55 | 71.262 | 39.312 |
| 2016-03-263:20:07 PM | 42.125 | 103.438 | 71.262 | 39.312 |
| 2016-03-263:20:11 PM | 42.012 | 103.212 | 71.262 | 39.312 |
| 2016-03-263:20:15 PM | 42.012 | 102.988 | 71.262 | 39.312 |
| 2016-03-263:20:19 PM | 42.012 | 102.762 | 71.262 | 39.312 |
| 2016-03-263:20:23 PM | 41.9 | 102.538 | 71.262 | 39.2 |
| 2016-03-263:20:28 PM | 41.9 | 102.425 | 71.262 | 39.088 |
| 2016-03-263:20:32 PM | 41.9 | 102.2 | 71.262 | 39.088 |
| 2016-03-263:20:36 PM | 41.788 | 101.975 | 71.262 | 38.975 |
| 2016-03-263:20:40 PM | 41.9 | 101.862 | 71.262 | 39.088 |
| 2016-03-263:20:44 PM | 41.788 | 101.638 | 71.262 | 39.088 |
| 2016-03-263:20:48 PM | 41.788 | 101.413 | 71.262 | 39.088 |
| 2016-03-263:20:52 PM | 41.788 | 101.188 | 71.262 | 39.2 |
| 2016-03-263:20:56 PM | 41.675 | 101.075 | 71.262 | 39.312 |
| 2016-03-263:21:00 PM | 41.675 | 100.85 | 71.375 | 39.312 |
| 2016-03-263:21:04 PM | 41.675 | 100.738 | 71.262 | 39.425 |
| 2016-03-263:21:08 PM | 41.675 | 100.512 | 71.262 | 39.425 |
| 2016-03-263:21:12 PM | 41.562 | 100.4 | 71.262 | 39.538 |
| 2016-03-263:21:16 PM | 41.562 | 100.288 | 71.262 | 39.538 |
| 2016-03-263:21:20 PM | 41.562 | 100.175 | 71.262 | 39.538 |
| 2016-03-263:21:24 PM | 41.562 | 99.95 | 71.262 | 39.538 |
| 2016-03-263:21:29 PM | 41.562 | 99.838 | 71.262 | 39.538 |
| 2016-03-263:21:33 PM | 41.562 | 99.838 | 71.262 | 39.538 |
| 2016-03-263:21:37 PM | 41.562 | 99.725 | 71.262 | 39.538 |
| 2016-03-263:21:41 PM | 41.562 | 99.612 | 71.262 | 39.538 |
| 2016-03-263:21:45 PM | 41.562 | 99.5 | 71.262 | 39.425 |
| 2016-03-263:21:49 PM | 41.675 | 99.388 | 71.262 | 39.312 |
| 2016-03-263:21:53 PM | 41.675 | 99.275 | 71.262 | 39.312 |
| 2016-03-263:21:57 PM | 41.562 | 99.275 | 71.262 | 39.312 |
| 2016-03-263:22:01 PM | 41.562 | 99.05 | 71.262 | 39.2 |
| 2016-03-263:22:05 PM | 41.562 | 98.938 | 71.375 | 39.2 |
| 2016-03-263:22:09 PM | 41.675 | 98.825 | 71.262 | 39.2 |
| 2016-03-263:22:13 PM | 41.675 | 98.712 | 71.262 | 39.088 |
| 2016-03-263:22:17 PM | 41.562 | 98.6 | 71.262 | 39.088 |
| 2016-03-263:22:21 PM | 41.562 | 98.488 | 71.262 | 39.088 |
| 2016-03-263:22:25 PM | 41.562 | 98.262 | 71.262 | 39.088 |
| 2016-03-263:22:30 PM | 41.562 | 98.15 | 71.262 | 39.088 |
| 2016-03-263:22:34 PM | 41.562 | 98.038 | 71.262 | 38.975 |
| 2016-03-263:22:38 PM | 41.45 | 97.925 | 71.262 | 38.975 |
| 2016-03-263:22:42 PM | 41.45 | 97.7 | 71.262 | 38.975 |
| 2016-03-263:22:46 PM | 41.45 | 97.588 | 71.262 | 38.862 |
| 2016-03-263:22:50 PM | 41.338 | 97.475 | 71.262 | 38.975 |
| 2016-03-263:22:54 PM | 41.338 | 97.25 | 71.262 | 38.862 |
| 2016-03-263:22:58 PM | 41.338 | 97.138 | 71.262 | 38.862 |
| 2016-03-263:23:02 PM | 41.225 | 97.025 | 71.262 | 38.862 |
| 2016-03-263:23:06 PM | 41.225 | 96.8 | 71.262 | 38.862 |
| 2016-03-263:23:10 PM | 41.225 | 96.688 | 71.262 | 38.862 |
| 2016-03-263:23:14 PM | 41.112 | 96.462 | 71.262 | 38.862 |
| 2016-03-263:23:18 PM | 41.112 | 96.238 | 71.262 | 38.75 |
| 2016-03-263:23:22 PM | 41.112 | 96.125 | 71.262 | 38.75 |
| 2016-03-263:23:27 PM | 41 | 95.9 | 71.262 | 38.75 |
| 2016-03-263:23:31 PM | 41 | 95.788 | 71.262 | 38.638 |
| 2016-03-263:23:35 PM | 41 | 95.562 | 71.15 | 38.638 |
| 2016-03-263:23:39 PM | 40.888 | 95.45 | 71.262 | 38.525 |
| 2016-03-263:23:43 PM | 40.888 | 95.225 | 71.262 | 38.525 |
| 2016-03-263:23:47 PM | 40.775 | 95.112 | 71.262 | 38.412 |
| 2016-03-263:23:51 PM | 40.775 | 94.888 | 71.262 | 38.412 |
| 2016-03-263:23:55 PM | 40.775 | 94.775 | 71.262 | 38.412 |
| 2016-03-263:23:59 PM | 40.662 | 94.55 | 71.262 | 38.3 |
| 2016-03-263:24:03 PM | 40.662 | 94.438 | 71.262 | 38.3 |
| 2016-03-263:24:07 PM | 40.662 | 94.325 | 71.15 | 38.412 |
| 2016-03-263:24:11 PM | 40.55 | 94.1 | 71.15 | 38.412 |
| 2016-03-263:24:15 PM | 40.55 | 93.988 | 71.15 | 38.525 |
| 2016-03-263:24:19 PM | 40.55 | 93.762 | 71.15 | 38.638 |
| 2016-03-263:24:23 PM | 40.55 | 93.65 | 71.15 | 38.75 |
| 2016-03-263:24:28 PM | 40.438 | 93.538 | 71.15 | 38.862 |
| 2016-03-263:24:32 PM | 40.438 | 93.538 | 71.15 | 38.975 |
| 2016-03-263:24:36 PM | 40.438 | 93.538 | 71.15 | 39.088 |
| 2016-03-263:24:40 PM | 40.438 | 93.538 | 71.15 | 39.2 |
| 2016-03-263:24:44 PM | 40.55 | 93.65 | 71.15 | 39.425 |
| 2016-03-263:24:48 PM | 40.55 | 93.762 | 71.15 | 39.538 |
| 2016-03-263:24:52 PM | 40.662 | 93.988 | 71.15 | 39.65 |
| 2016-03-263:24:56 PM | 40.775 | 94.212 | 71.038 | 39.762 |
| 2016-03-263:25:00 PM | 40.888 | 94.438 | 71.15 | 39.875 |
| 2016-03-263:25:04 PM | 41 | 94.775 | 71.15 | 39.875 |
| 2016-03-263:25:08 PM | 41.225 | 95.112 | 71.15 | 40.1 |
| 2016-03-263:25:12 PM | 41.338 | 95.45 | 71.15 | 40.1 |
| 2016-03-263:25:16 PM | 41.45 | 95.788 | 71.15 | 40.212 |
| 2016-03-263:25:20 PM | 41.675 | 96.238 | 71.15 | 40.325 |
| 2016-03-263:25:24 PM | 41.9 | 96.688 | 71.15 | 40.438 |
| 2016-03-263:25:29 PM | 42.012 | 97.025 | 71.15 | 40.55 |
| 2016-03-263:25:33 PM | 42.238 | 97.475 | 71.15 | 40.775 |
| 2016-03-263:25:37 PM | 42.35 | 97.925 | 71.038 | 40.888 |
| 2016-03-263:25:41 PM | 42.575 | 98.375 | 71.15 | 41.112 |
| 2016-03-263:25:45 PM | 42.688 | 98.825 | 71.15 | 41.225 |
| 2016-03-263:25:49 PM | 42.912 | 99.275 | 71.15 | 41.338 |
| 2016-03-263:25:53 PM | 43.138 | 99.838 | 71.15 | 41.45 |
| 2016-03-263:25:57 PM | 43.362 | 100.288 | 71.15 | 41.562 |
| 2016-03-263:26:01 PM | 43.475 | 100.738 | 71.15 | 41.788 |
| 2016-03-263:26:05 PM | 43.7 | 101.3 | 71.15 | 41.9 |
| 2016-03-263:26:09 PM | 43.812 | 101.75 | 71.15 | 42.012 |
| 2016-03-263:26:13 PM | 43.925 | 102.312 | 71.15 | 42.125 |
| 2016-03-263:26:17 PM | 44.15 | 102.762 | 71.15 | 42.238 |
| 2016-03-263:26:21 PM | 44.375 | 103.212 | 71.15 | 42.35 |
| 2016-03-263:26:25 PM | 44.488 | 103.775 | 71.15 | 42.462 |
| 2016-03-263:26:30 PM | 44.712 | 104.225 | 71.15 | 42.462 |
| 2016-03-263:26:34 PM | 44.825 | 104.675 | 71.15 | 42.688 |
| 2016-03-263:26:38 PM | 45.05 | 105.238 | 71.15 | 42.688 |
| 2016-03-263:26:42 PM | 45.275 | 105.688 | 71.15 | 42.912 |
| 2016-03-263:26:46 PM | 45.388 | 106.138 | 71.15 | 43.025 |
| 2016-03-263:26:50 PM | 45.5 | 106.7 | 71.15 | 43.138 |
| 2016-03-263:26:54 PM | 45.612 | 107.15 | 71.15 | 43.25 |
| 2016-03-263:26:58 PM | 45.838 | 107.712 | 71.15 | 43.25 |
| 2016-03-263:27:02 PM | 46.062 | 108.163 | 71.15 | 43.25 |
| 2016-03-263:27:06 PM | 46.175 | 108.612 | 71.15 | 43.362 |
| 2016-03-263:27:10 PM | 46.288 | 109.062 | 71.15 | 43.475 |
| 2016-03-263:27:14 PM | 46.512 | 109.625 | 71.15 | 43.588 |
| 2016-03-263:27:18 PM | 46.625 | 110.075 | 71.262 | 43.7 |
| 2016-03-263:27:22 PM | 46.738 | 110.525 | 71.15 | 43.925 |
| 2016-03-263:27:26 PM | 46.85 | 111.088 | 71.262 | 43.925 |
| 2016-03-263:27:31 PM | 47.075 | 111.538 | 71.262 | 44.15 |
| 2016-03-263:27:35 PM | 47.075 | 111.988 | 71.15 | 44.262 |
| 2016-03-263:27:39 PM | 47.3 | 112.438 | 71.15 | 44.375 |
| 2016-03-263:27:43 PM | 47.412 | 112.888 | 71.15 | 44.375 |
| 2016-03-263:27:47 PM | 47.525 | 113.338 | 71.262 | 44.375 |
| 2016-03-263:27:51 PM | 47.638 | 113.788 | 71.262 | 44.488 |
| 2016-03-263:27:55 PM | 47.75 | 114.35 | 71.262 | 44.488 |
| 2016-03-263:27:59 PM | 47.862 | 114.688 | 71.262 | 44.488 |
| 2016-03-263:28:03 PM | 47.975 | 115.25 | 71.262 | 44.488 |
| 2016-03-263:28:07 PM | 48.088 | 115.7 | 71.262 | 44.488 |
| 2016-03-263:28:11 PM | 48.2 | 116.15 | 71.262 | 44.375 |
| 2016-03-263:28:15 PM | 48.312 | 116.6 | 71.262 | 44.375 |
| 2016-03-263:28:19 PM | 48.425 | 117.05 | 71.262 | 44.375 |
| 2016-03-263:28:23 PM | 48.65 | 117.5 | 71.262 | 44.262 |
| 2016-03-263:28:27 PM | 48.65 | 117.95 | 71.262 | 44.262 |
| 2016-03-263:28:32 PM | 48.762 | 118.4 | 71.262 | 44.375 |
| 2016-03-263:28:36 PM | 48.875 | 118.85 | 71.262 | 44.375 |
| 2016-03-263:28:40 PM | 48.988 | 119.188 | 71.262 | 44.375 |
| 2016-03-263:28:44 PM | 48.988 | 119.525 | 71.262 | 44.262 |
| 2016-03-263:28:48 PM | 49.1 | 119.862 | 71.262 | 44.262 |
| 2016-03-263:28:52 PM | 49.212 | 120.2 | 71.262 | 44.375 |
| 2016-03-263:28:56 PM | 49.212 | 120.538 | 71.262 | 44.375 |
| 2016-03-263:29:00 PM | 49.325 | 120.875 | 71.262 | 44.488 |
| 2016-03-263:29:04 PM | 49.325 | 121.212 | 71.262 | 44.488 |
| 2016-03-263:29:08 PM | 49.438 | 121.55 | 71.262 | 44.6 |
| 2016-03-263:29:12 PM | 49.438 | 121.775 | 71.375 | 44.6 |
| 2016-03-263:29:16 PM | 49.438 | 122.112 | 71.375 | 44.6 |
| 2016-03-263:29:20 PM | 49.55 | 122.45 | 71.375 | 44.6 |
| 2016-03-263:29:24 PM | 49.55 | 122.675 | 71.375 | 44.6 |
| 2016-03-263:29:28 PM | 49.55 | 123.012 | 71.375 | 44.488 |
| 2016-03-263:29:33 PM | 49.662 | 123.35 | 71.375 | 44.375 |
| 2016-03-263:29:37 PM | 49.662 | 123.575 | 71.375 | 44.262 |
| 2016-03-263:29:41 PM | 49.662 | 123.913 | 71.375 | 44.15 |
| 2016-03-263:29:45 PM | 49.662 | 124.025 | 71.375 | 43.925 |
| 2016-03-263:29:49 PM | 49.775 | 124.25 | 71.375 | 43.7 |
| 2016-03-263:29:53 PM | 49.775 | 124.362 | 71.375 | 43.475 |
| 2016-03-263:29:57 PM | 49.775 | 124.588 | 71.375 | 43.25 |
| 2016-03-263:30:01 PM | 49.55 | 124.7 | 71.375 | 43.138 |
| 2016-03-263:30:05 PM | 49.55 | 124.925 | 71.375 | 43.025 |
| 2016-03-263:30:09 PM | 49.438 | 125.038 | 71.375 | 42.912 |
| 2016-03-263:30:13 PM | 49.438 | 125.15 | 71.375 | 42.912 |
| 2016-03-263:30:17 PM | 49.325 | 125.262 | 71.375 | 42.8 |
| 2016-03-263:30:21 PM | 49.212 | 125.262 | 71.375 | 42.688 |
| 2016-03-263:30:25 PM | 49.212 | 125.375 | 71.375 | 42.575 |
| 2016-03-263:30:29 PM | 49.1 | 125.375 | 71.375 | 42.575 |
| 2016-03-263:30:34 PM | 48.875 | 125.488 | 71.375 | 42.462 |
| 2016-03-263:30:38 PM | 48.875 | 125.6 | 71.375 | 42.462 |
| 2016-03-263:30:42 PM | 48.762 | 125.712 | 71.375 | 42.575 |
| 2016-03-263:30:46 PM | 48.762 | 125.712 | 71.262 | 42.462 |
| 2016-03-263:30:50 PM | 48.762 | 125.712 | 71.262 | 42.462 |
| 2016-03-263:30:54 PM | 48.762 | 125.825 | 71.375 | 42.462 |
| 2016-03-263:30:58 PM | 48.762 | 125.712 | 71.375 | 42.462 |
| 2016-03-263:31:02 PM | 48.65 | 125.712 | 71.375 | 42.35 |
| 2016-03-263:31:06 PM | 48.538 | 125.712 | 71.375 | 42.238 |
| 2016-03-263:31:10 PM | 48.538 | 125.6 | 71.375 | 42.125 |
| 2016-03-263:31:14 PM | 48.425 | 125.488 | 71.375 | 42.012 |
| 2016-03-263:31:18 PM | 48.425 | 125.375 | 71.375 | 42.012 |
| 2016-03-263:31:22 PM | 48.312 | 125.262 | 71.375 | 41.9 |
| 2016-03-263:31:26 PM | 48.312 | 125.15 | 71.375 | 41.788 |
| 2016-03-263:31:31 PM | 48.2 | 125.038 | 71.375 | 41.675 |
| 2016-03-263:31:35 PM | 48.088 | 124.812 | 71.375 | 41.675 |
| 2016-03-263:31:39 PM | 47.862 | 124.7 | 71.375 | 41.675 |
| 2016-03-263:31:43 PM | 47.862 | 124.588 | 71.375 | 41.675 |
| 2016-03-263:31:47 PM | 47.75 | 124.362 | 71.375 | 41.45 |
| 2016-03-263:31:51 PM | 47.638 | 124.138 | 71.375 | 41.225 |
| 2016-03-263:31:55 PM | 47.525 | 123.913 | 71.375 | 41.112 |
| 2016-03-263:31:59 PM | 47.412 | 123.8 | 71.375 | 40.888 |
| 2016-03-263:32:03 PM | 47.412 | 123.462 | 71.375 | 40.775 |
| 2016-03-263:32:07 PM | 47.3 | 123.238 | 71.375 | 40.55 |
| 2016-03-263:32:11 PM | 47.188 | 123.012 | 71.375 | 40.438 |
| 2016-03-263:32:15 PM | 47.075 | 122.788 | 71.375 | 40.325 |
| 2016-03-263:32:19 PM | 46.962 | 122.562 | 71.375 | 40.325 |
| 2016-03-263:32:23 PM | 46.85 | 122.338 | 71.375 | 40.325 |
| 2016-03-263:32:27 PM | 46.625 | 122.112 | 71.375 | 40.212 |
| 2016-03-263:32:32 PM | 46.512 | 121.888 | 71.375 | 40.1 |
| 2016-03-263:32:36 PM | 46.288 | 121.663 | 71.375 | 40.212 |
| 2016-03-263:32:40 PM | 46.175 | 121.55 | 71.375 | 40.1 |
| 2016-03-263:32:44 PM | 46.062 | 121.438 | 71.375 | 40.212 |
| 2016-03-263:32:48 PM | 46.062 | 121.325 | 71.375 | 40.1 |
| 2016-03-263:32:52 PM | 46.062 | 121.1 | 71.375 | 40.212 |
| 2016-03-263:32:56 PM | 46.062 | 120.988 | 71.375 | 40.325 |
| 2016-03-263:33:00 PM | 46.062 | 120.988 | 71.375 | 40.325 |
| 2016-03-263:33:04 PM | 46.062 | 120.988 | 71.375 | 40.438 |
| 2016-03-263:33:08 PM | 46.175 | 121.1 | 71.375 | 40.55 |
| 2016-03-263:33:12 PM | 46.288 | 121.1 | 71.375 | 40.55 |
| 2016-03-263:33:16 PM | 46.4 | 121.212 | 71.375 | 40.662 |
| 2016-03-263:33:20 PM | 46.512 | 121.325 | 71.375 | 40.662 |
| 2016-03-263:33:24 PM | 46.625 | 121.55 | 71.375 | 40.775 |
| 2016-03-263:33:28 PM | 46.738 | 121.775 | 71.375 | 40.888 |
| 2016-03-263:33:33 PM | 46.85 | 121.888 | 71.375 | 40.888 |
| 2016-03-263:33:37 PM | 46.962 | 122.225 | 71.375 | 41.112 |
| 2016-03-263:33:41 PM | 47.188 | 122.45 | 71.375 | 41.225 |
| 2016-03-263:33:45 PM | 47.3 | 122.788 | 71.375 | 41.45 |
| 2016-03-263:33:49 PM | 47.525 | 123.125 | 71.488 | 41.562 |
| 2016-03-263:33:53 PM | 47.638 | 123.462 | 71.375 | 41.675 |
| 2016-03-263:33:57 PM | 47.75 | 123.8 | 71.375 | 41.788 |
| 2016-03-263:34:01 PM | 47.862 | 124.138 | 71.375 | 42.012 |
| 2016-03-263:34:05 PM | 47.862 | 124.475 | 71.488 | 42.125 |
| 2016-03-263:34:09 PM | 47.975 | 124.925 | 71.488 | 42.238 |
| 2016-03-263:34:13 PM | 48.2 | 125.262 | 71.375 | 42.35 |
| 2016-03-263:34:17 PM | 48.312 | 125.6 | 71.488 | 42.462 |
| 2016-03-263:34:21 PM | 48.312 | 125.938 | 71.375 | 42.575 |
| 2016-03-263:34:25 PM | 48.425 | 126.163 | 71.488 | 42.688 |
| 2016-03-263:34:29 PM | 48.538 | 126.5 | 71.488 | 42.8 |
| 2016-03-263:34:34 PM | 48.538 | 126.838 | 71.488 | 42.912 |
| 2016-03-263:34:38 PM | 48.538 | 127.062 | 71.488 | 43.138 |
| 2016-03-263:34:42 PM | 48.65 | 127.4 | 71.488 | 43.25 |
| 2016-03-263:34:46 PM | 48.65 | 127.625 | 71.488 | 43.475 |
| 2016-03-263:34:50 PM | 48.762 | 127.962 | 71.488 | 43.588 |
| 2016-03-263:34:54 PM | 48.762 | 128.075 | 71.488 | 43.7 |
| 2016-03-263:34:58 PM | 48.875 | 128.412 | 71.488 | 43.925 |
| 2016-03-263:35:02 PM | 48.875 | 128.637 | 71.488 | 44.038 |
| 2016-03-263:35:06 PM | 48.875 | 128.975 | 71.488 | 44.15 |
| 2016-03-263:35:10 PM | 48.988 | 129.312 | 71.488 | 44.262 |
| 2016-03-263:35:14 PM | 49.1 | 129.538 | 71.488 | 44.375 |
| 2016-03-263:35:18 PM | 49.212 | 129.875 | 71.488 | 44.375 |
| 2016-03-263:35:22 PM | 49.438 | 130.212 | 71.488 | 44.375 |
| 2016-03-263:35:26 PM | 49.55 | 130.438 | 71.488 | 44.15 |
| 2016-03-263:35:30 PM | 49.662 | 130.775 | 71.488 | 43.925 |
| 2016-03-263:35:35 PM | 49.775 | 131.112 | 71.488 | 43.925 |
| 2016-03-263:35:39 PM | 49.888 | 131.338 | 71.488 | 43.812 |
| 2016-03-263:35:43 PM | 50 | 131.562 | 71.488 | 43.7 |
| 2016-03-263:35:47 PM | 50.112 | 131.788 | 71.488 | 43.475 |
| 2016-03-263:35:51 PM | 50.112 | 131.9 | 71.488 | 43.362 |
| 2016-03-263:35:55 PM | 50.112 | 132.012 | 71.488 | 43.25 |
| 2016-03-263:35:59 PM | 50.112 | 132.238 | 71.6 | 43.138 |
| 2016-03-263:36:03 PM | 50 | 132.35 | 71.488 | 43.138 |
| 2016-03-263:36:07 PM | 50 | 132.462 | 71.6 | 43.25 |
| 2016-03-263:36:11 PM | 50 | 132.462 | 71.488 | 43.25 |
| 2016-03-263:36:15 PM | 49.888 | 132.688 | 71.488 | 43.25 |
| 2016-03-263:36:19 PM | 49.888 | 132.688 | 71.488 | 43.362 |
| 2016-03-263:36:23 PM | 49.775 | 132.8 | 71.6 | 43.475 |
| 2016-03-263:36:27 PM | 49.775 | 132.912 | 71.488 | 43.588 |
| 2016-03-263:36:31 PM | 49.662 | 133.025 | 71.6 | 43.588 |
| 2016-03-263:36:35 PM | 49.662 | 133.138 | 71.488 | 43.7 |
| 2016-03-263:36:40 PM | 49.662 | 133.25 | 71.6 | 43.812 |
| 2016-03-263:36:44 PM | 49.55 | 133.25 | 71.6 | 43.925 |
| 2016-03-263:36:48 PM | 49.55 | 133.362 | 71.6 | 44.038 |
| 2016-03-263:36:52 PM | 49.55 | 133.475 | 71.6 | 44.15 |
| 2016-03-263:36:56 PM | 49.55 | 133.588 | 71.6 | 44.15 |
| 2016-03-263:37:00 PM | 49.55 | 133.7 | 71.6 | 44.262 |
| 2016-03-263:37:04 PM | 49.662 | 133.812 | 71.6 | 44.262 |
| 2016-03-263:37:08 PM | 49.775 | 134.038 | 71.6 | 44.488 |
| 2016-03-263:37:12 PM | 49.888 | 134.262 | 71.6 | 44.488 |
| 2016-03-263:37:16 PM | 50 | 134.488 | 71.6 | 44.6 |
| 2016-03-263:37:20 PM | 50 | 134.712 | 71.6 | 44.712 |
| 2016-03-263:37:24 PM | 50.112 | 134.825 | 71.6 | 44.712 |
| 2016-03-263:37:28 PM | 50.225 | 135.05 | 71.6 | 44.825 |
| 2016-03-263:37:32 PM | 50.338 | 135.275 | 71.6 | 44.712 |
| 2016-03-263:37:36 PM | 50.45 | 135.5 | 71.6 | 44.712 |
| 2016-03-263:37:41 PM | 50.45 | 135.725 | 71.6 | 44.712 |
| 2016-03-263:37:45 PM | 50.562 | 135.95 | 71.6 | 44.712 |
| 2016-03-263:37:49 PM | 50.675 | 136.175 | 71.6 | 44.712 |
| 2016-03-263:37:53 PM | 50.788 | 136.288 | 71.6 | 44.6 |
| 2016-03-263:37:57 PM | 50.788 | 136.4 | 71.6 | 44.6 |
| 2016-03-263:38:01 PM | 50.9 | 136.512 | 71.6 | 44.6 |
| 2016-03-263:38:05 PM | 50.9 | 136.625 | 71.712 | 44.6 |
| 2016-03-263:38:09 PM | 50.9 | 136.738 | 71.6 | 44.712 |
| 2016-03-263:38:13 PM | 50.9 | 136.85 | 71.6 | 44.6 |
| 2016-03-263:38:17 PM | 51.012 | 136.962 | 71.6 | 44.488 |
| 2016-03-263:38:21 PM | 51.012 | 136.962 | 71.6 | 44.488 |
| 2016-03-263:38:25 PM | 51.125 | 137.075 | 71.6 | 44.375 |
| 2016-03-263:38:29 PM | 51.125 | 137.075 | 71.712 | 44.375 |
| 2016-03-263:38:33 PM | 51.125 | 137.075 | 71.6 | 44.262 |
| 2016-03-263:38:37 PM | 51.125 | 137.188 | 71.712 | 44.262 |
| 2016-03-263:38:42 PM | 51.125 | 137.188 | 71.712 | 44.15 |
| 2016-03-263:38:46 PM | 51.238 | 137.188 | 71.712 | 44.038 |
| 2016-03-263:38:50 PM | 51.125 | 137.188 | 71.712 | 44.038 |
| 2016-03-263:38:54 PM | 51.125 | 137.188 | 71.6 | 44.038 |
| 2016-03-263:38:58 PM | 51.125 | 137.075 | 71.712 | 44.038 |
| 2016-03-263:39:02 PM | 51.125 | 137.075 | 71.712 | 43.925 |
| 2016-03-263:39:06 PM | 51.012 | 137.075 | 71.712 | 43.925 |
| 2016-03-263:39:10 PM | 51.012 | 137.075 | 71.712 | 43.925 |
| 2016-03-263:39:14 PM | 50.9 | 136.962 | 71.712 | 43.925 |
| 2016-03-263:39:18 PM | 50.9 | 136.85 | 71.712 | 43.812 |
| 2016-03-263:39:22 PM | 50.788 | 136.85 | 71.712 | 43.812 |
| 2016-03-263:39:26 PM | 50.788 | 136.738 | 71.712 | 43.7 |
| 2016-03-263:39:30 PM | 50.788 | 136.625 | 71.712 | 43.7 |
| 2016-03-263:39:34 PM | 50.788 | 136.512 | 71.712 | 43.7 |
| 2016-03-263:39:38 PM | 50.675 | 136.512 | 71.712 | 43.7 |
| 2016-03-263:39:43 PM | 50.675 | 136.288 | 71.712 | 43.812 |
| 2016-03-263:39:47 PM | 50.562 | 136.062 | 71.712 | 43.812 |
| 2016-03-263:39:51 PM | 50.562 | 135.95 | 71.712 | 43.812 |
| 2016-03-263:39:55 PM | 50.45 | 135.838 | 71.712 | 43.812 |
| 2016-03-263:39:59 PM | 50.338 | 135.725 | 71.712 | 43.812 |
| 2016-03-263:40:03 PM | 50.225 | 135.612 | 71.712 | 43.812 |
| 2016-03-263:40:07 PM | 50.112 | 135.388 | 71.712 | 43.812 |
| 2016-03-263:40:11 PM | 50.112 | 135.388 | 71.712 | 43.812 |
| 2016-03-263:40:15 PM | 50.112 | 135.275 | 71.712 | 43.812 |
| 2016-03-263:40:19 PM | 50.112 | 135.388 | 71.712 | 43.812 |
| 2016-03-263:40:23 PM | 50.112 | 135.388 | 71.712 | 43.925 |
| 2016-03-263:40:27 PM | 50.112 | 135.388 | 71.712 | 43.812 |
| 2016-03-263:40:31 PM | 50.225 | 135.5 | 71.712 | 43.925 |
| 2016-03-263:40:35 PM | 50.225 | 135.5 | 71.712 | 43.925 |
| 2016-03-263:40:39 PM | 50.338 | 135.612 | 71.712 | 43.812 |
| 2016-03-263:40:44 PM | 50.338 | 135.725 | 71.712 | 43.7 |
| 2016-03-263:40:48 PM | 50.338 | 135.725 | 71.712 | 43.475 |
| 2016-03-263:40:52 PM | 50.45 | 135.838 | 71.712 | 43.475 |
| 2016-03-263:40:56 PM | 50.45 | 135.95 | 71.712 | 43.362 |
| 2016-03-263:41:00 PM | 50.562 | 136.062 | 71.712 | 43.362 |
| 2016-03-263:41:04 PM | 50.562 | 136.175 | 71.712 | 43.138 |
| 2016-03-263:41:08 PM | 50.562 | 136.288 | 71.712 | 43.138 |
| 2016-03-263:41:12 PM | 50.562 | 136.288 | 71.712 | 43.138 |
| 2016-03-263:41:16 PM | 50.562 | 136.4 | 71.712 | 43.25 |
| 2016-03-263:41:20 PM | 50.675 | 136.625 | 71.712 | 43.25 |
| 2016-03-263:41:24 PM | 50.675 | 136.625 | 71.712 | 43.25 |
| 2016-03-263:41:28 PM | 50.788 | 136.738 | 71.712 | 43.362 |
| 2016-03-263:41:32 PM | 50.788 | 136.85 | 71.712 | 43.25 |
| 2016-03-263:41:36 PM | 50.9 | 136.85 | 71.712 | 43.25 |
| 2016-03-263:41:40 PM | 50.788 | 136.85 | 71.712 | 43.362 |
| 2016-03-263:41:44 PM | 50.9 | 136.962 | 71.712 | 43.362 |
| 2016-03-263:41:49 PM | 50.9 | 137.075 | 71.712 | 43.475 |
| 2016-03-263:41:53 PM | 50.9 | 137.188 | 71.712 | 43.588 |
| 2016-03-263:41:57 PM | 50.9 | 137.188 | 71.712 | 43.588 |
| 2016-03-263:42:01 PM | 51.012 | 137.3 | 71.712 | 43.588 |
| 2016-03-263:42:05 PM | 51.012 | 137.412 | 71.712 | 43.588 |
| 2016-03-263:42:09 PM | 51.012 | 137.525 | 71.712 | 43.588 |
| 2016-03-263:42:13 PM | 51.012 | 137.638 | 71.825 | 43.588 |
| 2016-03-263:42:17 PM | 51.012 | 137.75 | 71.825 | 43.475 |
| 2016-03-263:42:21 PM | 51.012 | 137.862 | 71.825 | 43.475 |
| 2016-03-263:42:25 PM | 51.125 | 137.975 | 71.825 | 43.362 |
| 2016-03-263:42:29 PM | 51.238 | 138.088 | 71.825 | 43.25 |
| 2016-03-263:42:33 PM | 51.238 | 138.2 | 71.825 | 43.138 |
| 2016-03-263:42:37 PM | 51.238 | 138.312 | 71.825 | 43.025 |
| 2016-03-263:42:41 PM | 51.238 | 138.312 | 71.825 | 42.912 |
| 2016-03-263:42:45 PM | 51.35 | 138.425 | 71.825 | 42.912 |
| 2016-03-263:42:50 PM | 51.35 | 138.425 | 71.825 | 42.688 |
| 2016-03-263:42:54 PM | 51.35 | 138.312 | 71.825 | 42.462 |
| 2016-03-263:42:58 PM | 51.35 | 138.312 | 71.825 | 42.35 |
| 2016-03-263:43:02 PM | 51.35 | 138.2 | 71.825 | 42.238 |
| 2016-03-263:43:06 PM | 51.35 | 137.975 | 71.825 | 42.125 |
| 2016-03-263:43:10 PM | 51.238 | 137.862 | 71.825 | 42.125 |
| 2016-03-263:43:14 PM | 51.238 | 137.525 | 71.825 | 42.125 |
| 2016-03-263:43:18 PM | 51.125 | 137.3 | 71.825 | 42.125 |
| 2016-03-263:43:22 PM | 51.012 | 137.075 | 71.825 | 42.125 |
| 2016-03-263:43:26 PM | 50.788 | 136.738 | 71.825 | 42.125 |
| 2016-03-263:43:30 PM | 50.675 | 136.512 | 71.825 | 42.125 |
| 2016-03-263:43:34 PM | 50.562 | 136.175 | 71.825 | 41.9 |
| 2016-03-263:43:38 PM | 50.45 | 135.95 | 71.825 | 41.675 |
| 2016-03-263:43:42 PM | 50.338 | 135.725 | 71.825 | 41.562 |
| 2016-03-263:43:46 PM | 50.225 | 135.5 | 71.712 | 41.338 |
| 2016-03-263:43:50 PM | 50.225 | 135.275 | 71.825 | 41.225 |
| 2016-03-263:43:54 PM | 50.112 | 135.05 | 71.825 | 40.888 |
| 2016-03-263:43:58 PM | 50 | 134.712 | 71.825 | 40.662 |
| 2016-03-263:44:02 PM | 50 | 134.6 | 71.825 | 40.55 |
| 2016-03-263:44:06 PM | 49.888 | 134.375 | 71.825 | 40.438 |
| 2016-03-263:44:10 PM | 49.775 | 134.15 | 71.712 | 40.325 |
| 2016-03-263:44:14 PM | 49.775 | 133.925 | 71.825 | 40.212 |
| 2016-03-263:44:18 PM | 49.662 | 133.7 | 71.825 | 40.212 |
| 2016-03-263:44:22 PM | 49.55 | 133.475 | 71.825 | 40.212 |
| 2016-03-263:44:26 PM | 49.438 | 133.25 | 71.825 | 40.325 |
| 2016-03-263:44:30 PM | 49.325 | 133.138 | 71.825 | 40.438 |
| 2016-03-263:44:34 PM | 49.212 | 132.912 | 71.825 | 40.438 |
| 2016-03-263:44:38 PM | 49.1 | 132.912 | 71.825 | 40.55 |
| 2016-03-263:44:42 PM | 48.988 | 132.8 | 71.825 | 40.55 |
| 2016-03-263:44:46 PM | 48.875 | 132.8 | 71.825 | 40.662 |
| 2016-03-263:44:50 PM | 48.762 | 132.688 | 71.825 | 40.775 |
| 2016-03-263:44:54 PM | 48.762 | 132.688 | 71.825 | 40.888 |
| 2016-03-263:44:59 PM | 48.65 | 132.575 | 71.712 | 40.888 |
| 2016-03-263:45:03 PM | 48.762 | 132.462 | 71.825 | 40.888 |
| 2016-03-263:45:07 PM | 48.762 | 132.462 | 71.712 | 41 |
| 2016-03-263:45:11 PM | 48.762 | 132.462 | 71.825 | 41.112 |
| 2016-03-263:45:15 PM | 48.762 | 132.462 | 71.712 | 41.338 |
| 2016-03-263:45:19 PM | 48.762 | 132.462 | 71.825 | 41.45 |
| 2016-03-263:45:23 PM | 48.762 | 132.575 | 71.825 | 41.45 |
| 2016-03-263:45:27 PM | 48.762 | 132.688 | 71.825 | 41.338 |
| 2016-03-263:45:31 PM | 48.875 | 132.8 | 71.825 | 41.225 |
| 2016-03-263:45:35 PM | 48.988 | 132.912 | 71.825 | 41 |
| 2016-03-263:45:39 PM | 48.988 | 133.025 | 71.712 | 40.888 |
| 2016-03-263:45:43 PM | 49.1 | 133.138 | 71.712 | 40.888 |
| 2016-03-263:45:47 PM | 49.212 | 133.25 | 71.825 | 40.775 |
| 2016-03-263:45:51 PM | 49.325 | 133.362 | 71.712 | 40.55 |
| 2016-03-263:45:55 PM | 49.325 | 133.362 | 71.825 | 40.55 |
| 2016-03-263:46:00 PM | 49.438 | 133.362 | 71.825 | 40.55 |
| 2016-03-263:46:04 PM | 49.438 | 133.25 | 71.825 | 40.55 |
| 2016-03-263:46:08 PM | 49.438 | 133.25 | 71.825 | 40.438 |
| 2016-03-263:46:12 PM | 49.438 | 133.138 | 71.825 | 40.55 |
| 2016-03-263:46:16 PM | 49.325 | 132.912 | 71.825 | 40.438 |
| 2016-03-263:46:20 PM | 49.325 | 132.688 | 71.825 | 40.438 |
| 2016-03-263:46:24 PM | 49.212 | 132.462 | 71.712 | 40.438 |
| 2016-03-263:46:28 PM | 49.212 | 132.238 | 71.825 | 40.325 |
| 2016-03-263:46:32 PM | 49.1 | 132.012 | 71.712 | 40.325 |
| 2016-03-263:46:36 PM | 48.988 | 131.675 | 71.825 | 40.325 |
| 2016-03-263:46:40 PM | 48.875 | 131.45 | 71.825 | 40.212 |
| 2016-03-263:46:44 PM | 48.762 | 131.112 | 71.712 | 40.1 |
| 2016-03-263:46:48 PM | 48.65 | 130.775 | 71.712 | 40.1 |
| 2016-03-263:46:52 PM | 48.538 | 130.438 | 71.825 | 40.1 |
| 2016-03-263:46:56 PM | 48.425 | 130.1 | 71.712 | 40.1 |
| 2016-03-263:47:01 PM | 48.312 | 129.65 | 71.712 | 39.988 |
| 2016-03-263:47:05 PM | 48.088 | 129.312 | 71.825 | 39.875 |
| 2016-03-263:47:09 PM | 48.088 | 128.975 | 71.712 | 39.875 |
| 2016-03-263:47:13 PM | 47.862 | 128.525 | 71.712 | 39.762 |
| 2016-03-263:47:17 PM | 47.75 | 128.188 | 71.712 | 39.65 |
| 2016-03-263:47:21 PM | 47.638 | 127.738 | 71.712 | 39.65 |
| 2016-03-263:47:25 PM | 47.525 | 127.4 | 71.825 | 39.538 |
| 2016-03-263:47:29 PM | 47.412 | 126.95 | 71.712 | 39.425 |
| 2016-03-263:47:33 PM | 47.3 | 126.5 | 71.712 | 39.312 |
| 2016-03-263:47:37 PM | 47.075 | 126.05 | 71.712 | 39.2 |
| 2016-03-263:47:41 PM | 46.962 | 125.6 | 71.712 | 39.2 |
| 2016-03-263:47:45 PM | 46.85 | 125.15 | 71.712 | 39.2 |
| 2016-03-263:47:49 PM | 46.738 | 124.812 | 71.712 | 39.088 |
| 2016-03-263:47:53 PM | 46.512 | 124.362 | 71.712 | 38.975 |
| 2016-03-263:47:57 PM | 46.512 | 123.913 | 71.712 | 38.975 |
| 2016-03-263:48:02 PM | 46.288 | 123.462 | 71.712 | 38.75 |
| 2016-03-263:48:06 PM | 46.175 | 123.012 | 71.712 | 38.638 |
| 2016-03-263:48:10 PM | 46.062 | 122.562 | 71.712 | 38.525 |
| 2016-03-263:48:14 PM | 45.838 | 122.225 | 71.712 | 38.525 |
| 2016-03-263:48:18 PM | 45.838 | 121.775 | 71.712 | 38.412 |
| 2016-03-263:48:22 PM | 45.725 | 121.325 | 71.712 | 38.412 |
| 2016-03-263:48:26 PM | 45.5 | 120.988 | 71.6 | 38.3 |
| 2016-03-263:48:30 PM | 45.388 | 120.538 | 71.712 | 38.3 |
| 2016-03-263:48:34 PM | 45.162 | 120.088 | 71.712 | 38.188 |
| 2016-03-263:48:38 PM | 45.05 | 119.638 | 71.6 | 38.188 |
| 2016-03-263:48:42 PM | 44.938 | 119.188 | 71.712 | 38.188 |
| 2016-03-263:48:46 PM | 44.712 | 118.85 | 71.712 | 38.075 |
| 2016-03-263:48:50 PM | 44.712 | 118.4 | 71.6 | 38.075 |
| 2016-03-263:48:55 PM | 44.6 | 118.062 | 71.6 | 38.075 |
| 2016-03-263:48:59 PM | 44.488 | 117.612 | 71.6 | 38.075 |
| 2016-03-263:49:03 PM | 44.375 | 117.163 | 71.6 | 38.188 |
| 2016-03-263:49:07 PM | 44.262 | 116.825 | 71.6 | 38.075 |
| 2016-03-263:49:11 PM | 44.15 | 116.488 | 71.6 | 38.075 |
| 2016-03-263:49:15 PM | 44.038 | 116.038 | 71.6 | 38.075 |
| 2016-03-263:49:19 PM | 44.038 | 115.588 | 71.6 | 38.075 |
| 2016-03-263:49:23 PM | 43.925 | 115.25 | 71.6 | 38.188 |
| 2016-03-263:49:27 PM | 43.812 | 114.913 | 71.6 | 38.188 |
| 2016-03-263:49:31 PM | 43.812 | 114.462 | 71.6 | 38.188 |
| 2016-03-263:49:35 PM | 43.7 | 114.125 | 71.6 | 38.3 |
| 2016-03-263:49:39 PM | 43.588 | 113.788 | 71.6 | 38.188 |
| 2016-03-263:49:43 PM | 43.588 | 113.45 | 71.6 | 38.3 |
| 2016-03-263:49:47 PM | 43.588 | 113 | 71.6 | 38.412 |
| 2016-03-263:49:51 PM | 43.588 | 112.775 | 71.6 | 38.3 |
| 2016-03-263:49:55 PM | 43.475 | 112.325 | 71.6 | 38.3 |
| 2016-03-263:49:59 PM | 43.475 | 112.1 | 71.6 | 38.412 |
| 2016-03-263:50:04 PM | 43.362 | 111.762 | 71.6 | 38.412 |
| 2016-03-263:50:08 PM | 43.362 | 111.425 | 71.6 | 38.412 |
| 2016-03-263:50:12 PM | 43.362 | 111.088 | 71.6 | 38.412 |
| 2016-03-263:50:16 PM | 43.25 | 110.75 | 71.6 | 38.412 |
| 2016-03-263:50:20 PM | 43.25 | 110.413 | 71.6 | 38.525 |
| 2016-03-263:50:24 PM | 43.25 | 110.075 | 71.6 | 38.525 |
| 2016-03-263:50:28 PM | 43.25 | 109.738 | 71.488 | 38.525 |
| 2016-03-263:50:32 PM | 43.138 | 109.4 | 71.6 | 38.525 |
| 2016-03-263:50:36 PM | 43.138 | 109.175 | 71.488 | 38.525 |
| 2016-03-263:50:40 PM | 43.138 | 108.838 | 71.488 | 38.525 |
| 2016-03-263:50:44 PM | 43.138 | 108.5 | 71.488 | 38.525 |
| 2016-03-263:50:48 PM | 43.138 | 108.163 | 71.488 | 38.525 |
| 2016-03-263:50:52 PM | 43.138 | 107.825 | 71.488 | 38.638 |
| 2016-03-263:50:56 PM | 43.025 | 107.6 | 71.488 | 38.638 |
| 2016-03-263:51:00 PM | 43.025 | 107.262 | 71.488 | 38.638 |
| 2016-03-263:51:04 PM | 42.912 | 107.038 | 71.488 | 38.75 |
| 2016-03-263:51:08 PM | 42.912 | 106.588 | 71.488 | 38.862 |
| 2016-03-263:51:12 PM | 42.912 | 106.362 | 71.488 | 38.975 |
| 2016-03-263:51:16 PM | 42.912 | 106.138 | 71.488 | 39.088 |
| 2016-03-263:51:20 PM | 42.912 | 105.8 | 71.488 | 39.2 |
| 2016-03-263:51:24 PM | 42.912 | 105.575 | 71.375 | 39.312 |
| 2016-03-263:51:29 PM | 42.8 | 105.35 | 71.488 | 39.538 |
| 2016-03-263:51:33 PM | 42.8 | 105.238 | 71.375 | 39.65 |
| 2016-03-263:51:37 PM | 42.8 | 105.012 | 71.488 | 39.762 |
| 2016-03-263:51:41 PM | 42.8 | 104.9 | 71.375 | 39.762 |
| 2016-03-263:51:45 PM | 42.8 | 104.9 | 71.375 | 39.875 |
| 2016-03-263:51:49 PM | 42.912 | 105.012 | 71.375 | 40.1 |
| 2016-03-263:51:53 PM | 43.025 | 105.012 | 71.375 | 40.1 |
| 2016-03-263:51:57 PM | 43.138 | 105.125 | 71.375 | 40.1 |
| 2016-03-263:52:01 PM | 43.25 | 105.125 | 71.375 | 40.1 |
| 2016-03-263:52:05 PM | 43.362 | 105.238 | 71.375 | 40.1 |
| 2016-03-263:52:09 PM | 43.588 | 105.462 | 71.375 | 40.1 |
| 2016-03-263:52:13 PM | 43.7 | 105.575 | 71.375 | 40.1 |
| 2016-03-263:52:17 PM | 43.812 | 105.8 | 71.375 | 40.1 |
| 2016-03-263:52:21 PM | 43.925 | 105.913 | 71.375 | 40.1 |
| 2016-03-263:52:25 PM | 44.15 | 105.913 | 71.375 | 40.1 |
| 2016-03-263:52:30 PM | 44.262 | 106.025 | 71.375 | 40.1 |
| 2016-03-263:52:34 PM | 44.262 | 106.025 | 71.375 | 40.1 |
| 2016-03-263:52:38 PM | 44.375 | 105.913 | 71.375 | 39.988 |
| 2016-03-263:52:42 PM | 44.375 | 105.913 | 71.375 | 39.988 |
| 2016-03-263:52:46 PM | 44.375 | 105.913 | 71.375 | 40.1 |
| 2016-03-263:52:50 PM | 44.375 | 105.8 | 71.375 | 40.1 |
| 2016-03-263:52:54 PM | 44.375 | 105.688 | 71.375 | 40.1 |
| 2016-03-263:52:58 PM | 44.375 | 105.462 | 71.375 | 39.988 |
| 2016-03-263:53:02 PM | 44.375 | 105.35 | 71.262 | 39.988 |
| 2016-03-263:53:06 PM | 44.262 | 105.238 | 71.375 | 39.988 |
| 2016-03-263:53:10 PM | 44.262 | 105.012 | 71.262 | 39.988 |
| 2016-03-263:53:14 PM | 44.15 | 104.788 | 71.375 | 39.875 |
| 2016-03-263:53:18 PM | 44.15 | 104.675 | 71.262 | 39.875 |
| 2016-03-263:53:22 PM | 44.038 | 104.45 | 71.262 | 39.762 |
| 2016-03-263:53:27 PM | 44.038 | 104.225 | 71.262 | 39.762 |
| 2016-03-263:53:31 PM | 43.925 | 104 | 71.262 | 39.65 |
| 2016-03-263:53:35 PM | 43.812 | 103.775 | 71.262 | 39.65 |
| 2016-03-263:53:39 PM | 43.812 | 103.55 | 71.262 | 39.538 |
| 2016-03-263:53:43 PM | 43.812 | 103.325 | 71.262 | 39.65 |
| 2016-03-263:53:47 PM | 43.7 | 103.1 | 71.262 | 39.65 |
| 2016-03-263:53:51 PM | 43.588 | 102.875 | 71.262 | 39.538 |
| 2016-03-263:53:55 PM | 43.588 | 102.65 | 71.262 | 39.65 |
| 2016-03-263:53:59 PM | 43.475 | 102.425 | 71.262 | 39.538 |
| 2016-03-263:54:03 PM | 43.475 | 102.312 | 71.262 | 39.538 |
| 2016-03-263:54:07 PM | 43.475 | 102.088 | 71.262 | 39.538 |
| 2016-03-263:54:11 PM | 43.362 | 101.975 | 71.262 | 39.538 |
| 2016-03-263:54:15 PM | 43.475 | 101.75 | 71.262 | 39.538 |
| 2016-03-263:54:19 PM | 43.362 | 101.525 | 71.262 | 39.425 |
| 2016-03-263:54:23 PM | 43.362 | 101.413 | 71.15 | 39.425 |
| 2016-03-263:54:28 PM | 43.362 | 101.188 | 71.15 | 39.425 |
| 2016-03-263:54:32 PM | 43.362 | 100.962 | 71.15 | 39.312 |
| 2016-03-263:54:36 PM | 43.25 | 100.738 | 71.15 | 39.312 |
| 2016-03-263:54:40 PM | 43.25 | 100.625 | 71.15 | 39.312 |
| 2016-03-263:54:44 PM | 43.138 | 100.4 | 71.15 | 39.312 |
| 2016-03-263:54:48 PM | 43.138 | 100.175 | 71.15 | 39.312 |
| 2016-03-263:54:52 PM | 43.025 | 99.838 | 71.15 | 39.312 |
| 2016-03-263:54:56 PM | 43.025 | 99.725 | 71.15 | 39.312 |
| 2016-03-263:55:00 PM | 43.025 | 99.388 | 71.15 | 39.312 |
| 2016-03-263:55:04 PM | 42.912 | 99.163 | 71.15 | 39.312 |
| 2016-03-263:55:08 PM | 42.912 | 99.05 | 71.15 | 39.312 |
| 2016-03-263:55:12 PM | 42.8 | 98.712 | 71.15 | 39.312 |
| 2016-03-263:55:16 PM | 42.8 | 98.488 | 71.15 | 39.312 |
| 2016-03-263:55:20 PM | 42.688 | 98.262 | 71.038 | 39.312 |
| 2016-03-263:55:25 PM | 42.688 | 98.038 | 71.038 | 39.2 |
| 2016-03-263:55:29 PM | 42.688 | 97.812 | 71.038 | 39.312 |
| 2016-03-263:55:33 PM | 42.575 | 97.588 | 71.038 | 39.2 |
| 2016-03-263:55:37 PM | 42.575 | 97.362 | 71.038 | 39.2 |
| 2016-03-263:55:41 PM | 42.462 | 97.138 | 71.038 | 39.2 |
| 2016-03-263:55:45 PM | 42.462 | 96.913 | 71.038 | 39.2 |
| 2016-03-263:55:49 PM | 42.35 | 96.688 | 71.038 | 39.312 |
| 2016-03-263:55:53 PM | 42.35 | 96.462 | 71.038 | 39.312 |
| 2016-03-263:55:57 PM | 42.238 | 96.238 | 71.038 | 39.2 |
| 2016-03-263:56:01 PM | 42.238 | 96.012 | 71.038 | 39.312 |
| 2016-03-263:56:05 PM | 42.238 | 95.788 | 71.038 | 39.312 |
| 2016-03-263:56:09 PM | 42.125 | 95.562 | 71.038 | 39.312 |
| 2016-03-263:56:13 PM | 42.125 | 95.338 | 71.038 | 39.2 |
| 2016-03-263:56:17 PM | 42.125 | 95.112 | 71.038 | 39.2 |
| 2016-03-263:56:21 PM | 42.012 | 95 | 70.925 | 39.2 |
| 2016-03-263:56:26 PM | 42.012 | 94.888 | 71.038 | 39.2 |
| 2016-03-263:56:30 PM | 42.012 | 94.663 | 70.925 | 39.088 |
| 2016-03-263:56:34 PM | 41.9 | 94.55 | 71.038 | 39.2 |
| 2016-03-263:56:38 PM | 42.012 | 94.325 | 70.925 | 39.088 |
| 2016-03-263:56:42 PM | 42.012 | 94.212 | 70.925 | 39.2 |
| 2016-03-263:56:46 PM | 41.9 | 94.1 | 70.925 | 39.2 |
| 2016-03-263:56:50 PM | 41.9 | 93.875 | 70.925 | 39.2 |
| 2016-03-263:56:54 PM | 41.9 | 93.762 | 70.925 | 39.2 |
| 2016-03-263:56:58 PM | 41.9 | 93.538 | 70.925 | 39.088 |
| 2016-03-263:57:02 PM | 41.788 | 93.312 | 70.925 | 39.2 |
| 2016-03-263:57:06 PM | 41.9 | 93.2 | 70.925 | 39.088 |
| 2016-03-263:57:10 PM | 41.9 | 92.975 | 70.925 | 39.2 |
| 2016-03-263:57:14 PM | 41.788 | 92.862 | 70.925 | 39.2 |
| 2016-03-263:57:18 PM | 41.788 | 92.638 | 70.925 | 39.088 |
| 2016-03-263:57:22 PM | 41.788 | 92.525 | 70.925 | 39.088 |
| 2016-03-263:57:27 PM | 41.675 | 92.3 | 70.925 | 39.088 |
| 2016-03-263:57:31 PM | 41.675 | 92.188 | 70.925 | 38.975 |
| 2016-03-263:57:35 PM | 41.675 | 91.962 | 70.925 | 38.975 |
| 2016-03-263:57:39 PM | 41.562 | 91.738 | 70.925 | 38.975 |
| 2016-03-263:57:43 PM | 41.562 | 91.625 | 70.925 | 38.862 |
| 2016-03-263:57:47 PM | 41.562 | 91.4 | 70.925 | 38.862 |
| 2016-03-263:57:51 PM | 41.562 | 91.288 | 70.925 | 38.75 |
| 2016-03-263:57:55 PM | 41.45 | 91.062 | 70.925 | 38.75 |
| 2016-03-263:57:59 PM | 41.562 | 90.95 | 70.812 | 38.75 |
| 2016-03-263:58:03 PM | 41.45 | 90.838 | 70.925 | 38.638 |
| 2016-03-263:58:07 PM | 41.45 | 90.612 | 70.812 | 38.638 |
| 2016-03-263:58:11 PM | 41.45 | 90.5 | 70.812 | 38.638 |
| 2016-03-263:58:15 PM | 41.45 | 90.275 | 70.812 | 38.638 |
| 2016-03-263:58:19 PM | 41.338 | 90.163 | 70.812 | 38.638 |
| 2016-03-263:58:24 PM | 41.338 | 90.05 | 70.812 | 38.75 |
| 2016-03-263:58:28 PM | 41.338 | 89.825 | 70.925 | 38.862 |
| 2016-03-263:58:32 PM | 41.338 | 89.712 | 70.812 | 38.975 |
| 2016-03-263:58:36 PM | 41.338 | 89.488 | 70.925 | 39.088 |
| 2016-03-263:58:40 PM | 41.338 | 89.375 | 70.812 | 39.2 |
| 2016-03-263:58:44 PM | 41.225 | 89.262 | 70.812 | 39.312 |
| 2016-03-263:58:48 PM | 41.225 | 89.262 | 70.812 | 39.538 |
| 2016-03-263:58:52 PM | 41.338 | 89.15 | 70.812 | 39.65 |
| 2016-03-263:58:56 PM | 41.225 | 89.262 | 70.812 | 39.762 |
| 2016-03-263:59:00 PM | 41.338 | 89.262 | 70.812 | 39.988 |
| 2016-03-263:59:04 PM | 41.45 | 89.375 | 70.812 | 40.1 |
| 2016-03-263:59:08 PM | 41.562 | 89.6 | 70.812 | 40.212 |
| 2016-03-263:59:12 PM | 41.675 | 89.712 | 70.812 | 40.325 |
| 2016-03-263:59:16 PM | 41.788 | 90.05 | 70.812 | 40.438 |
| 2016-03-263:59:20 PM | 42.012 | 90.275 | 70.812 | 40.55 |
| 2016-03-263:59:25 PM | 42.125 | 90.5 | 70.812 | 40.55 |
| 2016-03-263:59:29 PM | 42.35 | 90.838 | 70.812 | 40.55 |
| 2016-03-263:59:33 PM | 42.575 | 91.175 | 70.812 | 40.662 |
| 2016-03-263:59:37 PM | 42.688 | 91.4 | 70.812 | 40.662 |
| 2016-03-263:59:41 PM | 42.912 | 91.738 | 70.812 | 40.662 |
| 2016-03-263:59:45 PM | 43.025 | 91.962 | 70.7 | 40.662 |
| 2016-03-263:59:49 PM | 43.138 | 92.075 | 70.812 | 40.662 |
| 2016-03-263:59:53 PM | 43.25 | 92.3 | 70.812 | 40.662 |
| 2016-03-263:59:57 PM | 43.362 | 92.525 | 70.812 | 40.662 |
| 2016-03-264:00:01 PM | 43.588 | 92.75 | 70.7 | 40.775 |
| 2016-03-264:00:05 PM | 43.588 | 92.975 | 70.812 | 40.775 |
| 2016-03-264:00:09 PM | 43.7 | 93.088 | 70.7 | 40.662 |
| 2016-03-264:00:13 PM | 43.812 | 93.312 | 70.7 | 40.775 |
| 2016-03-264:00:17 PM | 43.925 | 93.538 | 70.7 | 40.775 |
| 2016-03-264:00:21 PM | 43.925 | 93.538 | 70.7 | 40.775 |
| 2016-03-264:00:26 PM | 44.038 | 93.65 | 70.812 | 40.775 |
| 2016-03-264:00:30 PM | 44.038 | 93.762 | 70.812 | 40.888 |
| 2016-03-264:00:34 PM | 44.038 | 93.875 | 70.7 | 40.888 |
| 2016-03-264:00:38 PM | 44.038 | 93.875 | 70.7 | 41 |
| 2016-03-264:00:42 PM | 44.038 | 93.988 | 70.7 | 41 |
| 2016-03-264:00:46 PM | 44.038 | 94.1 | 70.7 | 41 |
| 2016-03-264:00:50 PM | 44.15 | 94.325 | 70.7 | 41.112 |
| 2016-03-264:00:54 PM | 44.15 | 94.438 | 70.7 | 41.225 |
| 2016-03-264:00:58 PM | 44.262 | 94.55 | 70.7 | 41.225 |
| 2016-03-264:01:02 PM | 44.262 | 94.775 | 70.7 | 41.225 |
| 2016-03-264:01:06 PM | 44.375 | 95 | 70.7 | 41.338 |
| 2016-03-264:01:10 PM | 44.488 | 95.225 | 70.7 | 41.45 |
| 2016-03-264:01:14 PM | 44.6 | 95.45 | 70.7 | 41.45 |
| 2016-03-264:01:18 PM | 44.6 | 95.675 | 70.7 | 41.562 |
| 2016-03-264:01:22 PM | 44.712 | 96.012 | 70.7 | 41.675 |
| 2016-03-264:01:27 PM | 44.825 | 96.238 | 70.7 | 41.788 |
| 2016-03-264:01:31 PM | 44.938 | 96.575 | 70.7 | 41.788 |
| 2016-03-264:01:35 PM | 45.05 | 96.913 | 70.588 | 41.9 |
| 2016-03-264:01:39 PM | 45.162 | 97.25 | 70.7 | 41.9 |
| 2016-03-264:01:43 PM | 45.275 | 97.588 | 70.7 | 41.9 |
| 2016-03-264:01:47 PM | 45.388 | 97.925 | 70.7 | 42.012 |
| 2016-03-264:01:51 PM | 45.5 | 98.262 | 70.588 | 42.012 |
| 2016-03-264:01:55 PM | 45.612 | 98.6 | 70.7 | 42.012 |
| 2016-03-264:01:59 PM | 45.725 | 98.825 | 70.7 | 42.125 |
| 2016-03-264:02:03 PM | 45.95 | 99.163 | 70.588 | 42.238 |
| 2016-03-264:02:07 PM | 46.062 | 99.612 | 70.7 | 42.238 |
| 2016-03-264:02:11 PM | 46.062 | 99.95 | 70.588 | 42.35 |
| 2016-03-264:02:15 PM | 46.288 | 100.288 | 70.588 | 42.238 |
| 2016-03-264:02:19 PM | 46.4 | 100.625 | 70.588 | 42.238 |
| 2016-03-264:02:23 PM | 46.512 | 100.962 | 70.588 | 42.35 |
| 2016-03-264:02:28 PM | 46.738 | 101.3 | 70.7 | 42.462 |
| 2016-03-264:02:32 PM | 46.85 | 101.638 | 70.7 | 42.462 |
| 2016-03-264:02:36 PM | 47.075 | 101.975 | 70.7 | 42.575 |
| 2016-03-264:02:40 PM | 47.075 | 102.312 | 70.588 | 42.688 |
| 2016-03-264:02:44 PM | 47.188 | 102.65 | 70.7 | 42.688 |
| 2016-03-264:02:48 PM | 47.3 | 102.988 | 70.7 | 42.8 |
| 2016-03-264:02:52 PM | 47.525 | 103.212 | 70.7 | 42.912 |
| 2016-03-264:02:56 PM | 47.638 | 103.55 | 70.7 | 43.025 |
| 2016-03-264:03:00 PM | 47.75 | 103.888 | 70.7 | 43.025 |
| 2016-03-264:03:04 PM | 47.862 | 104.225 | 70.7 | 43.138 |
| 2016-03-264:03:08 PM | 47.975 | 104.562 | 70.588 | 43.138 |
| 2016-03-264:03:12 PM | 48.088 | 104.9 | 70.7 | 43.25 |
| 2016-03-264:03:16 PM | 48.088 | 105.238 | 70.7 | 43.138 |
| 2016-03-264:03:20 PM | 48.2 | 105.462 | 70.7 | 43.025 |
| 2016-03-264:03:25 PM | 48.2 | 105.8 | 70.7 | 42.8 |
| 2016-03-264:03:29 PM | 48.312 | 106.025 | 70.7 | 42.575 |
| 2016-03-264:03:33 PM | 48.312 | 106.362 | 70.588 | 42.35 |
| 2016-03-264:03:37 PM | 48.312 | 106.588 | 70.7 | 42.125 |
| 2016-03-264:03:41 PM | 48.312 | 106.812 | 70.588 | 42.012 |
| 2016-03-264:03:45 PM | 48.312 | 107.15 | 70.7 | 41.788 |
| 2016-03-264:03:49 PM | 48.425 | 107.375 | 70.7 | 41.675 |
| 2016-03-264:03:53 PM | 48.538 | 107.488 | 70.588 | 41.675 |
| 2016-03-264:03:57 PM | 48.538 | 107.712 | 70.7 | 41.675 |
| 2016-03-264:04:01 PM | 48.538 | 107.938 | 70.588 | 41.675 |
| 2016-03-264:04:05 PM | 48.65 | 108.05 | 70.7 | 41.562 |
| 2016-03-264:04:09 PM | 48.65 | 108.163 | 70.588 | 41.45 |
| 2016-03-264:04:13 PM | 48.65 | 108.275 | 70.7 | 41.225 |
| 2016-03-264:04:17 PM | 48.65 | 108.5 | 70.588 | 41.112 |
| 2016-03-264:04:21 PM | 48.65 | 108.612 | 70.588 | 41 |
| 2016-03-264:04:26 PM | 48.65 | 108.838 | 70.588 | 40.888 |
| 2016-03-264:04:30 PM | 48.65 | 108.95 | 70.588 | 40.662 |
| 2016-03-264:04:34 PM | 48.65 | 108.95 | 70.588 | 40.55 |
| 2016-03-264:04:38 PM | 48.65 | 109.062 | 70.588 | 40.438 |
| 2016-03-264:04:42 PM | 48.65 | 109.062 | 70.588 | 40.325 |
| 2016-03-264:04:46 PM | 48.65 | 109.062 | 70.588 | 40.325 |
| 2016-03-264:04:50 PM | 48.65 | 109.062 | 70.588 | 40.212 |
| 2016-03-264:04:54 PM | 48.538 | 109.062 | 70.588 | 40.212 |
| 2016-03-264:04:58 PM | 48.538 | 108.95 | 70.588 | 40.1 |
| 2016-03-264:05:02 PM | 48.538 | 108.95 | 70.588 | 40.1 |
| 2016-03-264:05:06 PM | 48.425 | 108.838 | 70.588 | 40.1 |
| 2016-03-264:05:10 PM | 48.425 | 108.725 | 70.588 | 39.988 |
| 2016-03-264:05:14 PM | 48.425 | 108.725 | 70.588 | 39.988 |
| 2016-03-264:05:18 PM | 48.425 | 108.725 | 70.588 | 39.875 |
| 2016-03-264:05:22 PM | 48.312 | 108.612 | 70.588 | 39.762 |
| 2016-03-264:05:27 PM | 48.312 | 108.612 | 70.588 | 39.65 |
| 2016-03-264:05:31 PM | 48.312 | 108.612 | 70.588 | 39.65 |
| 2016-03-264:05:35 PM | 48.312 | 108.5 | 70.588 | 39.538 |
| 2016-03-264:05:39 PM | 48.312 | 108.5 | 70.588 | 39.538 |
| 2016-03-264:05:43 PM | 48.2 | 108.275 | 70.588 | 39.425 |
| 2016-03-264:05:47 PM | 48.2 | 108.163 | 70.588 | 39.538 |
| 2016-03-264:05:51 PM | 48.088 | 107.938 | 70.588 | 39.425 |
| 2016-03-264:05:55 PM | 47.975 | 107.825 | 70.588 | 39.538 |
| 2016-03-264:05:59 PM | 47.862 | 107.6 | 70.588 | 39.538 |
| 2016-03-264:06:03 PM | 47.862 | 107.375 | 70.588 | 39.538 |
| 2016-03-264:06:07 PM | 47.862 | 107.15 | 70.475 | 39.538 |
| 2016-03-264:06:11 PM | 47.75 | 107.038 | 70.475 | 39.538 |
| 2016-03-264:06:15 PM | 47.638 | 106.7 | 70.475 | 39.538 |
| 2016-03-264:06:19 PM | 47.638 | 106.475 | 70.475 | 39.65 |
| 2016-03-264:06:23 PM | 47.525 | 106.25 | 70.475 | 39.65 |
| 2016-03-264:06:27 PM | 47.412 | 106.025 | 70.475 | 39.65 |
| 2016-03-264:06:32 PM | 47.3 | 105.8 | 70.475 | 39.65 |
| 2016-03-264:06:36 PM | 47.3 | 105.575 | 70.475 | 39.762 |
| 2016-03-264:06:40 PM | 47.075 | 105.238 | 70.475 | 39.875 |
| 2016-03-264:06:44 PM | 46.962 | 105.125 | 70.475 | 39.875 |
| 2016-03-264:06:48 PM | 46.85 | 104.9 | 70.475 | 39.988 |
| 2016-03-264:06:52 PM | 46.85 | 104.675 | 70.475 | 39.988 |
| 2016-03-264:06:56 PM | 46.738 | 104.562 | 70.475 | 40.1 |
| 2016-03-264:07:00 PM | 46.738 | 104.45 | 70.475 | 40.1 |
| 2016-03-264:07:04 PM | 46.625 | 104.338 | 70.475 | 40.1 |
| 2016-03-264:07:08 PM | 46.625 | 104.225 | 70.475 | 40.212 |
| 2016-03-264:07:12 PM | 46.625 | 104.112 | 70.475 | 40.325 |
| 2016-03-264:07:16 PM | 46.625 | 104 | 70.475 | 40.438 |
| 2016-03-264:07:20 PM | 46.625 | 104 | 70.475 | 40.55 |
| 2016-03-264:07:24 PM | 46.625 | 103.888 | 70.475 | 40.55 |
| 2016-03-264:07:29 PM | 46.625 | 103.775 | 70.475 | 40.775 |
| 2016-03-264:07:33 PM | 46.625 | 103.775 | 70.475 | 40.888 |
| 2016-03-264:07:37 PM | 46.625 | 103.663 | 70.362 | 41 |
| 2016-03-264:07:41 PM | 46.625 | 103.775 | 70.475 | 41 |
| 2016-03-264:07:45 PM | 46.625 | 103.775 | 70.475 | 41.112 |
| 2016-03-264:07:49 PM | 46.625 | 103.888 | 70.475 | 41.112 |
| 2016-03-264:07:53 PM | 46.738 | 104 | 70.475 | 41.225 |
| 2016-03-264:07:57 PM | 46.85 | 104.112 | 70.475 | 41.225 |
| 2016-03-264:08:01 PM | 46.962 | 104.338 | 70.362 | 41.338 |
| 2016-03-264:08:05 PM | 46.962 | 104.45 | 70.362 | 41.45 |
| 2016-03-264:08:09 PM | 47.075 | 104.675 | 70.475 | 41.45 |
| 2016-03-264:08:13 PM | 47.188 | 104.9 | 70.475 | 41.562 |
| 2016-03-264:08:17 PM | 47.188 | 105.125 | 70.475 | 41.675 |
| 2016-03-264:08:21 PM | 47.3 | 105.238 | 70.475 | 41.675 |
| 2016-03-264:08:25 PM | 47.3 | 105.575 | 70.362 | 41.788 |
| 2016-03-264:08:30 PM | 47.412 | 105.8 | 70.475 | 41.788 |
| 2016-03-264:08:34 PM | 47.525 | 105.913 | 70.475 | 41.788 |
| 2016-03-264:08:38 PM | 47.638 | 106.25 | 70.362 | 41.675 |
| 2016-03-264:08:42 PM | 47.862 | 106.475 | 70.475 | 41.788 |
| 2016-03-264:08:46 PM | 47.975 | 106.7 | 70.362 | 41.788 |
| 2016-03-264:08:50 PM | 48.088 | 106.925 | 70.362 | 41.675 |
| 2016-03-264:08:54 PM | 48.2 | 107.15 | 70.362 | 41.675 |
| 2016-03-264:08:58 PM | 48.312 | 107.488 | 70.362 | 41.675 |
| 2016-03-264:09:02 PM | 48.312 | 107.825 | 70.362 | 41.562 |
| 2016-03-264:09:06 PM | 48.425 | 108.05 | 70.475 | 41.562 |
| 2016-03-264:09:10 PM | 48.538 | 108.275 | 70.362 | 41.562 |
| 2016-03-264:09:14 PM | 48.538 | 108.612 | 70.362 | 41.45 |
| 2016-03-264:09:18 PM | 48.65 | 108.838 | 70.362 | 41.45 |
| 2016-03-264:09:22 PM | 48.762 | 109.062 | 70.362 | 41.45 |
| 2016-03-264:09:26 PM | 48.762 | 109.4 | 70.362 | 41.45 |
| 2016-03-264:09:31 PM | 48.875 | 109.625 | 70.362 | 41.45 |
| 2016-03-264:09:35 PM | 48.875 | 109.962 | 70.362 | 41.338 |
| 2016-03-264:09:39 PM | 48.988 | 110.188 | 70.362 | 41.338 |
| 2016-03-264:09:43 PM | 48.988 | 110.525 | 70.362 | 41.225 |
| 2016-03-264:09:47 PM | 49.1 | 110.75 | 70.362 | 41.225 |
| 2016-03-264:09:51 PM | 49.1 | 110.975 | 70.362 | 41.225 |
| 2016-03-264:09:55 PM | 49.212 | 111.2 | 70.362 | 41.225 |
| 2016-03-264:09:59 PM | 49.212 | 111.538 | 70.362 | 41.225 |
| 2016-03-264:10:03 PM | 49.212 | 111.762 | 70.362 | 41.112 |
| 2016-03-264:10:07 PM | 49.212 | 111.988 | 70.362 | 41.112 |
| 2016-03-264:10:11 PM | 49.212 | 112.325 | 70.362 | 41.225 |
| 2016-03-264:10:15 PM | 49.212 | 112.55 | 70.362 | 41.338 |
| 2016-03-264:10:19 PM | 49.1 | 112.775 | 70.362 | 41.45 |
| 2016-03-264:10:23 PM | 49.212 | 113 | 70.362 | 41.562 |
| 2016-03-264:10:27 PM | 49.325 | 113.225 | 70.362 | 41.675 |
| 2016-03-264:10:31 PM | 49.212 | 113.562 | 70.362 | 41.675 |
| 2016-03-264:10:36 PM | 49.212 | 113.675 | 70.362 | 41.675 |
| 2016-03-264:10:40 PM | 49.212 | 114.012 | 70.362 | 41.675 |
| 2016-03-264:10:44 PM | 49.325 | 114.125 | 70.475 | 41.675 |
| 2016-03-264:10:48 PM | 49.325 | 114.35 | 70.362 | 41.788 |
| 2016-03-264:10:52 PM | 49.325 | 114.575 | 70.362 | 41.788 |
| 2016-03-264:10:56 PM | 49.325 | 114.8 | 70.362 | 41.9 |
| 2016-03-264:11:00 PM | 49.438 | 115.025 | 70.362 | 41.9 |
| 2016-03-264:11:04 PM | 49.55 | 115.25 | 70.362 | 42.125 |
| 2016-03-264:11:08 PM | 49.55 | 115.475 | 70.362 | 42.125 |
| 2016-03-264:11:12 PM | 49.662 | 115.7 | 70.362 | 42.238 |
| 2016-03-264:11:16 PM | 49.662 | 115.812 | 70.475 | 42.35 |
| 2016-03-264:11:20 PM | 49.775 | 116.038 | 70.475 | 42.462 |
| 2016-03-264:11:24 PM | 49.775 | 116.262 | 70.362 | 42.462 |
| 2016-03-264:11:28 PM | 49.775 | 116.488 | 70.475 | 42.575 |
| 2016-03-264:11:33 PM | 49.775 | 116.6 | 70.475 | 42.575 |
| 2016-03-264:11:37 PM | 49.888 | 116.825 | 70.475 | 42.688 |
| 2016-03-264:11:41 PM | 50 | 117.05 | 70.362 | 42.688 |
| 2016-03-264:11:45 PM | 50 | 117.163 | 70.362 | 42.688 |
| 2016-03-264:11:49 PM | 50.112 | 117.388 | 70.362 | 42.688 |
| 2016-03-264:11:53 PM | 50.112 | 117.5 | 70.362 | 42.688 |
| 2016-03-264:11:57 PM | 50.225 | 117.725 | 70.362 | 42.8 |
| 2016-03-264:12:01 PM | 50.225 | 117.95 | 70.362 | 42.8 |
| 2016-03-264:12:05 PM | 50.338 | 118.062 | 70.362 | 42.8 |
| 2016-03-264:12:09 PM | 50.338 | 118.288 | 70.475 | 42.8 |
| 2016-03-264:12:13 PM | 50.45 | 118.4 | 70.362 | 42.8 |
| 2016-03-264:12:17 PM | 50.45 | 118.625 | 70.362 | 42.8 |
| 2016-03-264:12:21 PM | 50.562 | 118.738 | 70.362 | 42.8 |
| 2016-03-264:12:25 PM | 50.562 | 118.962 | 70.362 | 42.8 |
| 2016-03-264:12:29 PM | 50.562 | 119.075 | 70.362 | 42.8 |
| 2016-03-264:12:33 PM | 50.562 | 119.188 | 70.362 | 42.8 |
| 2016-03-264:12:38 PM | 50.675 | 119.3 | 70.475 | 42.8 |
| 2016-03-264:12:42 PM | 50.675 | 119.525 | 70.475 | 42.912 |
| 2016-03-264:12:46 PM | 50.675 | 119.525 | 70.362 | 42.8 |
| 2016-03-264:12:50 PM | 50.788 | 119.75 | 70.362 | 42.688 |
| 2016-03-264:12:54 PM | 50.9 | 119.75 | 70.475 | 42.688 |
| 2016-03-264:12:58 PM | 50.9 | 119.862 | 70.475 | 42.462 |
| 2016-03-264:13:02 PM | 51.012 | 119.975 | 70.475 | 42.462 |
| 2016-03-264:13:06 PM | 51.012 | 120.088 | 70.362 | 42.238 |
| 2016-03-264:13:10 PM | 51.012 | 120.088 | 70.362 | 42.125 |
| 2016-03-264:13:14 PM | 51.125 | 120.2 | 70.362 | 42.125 |
| 2016-03-264:13:18 PM | 51.012 | 120.2 | 70.475 | 42.125 |
| 2016-03-264:13:22 PM | 51.012 | 120.312 | 70.362 | 42.125 |
| 2016-03-264:13:26 PM | 51.012 | 120.2 | 70.475 | 42.125 |
| 2016-03-264:13:30 PM | 51.012 | 120.2 | 70.475 | 42.125 |
| 2016-03-264:13:34 PM | 51.012 | 120.2 | 70.475 | 42.012 |
| 2016-03-264:13:39 PM | 51.012 | 120.088 | 70.475 | 41.9 |
| 2016-03-264:13:43 PM | 51.012 | 120.088 | 70.475 | 41.9 |
| 2016-03-264:13:47 PM | 51.012 | 119.975 | 70.475 | 41.788 |
| 2016-03-264:13:51 PM | 50.9 | 119.975 | 70.475 | 41.788 |
| 2016-03-264:13:55 PM | 50.788 | 119.975 | 70.475 | 41.788 |
| 2016-03-264:13:59 PM | 50.788 | 119.975 | 70.475 | 41.788 |
| 2016-03-264:14:03 PM | 50.788 | 120.088 | 70.475 | 41.675 |
| 2016-03-264:14:07 PM | 50.675 | 120.088 | 70.362 | 41.675 |
| 2016-03-264:14:11 PM | 50.675 | 120.088 | 70.362 | 41.675 |
| 2016-03-264:14:15 PM | 50.675 | 120.2 | 70.475 | 41.562 |
| 2016-03-264:14:19 PM | 50.675 | 120.312 | 70.475 | 41.562 |
| 2016-03-264:14:23 PM | 50.562 | 120.312 | 70.475 | 41.562 |
| 2016-03-264:14:27 PM | 50.562 | 120.425 | 70.475 | 41.562 |
| 2016-03-264:14:31 PM | 50.562 | 120.425 | 70.475 | 41.562 |
| 2016-03-264:14:36 PM | 50.562 | 120.538 | 70.475 | 41.562 |
| 2016-03-264:14:40 PM | 50.562 | 120.538 | 70.475 | 41.562 |
| 2016-03-264:14:44 PM | 50.562 | 120.65 | 70.475 | 41.45 |
| 2016-03-264:14:48 PM | 50.562 | 120.762 | 70.475 | 41.45 |
| 2016-03-264:14:52 PM | 50.562 | 120.762 | 70.475 | 41.562 |
| 2016-03-264:14:56 PM | 50.562 | 120.875 | 70.475 | 41.562 |
| 2016-03-264:15:00 PM | 50.562 | 120.875 | 70.475 | 41.562 |
| 2016-03-264:15:04 PM | 50.562 | 120.988 | 70.475 | 41.45 |
| 2016-03-264:15:08 PM | 50.562 | 120.988 | 70.475 | 41.45 |
| 2016-03-264:15:12 PM | 50.45 | 121.1 | 70.588 | 41.45 |
| 2016-03-264:15:16 PM | 50.45 | 121.212 | 70.588 | 41.338 |
| 2016-03-264:15:20 PM | 50.338 | 121.212 | 70.475 | 41.225 |
| 2016-03-264:15:24 PM | 50.225 | 121.212 | 70.588 | 41.338 |
| 2016-03-264:15:28 PM | 50.225 | 121.325 | 70.475 | 41.338 |
| 2016-03-264:15:32 PM | 50.225 | 121.325 | 70.475 | 41.338 |
| 2016-03-264:15:37 PM | 50.225 | 121.438 | 70.588 | 41.45 |
| 2016-03-264:15:41 PM | 50.225 | 121.438 | 70.475 | 41.45 |
| 2016-03-264:15:45 PM | 50.225 | 121.55 | 70.588 | 41.45 |
| 2016-03-264:15:49 PM | 50.338 | 121.55 | 70.588 | 41.562 |
| 2016-03-264:15:53 PM | 50.338 | 121.55 | 70.588 | 41.562 |
| 2016-03-264:15:57 PM | 50.338 | 121.55 | 70.588 | 41.562 |
| 2016-03-264:16:01 PM | 50.338 | 121.55 | 70.588 | 41.562 |
| 2016-03-264:16:05 PM | 50.45 | 121.55 | 70.588 | 41.562 |
| 2016-03-264:16:09 PM | 50.45 | 121.55 | 70.588 | 41.562 |
| 2016-03-264:16:13 PM | 50.562 | 121.663 | 70.588 | 41.562 |
| 2016-03-264:16:17 PM | 50.562 | 121.663 | 70.588 | 41.562 |
| 2016-03-264:16:21 PM | 50.675 | 121.663 | 70.588 | 41.675 |
| 2016-03-264:16:25 PM | 50.675 | 121.775 | 70.588 | 41.562 |
| 2016-03-264:16:29 PM | 50.788 | 121.775 | 70.588 | 41.675 |
| 2016-03-264:16:33 PM | 50.788 | 121.775 | 70.588 | 41.562 |
| 2016-03-264:16:37 PM | 50.788 | 121.888 | 70.588 | 41.45 |
| 2016-03-264:16:42 PM | 50.9 | 121.888 | 70.588 | 41.338 |
| 2016-03-264:16:46 PM | 50.9 | 122 | 70.588 | 41.225 |
| 2016-03-264:16:50 PM | 51.012 | 122 | 70.588 | 41.225 |
| 2016-03-264:16:54 PM | 51.012 | 122 | 70.588 | 41.338 |
| 2016-03-264:16:58 PM | 51.012 | 122.112 | 70.588 | 41.338 |
| 2016-03-264:17:02 PM | 51.012 | 122.112 | 70.7 | 41.338 |
| 2016-03-264:17:06 PM | 51.125 | 122.112 | 70.7 | 41.45 |
| 2016-03-264:17:10 PM | 51.125 | 122.225 | 70.588 | 41.562 |
| 2016-03-264:17:14 PM | 51.125 | 122.338 | 70.7 | 41.562 |
| 2016-03-264:17:18 PM | 51.125 | 122.338 | 70.588 | 41.675 |
| 2016-03-264:17:22 PM | 51.125 | 122.45 | 70.7 | 41.675 |
| 2016-03-264:17:26 PM | 51.125 | 122.45 | 70.7 | 41.788 |
| 2016-03-264:17:30 PM | 51.238 | 122.45 | 70.588 | 41.788 |
| 2016-03-264:17:34 PM | 51.238 | 122.562 | 70.7 | 41.788 |
| 2016-03-264:17:38 PM | 51.35 | 122.562 | 70.7 | 41.788 |
| 2016-03-264:17:43 PM | 51.35 | 122.675 | 70.7 | 41.788 |
| 2016-03-264:17:47 PM | 51.462 | 122.675 | 70.7 | 41.788 |
| 2016-03-264:17:51 PM | 51.462 | 122.675 | 70.7 | 41.788 |
| 2016-03-264:17:55 PM | 51.462 | 122.788 | 70.7 | 41.9 |
| 2016-03-264:17:59 PM | 51.462 | 122.788 | 70.7 | 41.9 |
| 2016-03-264:18:03 PM | 51.575 | 122.788 | 70.7 | 41.9 |
| 2016-03-264:18:07 PM | 51.575 | 122.9 | 70.7 | 42.012 |
| 2016-03-264:18:11 PM | 51.575 | 122.9 | 70.7 | 42.012 |
| 2016-03-264:18:15 PM | 51.575 | 122.9 | 70.7 | 42.125 |
| 2016-03-264:18:19 PM | 51.575 | 123.012 | 70.7 | 42.238 |
| 2016-03-264:18:23 PM | 51.575 | 123.012 | 70.812 | 42.238 |
| 2016-03-264:18:27 PM | 51.575 | 123.012 | 70.7 | 42.238 |
| 2016-03-264:18:31 PM | 51.575 | 123.125 | 70.7 | 42.35 |
| 2016-03-264:18:35 PM | 51.575 | 123.125 | 70.7 | 42.35 |
| 2016-03-264:18:40 PM | 51.688 | 123.238 | 70.812 | 42.462 |
| 2016-03-264:18:44 PM | 51.688 | 123.238 | 70.7 | 42.575 |
| 2016-03-264:18:48 PM | 51.688 | 123.238 | 70.7 | 42.575 |
| 2016-03-264:18:52 PM | 51.8 | 123.35 | 70.7 | 42.688 |
| 2016-03-264:18:56 PM | 51.8 | 123.35 | 70.812 | 42.688 |
| 2016-03-264:19:00 PM | 51.8 | 123.35 | 70.812 | 42.688 |
| 2016-03-264:19:04 PM | 51.8 | 123.35 | 70.812 | 42.688 |
| 2016-03-264:19:08 PM | 51.912 | 123.35 | 70.812 | 42.688 |
| 2016-03-264:19:12 PM | 51.912 | 123.462 | 70.812 | 42.688 |
| 2016-03-264:19:16 PM | 52.025 | 123.462 | 70.812 | 42.575 |
| 2016-03-264:19:20 PM | 52.025 | 123.462 | 70.812 | 42.575 |
| 2016-03-264:19:24 PM | 52.025 | 123.575 | 70.812 | 42.462 |
| 2016-03-264:19:28 PM | 52.138 | 123.575 | 70.812 | 42.462 |
| 2016-03-264:19:32 PM | 52.025 | 123.688 | 70.812 | 42.35 |
| 2016-03-264:19:36 PM | 52.138 | 123.688 | 70.812 | 42.35 |
| 2016-03-264:19:40 PM | 52.138 | 123.688 | 70.812 | 42.238 |
| 2016-03-264:19:44 PM | 52.138 | 123.688 | 70.812 | 42.35 |
| 2016-03-264:19:48 PM | 52.138 | 123.8 | 70.812 | 42.35 |
| 2016-03-264:19:53 PM | 52.138 | 123.8 | 70.7 | 42.35 |
| 2016-03-264:19:57 PM | 52.138 | 123.8 | 70.812 | 42.35 |
| 2016-03-264:20:01 PM | 52.138 | 123.8 | 70.812 | 42.35 |
| 2016-03-264:20:05 PM | 52.138 | 123.913 | 70.7 | 42.462 |
| 2016-03-264:20:09 PM | 52.025 | 123.913 | 70.7 | 42.462 |
| 2016-03-264:20:13 PM | 52.138 | 123.913 | 70.7 | 42.462 |
| 2016-03-264:20:17 PM | 52.138 | 124.025 | 70.7 | 42.462 |
| 2016-03-264:20:21 PM | 52.138 | 124.025 | 70.7 | 42.462 |
| 2016-03-264:20:25 PM | 52.138 | 124.025 | 70.7 | 42.575 |
| 2016-03-264:20:29 PM | 52.138 | 124.025 | 70.7 | 42.575 |
| 2016-03-264:20:33 PM | 52.138 | 124.138 | 70.7 | 42.575 |
| 2016-03-264:20:37 PM | 52.25 | 124.138 | 70.7 | 42.575 |
| 2016-03-264:20:41 PM | 52.25 | 124.138 | 70.7 | 42.575 |
| 2016-03-264:20:45 PM | 52.25 | 124.138 | 70.7 | 42.688 |
| 2016-03-264:20:49 PM | 52.25 | 124.138 | 70.7 | 42.688 |
| 2016-03-264:20:54 PM | 52.362 | 124.138 | 70.7 | 42.8 |
| 2016-03-264:20:58 PM | 52.362 | 124.138 | 70.7 | 42.8 |
| 2016-03-264:21:02 PM | 52.362 | 124.138 | 70.7 | 42.8 |
| 2016-03-264:21:06 PM | 52.362 | 124.138 | 70.7 | 42.912 |
| 2016-03-264:21:10 PM | 52.362 | 124.138 | 70.7 | 43.025 |
| 2016-03-264:21:14 PM | 52.475 | 124.138 | 70.7 | 43.138 |
| 2016-03-264:21:18 PM | 52.475 | 124.138 | 70.7 | 43.138 |
| 2016-03-264:21:22 PM | 52.475 | 124.138 | 70.7 | 43.25 |
| 2016-03-264:21:26 PM | 52.588 | 124.138 | 70.7 | 43.25 |
| 2016-03-264:21:30 PM | 52.588 | 124.138 | 70.7 | 43.362 |
| 2016-03-264:21:34 PM | 52.588 | 124.138 | 70.7 | 43.25 |
| 2016-03-264:21:38 PM | 52.7 | 124.138 | 70.7 | 43.138 |
| 2016-03-264:21:42 PM | 52.7 | 124.25 | 70.7 | 43.138 |
| 2016-03-264:21:46 PM | 52.7 | 124.138 | 70.7 | 43.138 |
| 2016-03-264:21:51 PM | 52.7 | 124.138 | 70.7 | 43.025 |
| 2016-03-264:21:55 PM | 52.812 | 124.138 | 70.7 | 43.025 |
| 2016-03-264:21:59 PM | 52.812 | 124.138 | 70.7 | 43.138 |
| 2016-03-264:22:03 PM | 52.812 | 124.25 | 70.7 | 43.025 |
| 2016-03-264:22:07 PM | 52.925 | 124.138 | 70.7 | 43.025 |
| 2016-03-264:22:11 PM | 52.925 | 124.138 | 70.7 | 42.912 |
| 2016-03-264:22:15 PM | 52.925 | 124.25 | 70.7 | 43.025 |
| 2016-03-264:22:19 PM | 52.925 | 124.25 | 70.7 | 42.912 |
| 2016-03-264:22:23 PM | 52.925 | 124.25 | 70.7 | 42.912 |
| 2016-03-264:22:27 PM | 53.038 | 124.25 | 70.7 | 42.912 |
| 2016-03-264:22:31 PM | 53.038 | 124.25 | 70.7 | 42.912 |
| 2016-03-264:22:35 PM | 53.15 | 124.25 | 70.7 | 42.912 |
| 2016-03-264:22:39 PM | 53.15 | 124.25 | 70.7 | 42.912 |
| 2016-03-264:22:43 PM | 53.15 | 124.25 | 70.7 | 42.912 |
| 2016-03-264:22:48 PM | 53.15 | 124.25 | 70.7 | 43.025 |
| 2016-03-264:22:52 PM | 53.262 | 124.25 | 70.7 | 42.912 |
| 2016-03-264:22:56 PM | 53.262 | 124.138 | 70.7 | 42.912 |
| 2016-03-264:23:00 PM | 53.262 | 124.25 | 70.7 | 42.8 |
| 2016-03-264:23:04 PM | 53.375 | 124.138 | 70.7 | 42.688 |
| 2016-03-264:23:08 PM | 53.375 | 124.25 | 70.7 | 42.688 |
| 2016-03-264:23:12 PM | 53.375 | 124.138 | 70.7 | 42.575 |
| 2016-03-264:23:16 PM | 53.488 | 124.25 | 70.7 | 42.575 |
| 2016-03-264:23:20 PM | 53.488 | 124.25 | 70.7 | 42.575 |
| 2016-03-264:23:24 PM | 53.488 | 124.25 | 70.7 | 42.688 |
| 2016-03-264:23:28 PM | 53.488 | 124.25 | 70.7 | 42.688 |
| 2016-03-264:23:32 PM | 53.488 | 124.25 | 70.812 | 42.688 |
| 2016-03-264:23:36 PM | 53.488 | 124.25 | 70.7 | 42.8 |
| 2016-03-264:23:40 PM | 53.488 | 124.25 | 70.812 | 42.8 |
| 2016-03-264:23:44 PM | 53.488 | 124.25 | 70.7 | 42.8 |
| 2016-03-264:23:48 PM | 53.375 | 124.25 | 70.7 | 42.8 |
| 2016-03-264:23:52 PM | 53.375 | 124.25 | 70.7 | 42.8 |
| 2016-03-264:23:56 PM | 53.375 | 124.25 | 70.7 | 42.8 |
| 2016-03-264:24:00 PM | 53.488 | 124.25 | 70.7 | 42.688 |
| 2016-03-264:24:04 PM | 53.488 | 124.25 | 70.7 | 42.575 |
| 2016-03-264:24:08 PM | 53.488 | 124.25 | 70.7 | 42.575 |
| 2016-03-264:24:12 PM | 53.488 | 124.138 | 70.7 | 42.462 |
| 2016-03-264:24:16 PM | 53.488 | 124.138 | 70.7 | 42.35 |
| 2016-03-264:24:20 PM | 53.488 | 124.025 | 70.7 | 42.35 |
| 2016-03-264:24:24 PM | 53.488 | 124.025 | 70.7 | 42.35 |
| 2016-03-264:24:29 PM | 53.488 | 123.913 | 70.7 | 42.238 |
| 2016-03-264:24:33 PM | 53.488 | 123.688 | 70.7 | 42.238 |
| 2016-03-264:24:37 PM | 53.375 | 123.462 | 70.7 | 42.125 |
| 2016-03-264:24:41 PM | 53.375 | 123.35 | 70.7 | 42.125 |
| 2016-03-264:24:45 PM | 53.262 | 123.012 | 70.7 | 42.125 |
| 2016-03-264:24:49 PM | 53.262 | 122.788 | 70.7 | 42.125 |
| 2016-03-264:24:53 PM | 53.15 | 122.562 | 70.7 | 42.125 |
| 2016-03-264:24:57 PM | 53.038 | 122.225 | 70.7 | 42.125 |
| 2016-03-264:25:01 PM | 52.925 | 122 | 70.7 | 42.125 |
| 2016-03-264:25:05 PM | 52.812 | 121.775 | 70.7 | 42.125 |
| 2016-03-264:25:09 PM | 52.7 | 121.55 | 70.7 | 42.125 |
| 2016-03-264:25:13 PM | 52.7 | 121.325 | 70.7 | 42.238 |
| 2016-03-264:25:17 PM | 52.588 | 120.988 | 70.7 | 42.238 |
| 2016-03-264:25:21 PM | 52.475 | 120.875 | 70.588 | 42.238 |
| 2016-03-264:25:25 PM | 52.362 | 120.65 | 70.588 | 42.238 |
| 2016-03-264:25:29 PM | 52.362 | 120.425 | 70.588 | 42.238 |
| 2016-03-264:25:33 PM | 52.25 | 120.2 | 70.588 | 42.238 |
| 2016-03-264:25:37 PM | 52.25 | 120.088 | 70.7 | 42.125 |
| 2016-03-264:25:41 PM | 52.25 | 119.975 | 70.7 | 42.125 |
| 2016-03-264:25:45 PM | 52.25 | 119.862 | 70.7 | 42.012 |
| 2016-03-264:25:49 PM | 52.25 | 119.75 | 70.7 | 41.9 |
| 2016-03-264:25:53 PM | 52.362 | 119.75 | 70.588 | 41.788 |
| 2016-03-264:25:57 PM | 52.25 | 119.638 | 70.588 | 41.788 |
| 2016-03-264:26:01 PM | 52.138 | 119.638 | 70.7 | 41.788 |
| 2016-03-264:26:06 PM | 52.138 | 119.525 | 70.588 | 41.788 |
| 2016-03-264:26:10 PM | 52.138 | 119.525 | 70.588 | 41.9 |
| 2016-03-264:26:14 PM | 52.138 | 119.525 | 70.588 | 42.012 |
| 2016-03-264:26:18 PM | 52.138 | 119.525 | 70.7 | 42.012 |
| 2016-03-264:26:22 PM | 52.25 | 119.525 | 70.7 | 42.012 |
| 2016-03-264:26:26 PM | 52.25 | 119.413 | 70.7 | 42.125 |
| 2016-03-264:26:30 PM | 52.25 | 119.413 | 70.7 | 42.125 |
| 2016-03-264:26:34 PM | 52.362 | 119.413 | 70.7 | 42.238 |
| 2016-03-264:26:38 PM | 52.475 | 119.525 | 70.7 | 42.238 |
| 2016-03-264:26:42 PM | 52.475 | 119.525 | 70.7 | 42.238 |
| 2016-03-264:26:46 PM | 52.475 | 119.525 | 70.7 | 42.238 |
| 2016-03-264:26:50 PM | 52.475 | 119.525 | 70.7 | 42.238 |
| 2016-03-264:26:54 PM | 52.475 | 119.525 | 70.7 | 42.238 |
| 2016-03-264:26:58 PM | 52.475 | 119.525 | 70.7 | 42.125 |
| 2016-03-264:27:02 PM | 52.475 | 119.525 | 70.812 | 42.238 |
| 2016-03-264:27:06 PM | 52.475 | 119.525 | 70.7 | 42.238 |
| 2016-03-264:27:10 PM | 52.362 | 119.638 | 70.7 | 42.125 |
| 2016-03-264:27:14 PM | 52.362 | 119.638 | 70.7 | 42.125 |
| 2016-03-264:27:18 PM | 52.362 | 119.638 | 70.812 | 42.125 |
| 2016-03-264:27:23 PM | 52.475 | 119.638 | 70.812 | 42.012 |
| 2016-03-264:27:27 PM | 52.475 | 119.638 | 70.812 | 41.9 |
| 2016-03-264:27:31 PM | 52.475 | 119.638 | 70.812 | 41.788 |
| 2016-03-264:27:35 PM | 52.588 | 119.75 | 70.812 | 41.788 |
| 2016-03-264:27:39 PM | 52.588 | 119.75 | 70.7 | 41.788 |
| 2016-03-264:27:43 PM | 52.588 | 119.75 | 70.7 | 41.788 |
| 2016-03-264:27:47 PM | 52.588 | 119.75 | 70.812 | 41.9 |
| 2016-03-264:27:51 PM | 52.475 | 119.75 | 70.7 | 41.9 |
| 2016-03-264:27:55 PM | 52.362 | 119.75 | 70.7 | 41.9 |
| 2016-03-264:27:59 PM | 52.362 | 119.75 | 70.7 | 41.9 |
| 2016-03-264:28:03 PM | 52.362 | 119.75 | 70.812 | 41.9 |
| 2016-03-264:28:07 PM | 52.362 | 119.75 | 70.7 | 41.9 |
| 2016-03-264:28:11 PM | 52.362 | 119.75 | 70.812 | 41.9 |
| 2016-03-264:28:15 PM | 52.25 | 119.75 | 70.812 | 42.012 |
| 2016-03-264:28:19 PM | 52.25 | 119.75 | 70.812 | 42.012 |
| 2016-03-264:28:23 PM | 52.25 | 119.75 | 70.812 | 42.012 |
| 2016-03-264:28:27 PM | 52.25 | 119.75 | 70.7 | 42.125 |
| 2016-03-264:28:31 PM | 52.362 | 119.75 | 70.812 | 42.125 |
| 2016-03-264:28:35 PM | 52.362 | 119.75 | 70.812 | 42.125 |
| 2016-03-264:28:39 PM | 52.362 | 119.75 | 70.812 | 42.125 |
| 2016-03-264:28:43 PM | 52.362 | 119.638 | 70.812 | 42.125 |
| 2016-03-264:28:47 PM | 52.475 | 119.638 | 70.812 | 42.012 |
| 2016-03-264:28:51 PM | 52.475 | 119.638 | 70.812 | 42.125 |
| 2016-03-264:28:55 PM | 52.588 | 119.638 | 70.812 | 42.012 |
| 2016-03-264:28:59 PM | 52.588 | 119.638 | 70.812 | 41.9 |
| 2016-03-264:29:04 PM | 52.588 | 119.525 | 70.812 | 42.012 |
| 2016-03-264:29:08 PM | 52.588 | 119.525 | 70.812 | 42.012 |
| 2016-03-264:29:12 PM | 52.7 | 119.525 | 70.812 | 41.9 |
| 2016-03-264:29:16 PM | 52.7 | 119.525 | 70.812 | 41.9 |
| 2016-03-264:29:20 PM | 52.812 | 119.525 | 70.812 | 41.788 |
| 2016-03-264:29:24 PM | 52.812 | 119.525 | 70.812 | 41.788 |
| 2016-03-264:29:28 PM | 52.812 | 119.525 | 70.925 | 41.562 |
| 2016-03-264:29:32 PM | 52.925 | 119.413 | 70.812 | 41.562 |
| 2016-03-264:29:36 PM | 52.925 | 119.413 | 70.925 | 41.562 |
| 2016-03-264:29:40 PM | 53.038 | 119.413 | 70.925 | 41.45 |
| 2016-03-264:29:44 PM | 53.038 | 119.413 | 70.925 | 41.225 |
| 2016-03-264:29:48 PM | 52.925 | 119.413 | 70.925 | 41.112 |
| 2016-03-264:29:52 PM | 52.925 | 119.413 | 70.925 | 41 |
| 2016-03-264:29:56 PM | 53.038 | 119.3 | 70.925 | 40.775 |
| 2016-03-264:30:00 PM | 52.925 | 119.413 | 70.925 | 40.662 |
| 2016-03-264:30:04 PM | 52.925 | 119.3 | 70.925 | 40.55 |
| 2016-03-264:30:08 PM | 52.812 | 119.3 | 70.925 | 40.438 |
| 2016-03-264:30:12 PM | 52.812 | 119.3 | 70.925 | 40.438 |
| 2016-03-264:30:17 PM | 52.812 | 119.3 | 70.925 | 40.438 |
| 2016-03-264:30:21 PM | 52.7 | 119.3 | 70.812 | 40.325 |
| 2016-03-264:30:25 PM | 52.7 | 119.3 | 70.925 | 40.325 |
| 2016-03-264:30:29 PM | 52.588 | 119.188 | 70.925 | 40.325 |
| 2016-03-264:30:33 PM | 52.588 | 119.188 | 70.925 | 40.438 |
| 2016-03-264:30:37 PM | 52.588 | 119.188 | 70.925 | 40.55 |
| 2016-03-264:30:41 PM | 52.475 | 119.188 | 70.812 | 40.662 |
| 2016-03-264:30:45 PM | 52.362 | 119.188 | 70.925 | 40.775 |
| 2016-03-264:30:49 PM | 52.362 | 119.075 | 70.925 | 40.775 |
| 2016-03-264:30:53 PM | 52.25 | 119.075 | 70.925 | 40.888 |
| 2016-03-264:30:57 PM | 52.25 | 118.962 | 70.925 | 41 |
| 2016-03-264:31:01 PM | 52.138 | 118.962 | 70.925 | 41.112 |
| 2016-03-264:31:05 PM | 52.138 | 118.962 | 70.925 | 41.112 |
| 2016-03-264:31:09 PM | 52.138 | 118.962 | 70.925 | 41.225 |
| 2016-03-264:31:13 PM | 52.138 | 118.85 | 70.925 | 41.225 |
| 2016-03-264:31:17 PM | 52.025 | 118.85 | 70.812 | 41.338 |
| 2016-03-264:31:22 PM | 52.025 | 118.85 | 70.812 | 41.45 |
| 2016-03-264:31:26 PM | 52.138 | 118.738 | 70.812 | 41.562 |
| 2016-03-264:31:30 PM | 52.025 | 118.738 | 70.925 | 41.562 |
| 2016-03-264:31:34 PM | 52.138 | 118.738 | 70.812 | 41.675 |
| 2016-03-264:31:38 PM | 52.138 | 118.738 | 70.925 | 41.788 |
| 2016-03-264:31:42 PM | 52.25 | 118.625 | 70.925 | 41.788 |
| 2016-03-264:31:46 PM | 52.362 | 118.738 | 70.925 | 41.9 |
| 2016-03-264:31:50 PM | 52.362 | 118.625 | 70.812 | 42.012 |
| 2016-03-264:31:54 PM | 52.475 | 118.625 | 70.812 | 42.012 |
| 2016-03-264:31:58 PM | 52.588 | 118.625 | 70.812 | 42.012 |
| 2016-03-264:32:02 PM | 52.588 | 118.625 | 70.812 | 42.012 |
| 2016-03-264:32:06 PM | 52.7 | 118.625 | 70.812 | 42.012 |
| 2016-03-264:32:10 PM | 52.812 | 118.625 | 70.812 | 41.9 |
| 2016-03-264:32:14 PM | 52.812 | 118.625 | 70.925 | 41.788 |
| 2016-03-264:32:19 PM | 52.925 | 118.625 | 70.925 | 41.9 |
| 2016-03-264:32:23 PM | 52.925 | 118.625 | 70.925 | 41.9 |
| 2016-03-264:32:27 PM | 53.038 | 118.512 | 70.925 | 42.012 |
| 2016-03-264:32:31 PM | 53.038 | 118.4 | 70.925 | 42.125 |
| 2016-03-264:32:35 PM | 53.038 | 118.288 | 70.925 | 42.125 |
| 2016-03-264:32:39 PM | 53.038 | 118.288 | 70.925 | 42.238 |
| 2016-03-264:32:43 PM | 53.038 | 118.175 | 70.925 | 42.238 |
| 2016-03-264:32:47 PM | 53.038 | 118.175 | 70.925 | 42.35 |
| 2016-03-264:32:51 PM | 53.038 | 118.062 | 70.812 | 42.35 |
| 2016-03-264:32:55 PM | 53.038 | 118.062 | 70.925 | 42.35 |
| 2016-03-264:32:59 PM | 53.038 | 118.062 | 70.925 | 42.462 |
| 2016-03-264:33:03 PM | 53.038 | 117.95 | 70.925 | 42.575 |
| 2016-03-264:33:07 PM | 53.038 | 117.95 | 70.812 | 42.575 |
| 2016-03-264:33:11 PM | 53.038 | 117.95 | 70.812 | 42.575 |
| 2016-03-264:33:15 PM | 53.15 | 117.95 | 70.925 | 42.688 |
| 2016-03-264:33:19 PM | 53.15 | 117.95 | 70.925 | 42.688 |
| 2016-03-264:33:24 PM | 53.15 | 117.838 | 70.925 | 42.688 |
| 2016-03-264:33:28 PM | 53.15 | 117.838 | 70.925 | 42.688 |
| 2016-03-264:33:32 PM | 53.262 | 117.838 | 70.812 | 42.688 |
| 2016-03-264:33:36 PM | 53.262 | 117.838 | 70.812 | 42.688 |
| 2016-03-264:33:40 PM | 53.262 | 117.725 | 70.812 | 42.688 |
| 2016-03-264:33:44 PM | 53.262 | 117.725 | 70.925 | 42.688 |
| 2016-03-264:33:48 PM | 53.262 | 117.725 | 70.812 | 42.688 |
| 2016-03-264:33:52 PM | 53.262 | 117.725 | 70.812 | 42.688 |
| 2016-03-264:33:56 PM | 53.262 | 117.725 | 70.812 | 42.688 |
| 2016-03-264:34:00 PM | 53.375 | 117.725 | 70.925 | 42.462 |
| 2016-03-264:34:04 PM | 53.375 | 117.725 | 70.812 | 42.35 |
| 2016-03-264:34:08 PM | 53.375 | 117.612 | 70.812 | 42.35 |
| 2016-03-264:34:12 PM | 53.488 | 117.612 | 70.812 | 42.35 |
| 2016-03-264:34:16 PM | 53.488 | 117.612 | 70.812 | 42.238 |
| 2016-03-264:34:20 PM | 53.6 | 117.612 | 70.812 | 42.238 |
| 2016-03-264:34:24 PM | 53.6 | 117.612 | 70.812 | 42.125 |
| 2016-03-264:34:28 PM | 53.6 | 117.612 | 70.812 | 42.125 |
| 2016-03-264:34:32 PM | 53.6 | 117.612 | 70.812 | 42.125 |
| 2016-03-264:34:37 PM | 53.6 | 117.612 | 70.7 | 42.125 |
| 2016-03-264:34:41 PM | 53.712 | 117.612 | 70.7 | 42.125 |
| 2016-03-264:34:45 PM | 53.712 | 117.5 | 70.7 | 42.125 |
| 2016-03-264:34:49 PM | 53.712 | 117.612 | 70.7 | 42.125 |
| 2016-03-264:34:53 PM | 53.712 | 117.5 | 70.7 | 42.125 |
| 2016-03-264:34:57 PM | 53.712 | 117.5 | 70.7 | 42.125 |
| 2016-03-264:35:01 PM | 53.712 | 117.388 | 70.7 | 42.012 |
| 2016-03-264:35:05 PM | 53.825 | 117.388 | 70.7 | 41.788 |
| 2016-03-264:35:09 PM | 53.825 | 117.388 | 70.7 | 41.788 |
| 2016-03-264:35:13 PM | 53.825 | 117.388 | 70.7 | 41.675 |
| 2016-03-264:35:17 PM | 53.825 | 117.275 | 70.7 | 41.675 |
| 2016-03-264:35:21 PM | 53.825 | 117.388 | 70.7 | 41.675 |
| 2016-03-264:35:25 PM | 53.712 | 117.275 | 70.7 | 41.675 |
| 2016-03-264:35:29 PM | 53.712 | 117.275 | 70.7 | 41.562 |
| 2016-03-264:35:33 PM | 53.712 | 117.275 | 70.7 | 41.45 |
| 2016-03-264:35:37 PM | 53.712 | 117.275 | 70.7 | 41.338 |
| 2016-03-264:35:42 PM | 53.825 | 117.163 | 70.7 | 41.225 |
| 2016-03-264:35:46 PM | 53.712 | 117.163 | 70.588 | 41.225 |
| 2016-03-264:35:50 PM | 53.712 | 117.163 | 70.588 | 41 |
| 2016-03-264:35:54 PM | 53.825 | 117.163 | 70.588 | 41 |
| 2016-03-264:35:58 PM | 53.712 | 117.163 | 70.588 | 40.888 |
| 2016-03-264:36:02 PM | 53.712 | 117.05 | 70.588 | 40.888 |
| 2016-03-264:36:06 PM | 53.6 | 117.05 | 70.588 | 40.775 |
| 2016-03-264:36:10 PM | 53.375 | 117.05 | 70.588 | 40.662 |
| 2016-03-264:36:14 PM | 53.262 | 117.05 | 70.588 | 40.662 |
| 2016-03-264:36:18 PM | 53.15 | 117.05 | 70.588 | 40.662 |
| 2016-03-264:36:22 PM | 53.038 | 116.938 | 70.588 | 40.662 |
| 2016-03-264:36:26 PM | 52.925 | 116.938 | 70.588 | 40.662 |
| 2016-03-264:36:30 PM | 52.812 | 116.938 | 70.588 | 40.775 |
| 2016-03-264:36:34 PM | 52.475 | 116.825 | 70.588 | 40.888 |
| 2016-03-264:36:38 PM | 52.362 | 116.825 | 70.588 | 40.888 |
| 2016-03-264:36:42 PM | 52.138 | 116.825 | 70.588 | 41 |
| 2016-03-264:36:46 PM | 52.025 | 116.712 | 70.588 | 41 |
| 2016-03-264:36:50 PM | 51.912 | 116.712 | 70.588 | 41.112 |
| 2016-03-264:36:55 PM | 51.912 | 116.6 | 70.588 | 41.112 |
| 2016-03-264:36:59 PM | 51.8 | 116.6 | 70.588 | 41.225 |
| 2016-03-264:37:03 PM | 51.8 | 116.6 | 70.588 | 41.338 |
| 2016-03-264:37:07 PM | 51.8 | 116.6 | 70.588 | 41.338 |
| 2016-03-264:37:11 PM | 51.8 | 116.488 | 70.588 | 41.338 |
| 2016-03-264:37:15 PM | 51.8 | 116.488 | 70.475 | 41.45 |
| 2016-03-264:37:19 PM | 51.912 | 116.375 | 70.588 | 41.45 |
| 2016-03-264:37:23 PM | 51.912 | 116.375 | 70.588 | 41.45 |
| 2016-03-264:37:27 PM | 51.912 | 116.375 | 70.588 | 41.45 |
| 2016-03-264:37:31 PM | 51.912 | 116.262 | 70.588 | 41.338 |
| 2016-03-264:37:35 PM | 52.025 | 116.262 | 70.475 | 41.338 |
| 2016-03-264:37:39 PM | 52.025 | 116.262 | 70.588 | 41.338 |
| 2016-03-264:37:43 PM | 52.138 | 116.262 | 70.475 | 41.225 |
| 2016-03-264:37:47 PM | 52.138 | 116.15 | 70.475 | 41.225 |
| 2016-03-264:37:51 PM | 52.138 | 116.15 | 70.475 | 41.225 |
| 2016-03-264:37:55 PM | 52.138 | 116.15 | 70.475 | 41.338 |
| 2016-03-264:37:59 PM | 52.138 | 116.15 | 70.475 | 41.338 |
| 2016-03-264:38:03 PM | 52.138 | 116.038 | 70.475 | 41.562 |
| 2016-03-264:38:07 PM | 52.138 | 116.038 | 70.475 | 41.562 |
| 2016-03-264:38:12 PM | 52.25 | 115.925 | 70.475 | 41.675 |
| 2016-03-264:38:16 PM | 52.25 | 115.925 | 70.475 | 41.675 |
| 2016-03-264:38:20 PM | 52.25 | 115.925 | 70.475 | 41.788 |
| 2016-03-264:38:24 PM | 52.25 | 115.812 | 70.475 | 41.675 |
| 2016-03-264:38:28 PM | 52.25 | 115.812 | 70.475 | 41.562 |
| 2016-03-264:38:32 PM | 52.25 | 115.812 | 70.588 | 41.562 |
| 2016-03-264:38:36 PM | 52.25 | 115.812 | 70.475 | 41.45 |
| 2016-03-264:38:40 PM | 52.138 | 115.812 | 70.588 | 41.338 |
| 2016-03-264:38:44 PM | 52.138 | 115.7 | 70.588 | 41.225 |
| 2016-03-264:38:48 PM | 52.138 | 115.7 | 70.588 | 41.112 |
| 2016-03-264:38:52 PM | 52.138 | 115.7 | 70.588 | 40.888 |
| 2016-03-264:38:56 PM | 52.138 | 115.7 | 70.475 | 40.775 |
| 2016-03-264:39:00 PM | 52.25 | 115.588 | 70.588 | 40.55 |
| 2016-03-264:39:04 PM | 52.25 | 115.588 | 70.588 | 40.438 |
| 2016-03-264:39:08 PM | 52.25 | 115.588 | 70.588 | 40.325 |
| 2016-03-264:39:12 PM | 52.25 | 115.588 | 70.588 | 40.212 |
| 2016-03-264:39:17 PM | 52.25 | 115.475 | 70.588 | 40.1 |
| 2016-03-264:39:21 PM | 52.25 | 115.475 | 70.588 | 39.988 |
| 2016-03-264:39:25 PM | 52.25 | 115.362 | 70.588 | 39.875 |
| 2016-03-264:39:29 PM | 52.138 | 115.362 | 70.7 | 39.875 |
| 2016-03-264:39:33 PM | 52.138 | 115.25 | 70.588 | 39.875 |
| 2016-03-264:39:37 PM | 52.025 | 115.25 | 70.588 | 39.875 |
| 2016-03-264:39:41 PM | 52.025 | 115.138 | 70.588 | 39.875 |
| 2016-03-264:39:45 PM | 52.025 | 115.025 | 70.588 | 39.988 |
| 2016-03-264:39:49 PM | 52.025 | 114.913 | 70.7 | 40.1 |
| 2016-03-264:39:53 PM | 52.025 | 114.913 | 70.7 | 40.1 |
| 2016-03-264:39:57 PM | 52.025 | 114.8 | 70.7 | 40.212 |
| 2016-03-264:40:01 PM | 52.025 | 114.688 | 70.7 | 40.212 |
| 2016-03-264:40:05 PM | 52.025 | 114.688 | 70.7 | 40.212 |
| 2016-03-264:40:09 PM | 52.025 | 114.575 | 70.7 | 40.212 |
| 2016-03-264:40:13 PM | 52.138 | 114.462 | 70.7 | 40.212 |
| 2016-03-264:40:17 PM | 52.138 | 114.462 | 70.7 | 40.212 |
| 2016-03-264:40:21 PM | 52.25 | 114.35 | 70.7 | 40.212 |
| 2016-03-264:40:25 PM | 52.25 | 114.35 | 70.7 | 40.325 |
| 2016-03-264:40:29 PM | 52.25 | 114.238 | 70.7 | 40.325 |
| 2016-03-264:40:34 PM | 52.362 | 114.238 | 70.7 | 40.325 |
| 2016-03-264:40:38 PM | 52.362 | 114.125 | 70.7 | 40.325 |
| 2016-03-264:40:42 PM | 52.362 | 114.125 | 70.7 | 40.325 |
| 2016-03-264:40:46 PM | 52.362 | 114.012 | 70.7 | 40.325 |
| 2016-03-264:40:50 PM | 52.25 | 114.012 | 70.7 | 40.325 |
| 2016-03-264:40:54 PM | 52.25 | 114.012 | 70.7 | 40.212 |
| 2016-03-264:40:58 PM | 52.362 | 114.012 | 70.7 | 40.1 |
| 2016-03-264:41:02 PM | 52.362 | 113.9 | 70.7 | 39.988 |
| 2016-03-264:41:06 PM | 52.362 | 113.9 | 70.7 | 39.988 |
| 2016-03-264:41:10 PM | 52.362 | 113.9 | 70.7 | 39.988 |
| 2016-03-264:41:14 PM | 52.362 | 113.9 | 70.812 | 39.988 |
| 2016-03-264:41:18 PM | 52.25 | 113.788 | 70.7 | 39.988 |
| 2016-03-264:41:22 PM | 52.362 | 113.788 | 70.812 | 39.875 |
| 2016-03-264:41:26 PM | 52.362 | 113.788 | 70.812 | 39.762 |
| 2016-03-264:41:30 PM | 52.25 | 113.788 | 70.812 | 39.762 |
| 2016-03-264:41:34 PM | 52.25 | 113.675 | 70.812 | 39.65 |
| 2016-03-264:41:38 PM | 52.25 | 113.675 | 70.812 | 39.538 |
| 2016-03-264:41:43 PM | 52.25 | 113.675 | 70.812 | 39.538 |
| 2016-03-264:41:47 PM | 52.25 | 113.45 | 70.812 | 39.425 |
| 2016-03-264:41:51 PM | 52.25 | 113.338 | 70.812 | 39.312 |
| 2016-03-264:41:55 PM | 52.138 | 113.225 | 70.925 | 39.2 |
| 2016-03-264:41:59 PM | 52.138 | 113 | 70.812 | 39.2 |
| 2016-03-264:42:03 PM | 52.025 | 112.775 | 70.925 | 39.088 |
| 2016-03-264:42:07 PM | 51.912 | 112.55 | 70.925 | 38.975 |
| 2016-03-264:42:11 PM | 51.8 | 112.212 | 70.925 | 38.975 |
| 2016-03-264:42:15 PM | 51.688 | 111.875 | 70.925 | 38.975 |
| 2016-03-264:42:19 PM | 51.575 | 111.538 | 70.812 | 38.975 |
| 2016-03-264:42:23 PM | 51.462 | 111.2 | 70.812 | 38.975 |
| 2016-03-264:42:27 PM | 51.238 | 110.862 | 70.812 | 38.862 |
| 2016-03-264:42:31 PM | 51.012 | 110.525 | 70.812 | 38.862 |
| 2016-03-264:42:35 PM | 50.788 | 110.075 | 70.812 | 38.862 |
| 2016-03-264:42:39 PM | 50.675 | 109.738 | 70.812 | 38.862 |
| 2016-03-264:42:43 PM | 50.338 | 109.288 | 70.812 | 38.862 |
| 2016-03-264:42:47 PM | 50.225 | 108.95 | 70.812 | 38.862 |
| 2016-03-264:42:51 PM | 49.888 | 108.5 | 70.812 | 38.862 |
| 2016-03-264:42:55 PM | 49.55 | 108.05 | 70.812 | 38.862 |
| 2016-03-264:43:00 PM | 49.438 | 107.6 | 70.812 | 38.862 |
| 2016-03-264:43:04 PM | 49.212 | 107.262 | 70.812 | 38.975 |
| 2016-03-264:43:08 PM | 49.1 | 106.812 | 70.812 | 39.088 |
| 2016-03-264:43:12 PM | 48.875 | 106.475 | 70.812 | 39.088 |
| 2016-03-264:43:16 PM | 48.762 | 106.025 | 70.812 | 39.2 |
| 2016-03-264:43:20 PM | 48.65 | 105.688 | 70.812 | 39.2 |
| 2016-03-264:43:24 PM | 48.538 | 105.35 | 70.7 | 39.312 |
| 2016-03-264:43:28 PM | 48.425 | 105.012 | 70.812 | 39.425 |
| 2016-03-264:43:32 PM | 48.312 | 104.675 | 70.7 | 39.312 |
| 2016-03-264:43:36 PM | 48.312 | 104.45 | 70.7 | 39.425 |
| 2016-03-264:43:40 PM | 48.2 | 104.112 | 70.7 | 39.538 |
| 2016-03-264:43:44 PM | 48.2 | 103.888 | 70.7 | 39.65 |
| 2016-03-264:43:48 PM | 48.2 | 103.775 | 70.7 | 39.65 |
| 2016-03-264:43:52 PM | 48.088 | 103.55 | 70.812 | 39.65 |
| 2016-03-264:43:56 PM | 48.2 | 103.438 | 70.812 | 39.65 |
| 2016-03-264:44:00 PM | 48.2 | 103.325 | 70.7 | 39.538 |
| 2016-03-264:44:04 PM | 48.312 | 103.212 | 70.7 | 39.538 |
| 2016-03-264:44:09 PM | 48.312 | 103.1 | 70.812 | 39.538 |
| 2016-03-264:44:13 PM | 48.312 | 102.988 | 70.812 | 39.538 |
| 2016-03-264:44:17 PM | 48.425 | 102.875 | 70.812 | 39.425 |
| 2016-03-264:44:21 PM | 48.425 | 102.762 | 70.7 | 39.425 |
| 2016-03-264:44:25 PM | 48.425 | 102.65 | 70.7 | 39.425 |
| 2016-03-264:44:29 PM | 48.425 | 102.538 | 70.7 | 39.425 |
| 2016-03-264:44:33 PM | 48.425 | 102.312 | 70.7 | 39.425 |
| 2016-03-264:44:37 PM | 48.425 | 102.2 | 70.7 | 39.425 |
| 2016-03-264:44:41 PM | 48.312 | 102.088 | 70.7 | 39.425 |
| 2016-03-264:44:45 PM | 48.312 | 101.975 | 70.812 | 39.312 |
| 2016-03-264:44:49 PM | 48.312 | 101.862 | 70.812 | 39.312 |
| 2016-03-264:44:53 PM | 48.312 | 101.638 | 70.7 | 39.312 |
| 2016-03-264:44:57 PM | 48.312 | 101.525 | 70.812 | 39.2 |
| 2016-03-264:45:01 PM | 48.425 | 101.413 | 70.7 | 39.2 |
| 2016-03-264:45:05 PM | 48.425 | 101.3 | 70.812 | 38.975 |
| 2016-03-264:45:09 PM | 48.425 | 101.188 | 70.812 | 38.862 |
| 2016-03-264:45:13 PM | 48.312 | 101.075 | 70.7 | 38.862 |
| 2016-03-264:45:18 PM | 48.312 | 100.85 | 70.7 | 38.75 |
| 2016-03-264:45:22 PM | 48.2 | 100.738 | 70.7 | 38.75 |
| 2016-03-264:45:26 PM | 48.088 | 100.512 | 70.7 | 38.75 |
| 2016-03-264:45:30 PM | 47.975 | 100.288 | 70.7 | 38.638 |
| 2016-03-264:45:34 PM | 47.862 | 100.062 | 70.7 | 38.638 |
| 2016-03-264:45:38 PM | 47.862 | 99.838 | 70.7 | 38.638 |
| 2016-03-264:45:42 PM | 47.75 | 99.612 | 70.7 | 38.525 |
| 2016-03-264:45:46 PM | 47.638 | 99.388 | 70.7 | 38.525 |
| 2016-03-264:45:50 PM | 47.525 | 99.05 | 70.7 | 38.525 |
| 2016-03-264:45:54 PM | 47.525 | 98.825 | 70.7 | 38.412 |
| 2016-03-264:45:58 PM | 47.412 | 98.488 | 70.7 | 38.412 |
| 2016-03-264:46:02 PM | 47.3 | 98.262 | 70.7 | 38.3 |
| 2016-03-264:46:06 PM | 47.188 | 97.925 | 70.7 | 38.3 |
| 2016-03-264:46:10 PM | 47.075 | 97.7 | 70.7 | 38.188 |
| 2016-03-264:46:14 PM | 46.962 | 97.362 | 70.7 | 38.188 |
| 2016-03-264:46:18 PM | 46.85 | 97.138 | 70.7 | 38.188 |
| 2016-03-264:46:22 PM | 46.738 | 96.913 | 70.7 | 38.188 |
| 2016-03-264:46:26 PM | 46.625 | 96.688 | 70.7 | 38.188 |
| 2016-03-264:46:30 PM | 46.512 | 96.35 | 70.7 | 38.3 |
| 2016-03-264:46:34 PM | 46.512 | 96.125 | 70.7 | 38.3 |
| 2016-03-264:46:38 PM | 46.288 | 95.9 | 70.7 | 38.3 |
| 2016-03-264:46:43 PM | 46.288 | 95.788 | 70.7 | 38.3 |
| 2016-03-264:46:47 PM | 46.175 | 95.562 | 70.7 | 38.3 |
| 2016-03-264:46:51 PM | 46.175 | 95.45 | 70.7 | 38.188 |
| 2016-03-264:46:55 PM | 46.175 | 95.338 | 70.7 | 38.188 |
| 2016-03-264:46:59 PM | 46.175 | 95.338 | 70.7 | 38.188 |
| 2016-03-264:47:03 PM | 46.062 | 95.338 | 70.7 | 38.188 |
| 2016-03-264:47:07 PM | 46.175 | 95.225 | 70.7 | 38.188 |
| 2016-03-264:47:11 PM | 46.175 | 95.225 | 70.7 | 38.188 |
| 2016-03-264:47:15 PM | 46.288 | 95.225 | 70.7 | 38.188 |
| 2016-03-264:47:19 PM | 46.288 | 95.225 | 70.7 | 38.075 |
| 2016-03-264:47:23 PM | 46.288 | 95.112 | 70.7 | 38.075 |
| 2016-03-264:47:27 PM | 46.288 | 95.112 | 70.7 | 38.075 |
| 2016-03-264:47:31 PM | 46.288 | 95.112 | 70.7 | 37.962 |
| 2016-03-264:47:35 PM | 46.288 | 95.112 | 70.7 | 37.962 |
| 2016-03-264:47:39 PM | 46.288 | 95.112 | 70.7 | 37.962 |
| 2016-03-264:47:43 PM | 46.288 | 95 | 70.7 | 38.075 |
| 2016-03-264:47:47 PM | 46.288 | 94.888 | 70.7 | 37.962 |
| 2016-03-264:47:51 PM | 46.288 | 94.888 | 70.7 | 38.075 |
| 2016-03-264:47:55 PM | 46.288 | 94.775 | 70.7 | 38.075 |
| 2016-03-264:48:00 PM | 46.175 | 94.663 | 70.588 | 38.188 |
| 2016-03-264:48:04 PM | 46.175 | 94.55 | 70.7 | 38.188 |
| 2016-03-264:48:08 PM | 46.062 | 94.438 | 70.588 | 38.3 |
| 2016-03-264:48:12 PM | 45.95 | 94.212 | 70.588 | 38.3 |
| 2016-03-264:48:16 PM | 45.95 | 94.1 | 70.588 | 38.3 |
| 2016-03-264:48:20 PM | 45.838 | 93.988 | 70.588 | 38.3 |
| 2016-03-264:48:24 PM | 45.838 | 93.762 | 70.588 | 38.412 |
| 2016-03-264:48:28 PM | 45.725 | 93.65 | 70.588 | 38.525 |
| 2016-03-264:48:32 PM | 45.838 | 93.538 | 70.588 | 38.412 |
| 2016-03-264:48:36 PM | 45.838 | 93.425 | 70.588 | 38.525 |
| 2016-03-264:48:40 PM | 45.838 | 93.312 | 70.588 | 38.525 |
| 2016-03-264:48:44 PM | 45.838 | 93.2 | 70.588 | 38.525 |
| 2016-03-264:48:48 PM | 45.725 | 93.088 | 70.588 | 38.638 |
| 2016-03-264:48:52 PM | 45.725 | 92.975 | 70.475 | 38.75 |
| 2016-03-264:48:56 PM | 45.725 | 92.75 | 70.475 | 38.862 |
| 2016-03-264:49:00 PM | 45.725 | 92.75 | 70.475 | 38.862 |
| 2016-03-264:49:04 PM | 45.612 | 92.525 | 70.475 | 38.975 |
| 2016-03-264:49:08 PM | 45.612 | 92.413 | 70.475 | 38.975 |
| 2016-03-264:49:13 PM | 45.612 | 92.3 | 70.475 | 38.975 |
| 2016-03-264:49:17 PM | 45.612 | 92.188 | 70.475 | 39.088 |
| 2016-03-264:49:21 PM | 45.5 | 92.075 | 70.362 | 39.088 |
| 2016-03-264:49:25 PM | 45.5 | 91.962 | 70.362 | 39.088 |
| 2016-03-264:49:29 PM | 45.5 | 91.85 | 70.362 | 39.088 |
| 2016-03-264:49:33 PM | 45.5 | 91.85 | 70.362 | 39.2 |
| 2016-03-264:49:37 PM | 45.5 | 91.738 | 70.362 | 39.312 |
| 2016-03-264:49:41 PM | 45.5 | 91.738 | 70.362 | 39.312 |
| 2016-03-264:49:45 PM | 45.5 | 91.738 | 70.362 | 39.425 |
| 2016-03-264:49:49 PM | 45.5 | 91.738 | 70.362 | 39.425 |
| 2016-03-264:49:53 PM | 45.5 | 91.738 | 70.362 | 39.538 |
| 2016-03-264:49:57 PM | 45.5 | 91.625 | 70.362 | 39.538 |
| 2016-03-264:50:01 PM | 45.5 | 91.625 | 70.362 | 39.65 |
| 2016-03-264:50:05 PM | 45.612 | 91.625 | 70.25 | 39.65 |
| 2016-03-264:50:09 PM | 45.612 | 91.738 | 70.25 | 39.65 |
| 2016-03-264:50:13 PM | 45.612 | 91.625 | 70.25 | 39.538 |
| 2016-03-264:50:18 PM | 45.612 | 91.625 | 70.25 | 39.538 |
| 2016-03-264:50:22 PM | 45.612 | 91.625 | 70.25 | 39.538 |
| 2016-03-264:50:26 PM | 45.612 | 91.625 | 70.25 | 39.538 |
| 2016-03-264:50:30 PM | 45.725 | 91.512 | 70.25 | 39.425 |
| 2016-03-264:50:34 PM | 45.725 | 91.4 | 70.25 | 39.425 |
| 2016-03-264:50:38 PM | 45.838 | 91.4 | 70.138 | 39.425 |
| 2016-03-264:50:42 PM | 45.838 | 91.175 | 70.138 | 39.425 |
| 2016-03-264:50:46 PM | 45.95 | 91.062 | 70.138 | 39.425 |
| 2016-03-264:50:50 PM | 46.175 | 90.838 | 70.138 | 39.312 |
| 2016-03-264:50:54 PM | 46.288 | 90.725 | 70.138 | 39.312 |
| 2016-03-264:50:58 PM | 46.4 | 90.5 | 70.138 | 39.312 |
| 2016-03-264:51:02 PM | 46.512 | 90.388 | 70.138 | 39.312 |
| 2016-03-264:51:06 PM | 46.625 | 90.275 | 70.138 | 39.312 |
| 2016-03-264:51:10 PM | 46.738 | 90.163 | 70.138 | 39.312 |
| 2016-03-264:51:14 PM | 46.738 | 89.938 | 70.138 | 39.2 |
| 2016-03-264:51:19 PM | 46.85 | 89.825 | 70.138 | 39.2 |
| 2016-03-264:51:23 PM | 46.962 | 89.6 | 70.138 | 39.088 |
| 2016-03-264:51:27 PM | 46.962 | 89.488 | 70.025 | 39.088 |
| 2016-03-264:51:31 PM | 47.188 | 89.262 | 70.025 | 38.975 |
| 2016-03-264:51:35 PM | 47.188 | 89.15 | 70.138 | 38.975 |
| 2016-03-264:51:39 PM | 47.3 | 89.038 | 70.025 | 38.975 |
| 2016-03-264:51:43 PM | 47.3 | 88.812 | 70.025 | 38.975 |
| 2016-03-264:51:47 PM | 47.412 | 88.588 | 70.025 | 39.088 |
| 2016-03-264:51:51 PM | 47.412 | 88.475 | 70.025 | 39.088 |
| 2016-03-264:51:55 PM | 47.412 | 88.362 | 70.025 | 39.2 |
| 2016-03-264:51:59 PM | 47.412 | 88.138 | 70.025 | 39.312 |
| 2016-03-264:52:03 PM | 47.412 | 87.912 | 70.025 | 39.425 |
| 2016-03-264:52:07 PM | 47.412 | 87.8 | 70.025 | 39.538 |
| 2016-03-264:52:11 PM | 47.412 | 87.688 | 70.025 | 39.538 |
| 2016-03-264:52:15 PM | 47.525 | 87.575 | 69.912 | 39.538 |
| 2016-03-264:52:19 PM | 47.525 | 87.462 | 69.912 | 39.538 |
| 2016-03-264:52:24 PM | 47.525 | 87.35 | 69.912 | 39.538 |
| 2016-03-264:52:28 PM | 47.525 | 87.125 | 69.912 | 39.538 |
| 2016-03-264:52:32 PM | 47.638 | 87.012 | 69.912 | 39.425 |
| 2016-03-264:52:36 PM | 47.75 | 86.9 | 69.912 | 39.425 |
| 2016-03-264:52:40 PM | 47.75 | 86.788 | 69.912 | 39.425 |
| 2016-03-264:52:44 PM | 47.862 | 86.675 | 69.912 | 39.425 |
| 2016-03-264:52:48 PM | 47.862 | 86.562 | 69.8 | 39.425 |
| 2016-03-264:52:52 PM | 47.862 | 86.45 | 69.8 | 39.425 |
| 2016-03-264:52:56 PM | 47.975 | 86.45 | 69.912 | 39.425 |
| 2016-03-264:53:00 PM | 48.088 | 86.338 | 69.912 | 39.312 |
| 2016-03-264:53:04 PM | 48.088 | 86.225 | 69.8 | 39.425 |
| 2016-03-264:53:08 PM | 48.2 | 86.112 | 69.8 | 39.425 |
| 2016-03-264:53:12 PM | 48.2 | 86 | 69.8 | 39.425 |
| 2016-03-264:53:16 PM | 48.312 | 85.888 | 69.8 | 39.425 |
| 2016-03-264:53:21 PM | 48.425 | 85.888 | 69.8 | 39.425 |
| 2016-03-264:53:25 PM | 48.425 | 85.775 | 69.8 | 39.538 |
| 2016-03-264:53:29 PM | 48.538 | 85.775 | 69.8 | 39.538 |
| 2016-03-264:53:33 PM | 48.65 | 85.775 | 69.8 | 39.538 |
| 2016-03-264:53:37 PM | 48.65 | 85.775 | 69.8 | 39.65 |
| 2016-03-264:53:41 PM | 48.65 | 85.662 | 69.8 | 39.65 |
| 2016-03-264:53:45 PM | 48.762 | 85.775 | 69.688 | 39.65 |
| 2016-03-264:53:49 PM | 48.875 | 85.662 | 69.8 | 39.65 |
| 2016-03-264:53:53 PM | 48.988 | 85.662 | 69.8 | 39.65 |
| 2016-03-264:53:57 PM | 48.988 | 85.662 | 69.688 | 39.762 |
| 2016-03-264:54:01 PM | 49.1 | 85.662 | 69.688 | 39.762 |
| 2016-03-264:54:05 PM | 49.1 | 85.662 | 69.688 | 39.762 |
| 2016-03-264:54:09 PM | 49.212 | 85.775 | 69.688 | 39.875 |
| 2016-03-264:54:13 PM | 49.212 | 85.775 | 69.688 | 39.875 |
| 2016-03-264:54:17 PM | 49.212 | 85.775 | 69.688 | 39.988 |
| 2016-03-264:54:21 PM | 49.1 | 85.662 | 69.688 | 39.988 |
| 2016-03-264:54:25 PM | 49.1 | 85.662 | 69.688 | 39.988 |
| 2016-03-264:54:29 PM | 48.988 | 85.662 | 69.688 | 39.988 |
| 2016-03-264:54:33 PM | 48.988 | 85.662 | 69.688 | 39.988 |
| 2016-03-264:54:37 PM | 48.988 | 85.662 | 69.688 | 39.988 |
| 2016-03-264:54:41 PM | 48.875 | 85.55 | 69.575 | 39.988 |
| 2016-03-264:54:45 PM | 48.875 | 85.55 | 69.688 | 39.988 |
| 2016-03-264:54:49 PM | 48.988 | 85.55 | 69.575 | 39.988 |
| 2016-03-264:54:53 PM | 48.988 | 85.55 | 69.575 | 39.988 |
| 2016-03-264:54:57 PM | 48.875 | 85.55 | 69.575 | 40.1 |
| 2016-03-264:55:02 PM | 48.875 | 85.55 | 69.575 | 40.1 |
| 2016-03-264:55:06 PM | 48.988 | 85.55 | 69.575 | 40.1 |
| 2016-03-264:55:10 PM | 48.988 | 85.55 | 69.575 | 39.988 |
| 2016-03-264:55:14 PM | 49.1 | 85.55 | 69.575 | 39.988 |
| 2016-03-264:55:18 PM | 49.1 | 85.438 | 69.575 | 39.875 |
| 2016-03-264:55:22 PM | 49.212 | 85.438 | 69.575 | 39.762 |
| 2016-03-264:55:26 PM | 49.212 | 85.55 | 69.575 | 39.875 |
| 2016-03-264:55:30 PM | 49.212 | 85.55 | 69.575 | 39.762 |
| 2016-03-264:55:34 PM | 49.212 | 85.662 | 69.575 | 39.762 |
| 2016-03-264:55:38 PM | 49.212 | 85.662 | 69.575 | 39.762 |
| 2016-03-264:55:42 PM | 49.212 | 85.662 | 69.575 | 39.762 |
| 2016-03-264:55:46 PM | 49.325 | 85.775 | 69.462 | 39.65 |
| 2016-03-264:55:50 PM | 49.325 | 85.775 | 69.462 | 39.762 |
| 2016-03-264:55:54 PM | 49.212 | 85.888 | 69.462 | 39.762 |
| 2016-03-264:55:58 PM | 49.212 | 85.888 | 69.575 | 39.762 |
| 2016-03-264:56:02 PM | 49.212 | 86 | 69.462 | 39.875 |
| 2016-03-264:56:06 PM | 49.1 | 86 | 69.575 | 39.875 |
| 2016-03-264:56:10 PM | 49.1 | 86.112 | 69.462 | 39.988 |
| 2016-03-264:56:14 PM | 48.875 | 86.112 | 69.462 | 40.1 |
| 2016-03-264:56:18 PM | 48.762 | 86.112 | 69.462 | 40.212 |
| 2016-03-264:56:22 PM | 48.762 | 86.225 | 69.462 | 40.212 |
| 2016-03-264:56:26 PM | 48.65 | 86.225 | 69.462 | 40.325 |
| 2016-03-264:56:30 PM | 48.425 | 86.225 | 69.462 | 40.325 |
| 2016-03-264:56:34 PM | 48.425 | 86.225 | 69.462 | 40.438 |
| 2016-03-264:56:39 PM | 48.312 | 86.225 | 69.462 | 40.438 |
| 2016-03-264:56:43 PM | 48.312 | 86.225 | 69.462 | 40.325 |
| 2016-03-264:56:47 PM | 48.2 | 86.112 | 69.462 | 40.325 |
| 2016-03-264:56:51 PM | 48.2 | 86.225 | 69.462 | 40.212 |
| 2016-03-264:56:55 PM | 48.088 | 86.225 | 69.35 | 40.1 |
| 2016-03-264:56:59 PM | 48.088 | 86.225 | 69.462 | 39.988 |
| 2016-03-264:57:03 PM | 48.088 | 86.338 | 69.35 | 39.988 |
| 2016-03-264:57:07 PM | 47.975 | 86.45 | 69.35 | 39.875 |
| 2016-03-264:57:11 PM | 47.975 | 86.562 | 69.35 | 39.875 |
| 2016-03-264:57:15 PM | 47.975 | 86.562 | 69.35 | 39.875 |
| 2016-03-264:57:19 PM | 47.975 | 86.675 | 69.35 | 39.875 |
| 2016-03-264:57:23 PM | 47.862 | 86.562 | 69.35 | 39.988 |
| 2016-03-264:57:27 PM | 47.862 | 86.562 | 69.35 | 39.988 |
| 2016-03-264:57:31 PM | 47.862 | 86.675 | 69.35 | 39.988 |
| 2016-03-264:57:35 PM | 47.862 | 86.675 | 69.35 | 39.988 |
| 2016-03-264:57:39 PM | 47.862 | 86.788 | 69.35 | 39.988 |
| 2016-03-264:57:43 PM | 47.862 | 86.9 | 69.238 | 39.988 |
| 2016-03-264:57:47 PM | 47.862 | 87.012 | 69.35 | 39.988 |
| 2016-03-264:58:04 PM | 47.75 | 87.012 | 69.35 | 39.988 |
| 2016-03-264:58:09 PM | 47.75 | 87.012 | 69.35 | 39.988 |
| 2016-03-264:58:13 PM | 47.638 | 87.125 | 69.35 | 40.1 |
| 2016-03-264:58:17 PM | 47.638 | 87.238 | 69.238 | 40.1 |
| 2016-03-264:58:21 PM | 47.638 | 87.35 | 69.35 | 40.1 |
| 2016-03-264:58:25 PM | 47.525 | 87.35 | 69.238 | 40.212 |
| 2016-03-264:58:29 PM | 47.525 | 90.5 | 69.238 | 40.212 |
| 2016-03-264:58:34 PM | 47.412 | 92.3 | 69.238 | 40.1 |
| 2016-03-264:58:38 PM | 47.412 | 93.988 | 69.238 | 40.1 |
| 2016-03-264:58:42 PM | 47.3 | 95.45 | 69.35 | 39.988 |
| 2016-03-264:58:46 PM | 47.3 | 96.8 | 69.238 | 39.988 |
| 2016-03-264:58:50 PM | 47.3 | 98.038 | 69.238 | 39.988 |
| 2016-03-264:58:54 PM | 47.188 | 99.163 | 69.238 | 39.988 |
| 2016-03-264:58:58 PM | 47.188 | 100.175 | 69.238 | 39.875 |
| 2016-03-264:59:03 PM | 47.188 | 101.075 | 69.35 | 39.988 |
| 2016-03-264:59:07 PM | 47.188 | 101.862 | 69.238 | 39.988 |
| 2016-03-264:59:11 PM | 47.075 | 102.538 | 69.238 | 39.988 |
| 2016-03-264:59:15 PM | 46.962 | 103.1 | 69.238 | 39.988 |
| 2016-03-264:59:19 PM | 46.85 | 103.663 | 69.238 | 39.875 |
| 2016-03-264:59:23 PM | 46.85 | 104.112 | 69.238 | 39.988 |
| 2016-03-264:59:28 PM | 46.85 | 104.562 | 69.238 | 39.988 |
| 2016-03-264:59:32 PM | 46.738 | 104.9 | 69.238 | 39.988 |
| 2016-03-264:59:36 PM | 46.738 | 105.238 | 69.35 | 40.1 |
| 2016-03-264:59:40 PM | 46.738 | 105.462 | 69.35 | 40.1 |
| 2016-03-264:59:44 PM | 46.738 | 105.688 | 69.35 | 40.1 |
| 2016-03-264:59:48 PM | 46.738 | 105.913 | 69.35 | 40.1 |
| 2016-03-264:59:53 PM | 46.85 | 106.025 | 69.238 | 40.212 |
| 2016-03-264:59:57 PM | 46.962 | 106.25 | 69.238 | 40.212 |
| 2016-03-265:00:01 PM | 46.962 | 106.362 | 69.35 | 40.212 |
| 2016-03-265:00:05 PM | 47.075 | 106.475 | 69.35 | 40.212 |
| 2016-03-265:00:09 PM | 47.075 | 106.588 | 69.35 | 40.325 |
| 2016-03-265:00:13 PM | 47.3 | 106.588 | 69.35 | 40.212 |
| 2016-03-265:00:17 PM | 47.3 | 106.7 | 69.238 | 40.212 |
| 2016-03-265:00:22 PM | 47.412 | 106.7 | 69.35 | 40.212 |
| 2016-03-265:00:26 PM | 47.525 | 106.7 | 69.35 | 40.212 |
| 2016-03-265:00:30 PM | 47.638 | 106.7 | 69.35 | 40.212 |
| 2016-03-265:00:34 PM | 47.638 | 106.7 | 69.35 | 40.212 |
| 2016-03-265:00:38 PM | 47.75 | 106.7 | 69.238 | 40.212 |
| 2016-03-265:00:42 PM | 47.862 | 106.7 | 69.35 | 40.1 |
| 2016-03-265:00:47 PM | 47.975 | 106.7 | 69.35 | 40.1 |
| 2016-03-265:00:51 PM | 48.088 | 106.588 | 69.35 | 40.1 |
| 2016-03-265:00:55 PM | 48.2 | 106.7 | 69.35 | 40.1 |
| 2016-03-265:00:59 PM | 48.2 | 106.588 | 69.35 | 40.212 |
| 2016-03-265:01:03 PM | 48.2 | 106.588 | 69.35 | 40.325 |
| 2016-03-265:01:07 PM | 48.312 | 106.475 | 69.35 | 40.325 |
| 2016-03-265:01:12 PM | 48.2 | 106.475 | 69.35 | 40.325 |
| 2016-03-265:01:16 PM | 48.312 | 106.475 | 69.35 | 40.212 |
| 2016-03-265:01:20 PM | 48.312 | 106.362 | 69.35 | 40.325 |
| 2016-03-265:01:24 PM | 48.312 | 106.25 | 69.35 | 40.325 |
| 2016-03-265:01:28 PM | 48.312 | 106.25 | 69.462 | 40.325 |
| 2016-03-265:01:32 PM | 48.425 | 106.25 | 69.462 | 40.212 |
| 2016-03-265:01:37 PM | 48.425 | 106.138 | 69.462 | 40.325 |
| 2016-03-265:01:41 PM | 48.538 | 106.025 | 69.462 | 40.438 |
| 2016-03-265:01:45 PM | 48.538 | 106.025 | 69.462 | 40.55 |
| 2016-03-265:01:49 PM | 48.538 | 105.913 | 69.462 | 40.55 |
| 2016-03-265:01:53 PM | 48.762 | 105.913 | 69.462 | 40.55 |
| 2016-03-265:01:59 PM | 48.762 | 105.8 | 69.462 | 40.662 |
| 2016-03-265:02:03 PM | 48.875 | 105.8 | 69.462 | 40.662 |
| 2016-03-265:02:07 PM | 48.988 | 105.688 | 69.462 | 40.775 |
| 2016-03-265:02:12 PM | 48.988 | 105.688 | 69.462 | 40.775 |
| 2016-03-265:02:16 PM | 49.1 | 105.575 | 69.462 | 40.662 |
| 2016-03-265:02:20 PM | 49.213 | 105.462 | 69.575 | 40.662 |
| 2016-03-265:02:24 PM | 49.325 | 105.462 | 69.575 | 40.55 |
| 2016-03-265:02:28 PM | 49.438 | 105.35 | 69.575 | 40.55 |
| 2016-03-265:02:32 PM | 49.55 | 105.35 | 69.575 | 40.55 |
| 2016-03-265:02:36 PM | 49.662 | 105.238 | 69.575 | 40.438 |
| 2016-03-265:02:40 PM | 49.775 | 105.125 | 69.575 | 40.438 |
| 2016-03-265:02:44 PM | 49.775 | 105.125 | 69.575 | 40.438 |
| 2016-03-265:02:48 PM | 49.888 | 105.012 | 69.688 | 40.438 |
| 2016-03-265:02:52 PM | 49.888 | 105.012 | 69.688 | 40.325 |
| 2016-03-265:02:56 PM | 50 | 104.9 | 69.688 | 40.325 |
| 2016-03-265:03:00 PM | 50.112 | 104.9 | 69.688 | 40.212 |
| 2016-03-265:03:04 PM | 50.112 | 104.788 | 69.688 | 40.1 |
| 2016-03-265:03:08 PM | 50.112 | 104.788 | 69.688 | 39.988 |
| 2016-03-265:03:12 PM | 50.225 | 104.675 | 69.688 | 39.988 |
| 2016-03-265:03:17 PM | 50.225 | 104.562 | 69.688 | 40.1 |
| 2016-03-265:03:21 PM | 50.338 | 104.562 | 69.688 | 40.1 |
| 2016-03-265:03:25 PM | 50.338 | 104.45 | 69.688 | 39.988 |
| 2016-03-265:03:29 PM | 50.338 | 104.338 | 69.8 | 39.988 |
| 2016-03-265:03:33 PM | 50.112 | 104.225 | 69.8 | 39.988 |
| 2016-03-265:03:37 PM | 50.112 | 104.225 | 69.8 | 39.988 |
| 2016-03-265:03:41 PM | 50.112 | 104.112 | 69.8 | 39.988 |
| 2016-03-265:03:45 PM | 50 | 104 | 69.8 | 39.875 |
| 2016-03-265:03:49 PM | 50 | 103.888 | 69.912 | 39.875 |
| 2016-03-265:03:53 PM | 49.888 | 103.888 | 69.912 | 39.875 |
| 2016-03-265:03:57 PM | 49.775 | 103.663 | 69.912 | 39.762 |
| 2016-03-265:04:01 PM | 49.662 | 103.663 | 69.912 | 39.65 |
| 2016-03-265:04:05 PM | 49.662 | 103.55 | 69.912 | 39.65 |
| 2016-03-265:04:09 PM | 49.55 | 103.438 | 69.912 | 39.538 |
| 2016-03-265:04:13 PM | 49.55 | 103.325 | 69.912 | 39.425 |
| 2016-03-265:04:18 PM | 49.438 | 103.212 | 70.025 | 39.425 |
| 2016-03-265:04:22 PM | 49.325 | 102.988 | 69.912 | 39.312 |
| 2016-03-265:04:26 PM | 49.1 | 102.875 | 70.025 | 39.312 |
| 2016-03-265:04:30 PM | 48.988 | 102.65 | 70.025 | 39.312 |
| 2016-03-265:04:34 PM | 48.875 | 102.425 | 70.025 | 39.312 |
| 2016-03-265:04:38 PM | 48.65 | 102.312 | 70.025 | 39.425 |
| 2016-03-265:04:42 PM | 48.65 | 102.088 | 70.025 | 39.312 |
| 2016-03-265:04:46 PM | 48.538 | 101.862 | 70.138 | 39.312 |
| 2016-03-265:04:50 PM | 48.425 | 101.638 | 70.138 | 39.312 |
| 2016-03-265:04:54 PM | 48.312 | 101.525 | 70.138 | 39.312 |
| 2016-03-265:04:58 PM | 48.312 | 101.3 | 70.138 | 39.2 |
| 2016-03-265:05:02 PM | 48.312 | 101.188 | 70.138 | 39.088 |
| 2016-03-265:05:06 PM | 48.2 | 100.962 | 70.138 | 38.975 |
| 2016-03-265:05:10 PM | 48.088 | 100.85 | 70.25 | 38.862 |
| 2016-03-265:05:14 PM | 48.088 | 100.625 | 70.25 | 38.862 |
| 2016-03-265:05:18 PM | 48.088 | 100.512 | 70.25 | 38.75 |
| 2016-03-265:05:22 PM | 48.088 | 100.288 | 70.25 | 38.75 |
| 2016-03-265:05:27 PM | 48.2 | 100.175 | 70.25 | 38.75 |
| 2016-03-265:05:31 PM | 48.2 | 100.062 | 70.25 | 38.75 |
| 2016-03-265:05:35 PM | 48.2 | 99.95 | 70.25 | 38.862 |
| 2016-03-265:05:39 PM | 48.2 | 99.725 | 70.25 | 38.862 |
| 2016-03-265:05:43 PM | 48.2 | 99.612 | 70.25 | 38.75 |
| 2016-03-265:05:47 PM | 48.2 | 99.5 | 70.363 | 38.75 |
| 2016-03-265:05:51 PM | 48.2 | 99.388 | 70.363 | 38.75 |
| 2016-03-265:05:55 PM | 48.312 | 99.275 | 70.363 | 38.638 |
| 2016-03-265:05:59 PM | 48.312 | 99.05 | 70.363 | 38.638 |
| 2016-03-265:06:03 PM | 48.425 | 98.938 | 70.363 | 38.638 |
| 2016-03-265:06:07 PM | 48.425 | 98.825 | 70.363 | 38.638 |
| 2016-03-265:06:11 PM | 48.538 | 98.712 | 70.363 | 38.75 |
| 2016-03-265:06:15 PM | 48.538 | 98.6 | 70.475 | 38.75 |
| 2016-03-265:06:19 PM | 48.425 | 98.488 | 70.475 | 38.75 |
| 2016-03-265:06:23 PM | 48.425 | 98.375 | 70.475 | 38.75 |
| 2016-03-265:06:27 PM | 48.425 | 98.262 | 70.475 | 38.75 |
| 2016-03-265:06:31 PM | 48.425 | 98.15 | 70.475 | 38.75 |
| 2016-03-265:06:35 PM | 48.425 | 98.038 | 70.475 | 38.75 |
| 2016-03-265:06:39 PM | 48.425 | 97.812 | 70.588 | 38.75 |
| 2016-03-265:06:43 PM | 48.538 | 97.7 | 70.588 | 38.75 |
| 2016-03-265:06:47 PM | 48.538 | 97.7 | 70.588 | 38.862 |
| 2016-03-265:06:52 PM | 48.538 | 97.475 | 70.588 | 38.862 |
| 2016-03-265:06:56 PM | 48.425 | 97.362 | 70.588 | 38.862 |
| 2016-03-265:07:00 PM | 48.538 | 97.25 | 70.588 | 38.75 |
| 2016-03-265:07:04 PM | 48.538 | 97.138 | 70.588 | 38.75 |
| 2016-03-265:07:08 PM | 48.538 | 97.025 | 70.588 | 38.75 |
| 2016-03-265:07:12 PM | 48.65 | 96.913 | 70.7 | 38.75 |
| 2016-03-265:07:16 PM | 48.65 | 96.8 | 70.7 | 38.75 |
| 2016-03-265:07:20 PM | 48.762 | 96.575 | 70.7 | 38.75 |
| 2016-03-265:07:24 PM | 48.762 | 96.575 | 70.7 | 38.75 |
| 2016-03-265:07:28 PM | 48.875 | 96.35 | 70.7 | 38.75 |
| 2016-03-265:07:32 PM | 48.988 | 96.238 | 70.7 | 38.75 |
| 2016-03-265:07:36 PM | 48.875 | 96.125 | 70.7 | 38.75 |
| 2016-03-265:07:40 PM | 48.988 | 96.012 | 70.812 | 38.75 |
| 2016-03-265:07:44 PM | 48.988 | 95.9 | 70.812 | 38.75 |
| 2016-03-265:07:48 PM | 48.988 | 95.788 | 70.812 | 38.638 |
| 2016-03-265:07:52 PM | 49.1 | 95.675 | 70.812 | 38.525 |
| 2016-03-265:07:56 PM | 49.1 | 95.562 | 70.812 | 38.525 |
| 2016-03-265:08:00 PM | 49.213 | 95.45 | 70.812 | 38.412 |
| 2016-03-265:08:04 PM | 49.325 | 95.338 | 70.925 | 38.412 |
| 2016-03-265:08:09 PM | 49.325 | 95.225 | 70.812 | 38.3 |
| 2016-03-265:08:13 PM | 49.438 | 95.113 | 70.925 | 38.3 |
| 2016-03-265:08:17 PM | 49.438 | 94.888 | 70.925 | 38.3 |
| 2016-03-265:08:21 PM | 49.213 | 94.775 | 71.038 | 38.3 |
| 2016-03-265:08:25 PM | 49.1 | 94.662 | 70.925 | 38.3 |
| 2016-03-265:08:29 PM | 49.1 | 94.55 | 71.038 | 38.3 |
| 2016-03-265:08:33 PM | 49.1 | 94.438 | 71.038 | 38.3 |
| 2016-03-265:08:37 PM | 49.1 | 94.325 | 71.038 | 38.3 |
| 2016-03-265:08:41 PM | 49.1 | 94.212 | 71.038 | 38.3 |
| 2016-03-265:08:45 PM | 48.988 | 94.1 | 71.038 | 38.3 |
| 2016-03-265:08:49 PM | 48.988 | 93.988 | 71.038 | 38.188 |
| 2016-03-265:08:53 PM | 48.988 | 93.875 | 71.038 | 38.188 |
| 2016-03-265:08:57 PM | 49.1 | 93.762 | 71.15 | 38.075 |
| 2016-03-265:09:01 PM | 49.1 | 93.65 | 71.15 | 38.075 |
| 2016-03-265:09:05 PM | 49.213 | 93.538 | 71.15 | 38.075 |
| 2016-03-265:09:09 PM | 49.213 | 93.538 | 71.15 | 38.075 |
| 2016-03-265:09:13 PM | 49.213 | 93.312 | 71.15 | 38.075 |
| 2016-03-265:09:17 PM | 49.1 | 93.2 | 71.15 | 38.075 |
| 2016-03-265:09:21 PM | 49.1 | 93.088 | 71.15 | 38.075 |
| 2016-03-265:09:26 PM | 48.988 | 92.975 | 71.262 | 37.962 |
| 2016-03-265:09:30 PM | 48.988 | 92.863 | 71.262 | 37.962 |
| 2016-03-265:09:34 PM | 48.988 | 92.75 | 71.262 | 38.075 |
| 2016-03-265:09:38 PM | 48.988 | 92.638 | 71.262 | 38.075 |
| 2016-03-265:09:42 PM | 48.988 | 92.525 | 71.262 | 38.075 |
| 2016-03-265:09:46 PM | 48.988 | 92.412 | 71.262 | 38.188 |
| 2016-03-265:09:50 PM | 48.988 | 92.3 | 71.262 | 38.075 |
| 2016-03-265:09:54 PM | 48.988 | 92.075 | 71.262 | 38.075 |
| 2016-03-265:09:58 PM | 48.988 | 91.962 | 71.375 | 38.075 |
| 2016-03-265:10:02 PM | 48.988 | 91.85 | 71.375 | 38.075 |
| 2016-03-265:10:06 PM | 48.988 | 91.738 | 71.375 | 37.962 |
| 2016-03-265:10:10 PM | 48.988 | 91.625 | 71.375 | 37.962 |
| 2016-03-265:10:14 PM | 49.1 | 91.512 | 71.375 | 37.962 |
| 2016-03-265:10:18 PM | 49.1 | 91.4 | 71.375 | 37.85 |
| 2016-03-265:10:22 PM | 49.213 | 91.288 | 71.375 | 37.85 |
| 2016-03-265:10:26 PM | 49.1 | 91.175 | 71.375 | 37.85 |
| 2016-03-265:10:30 PM | 49.1 | 91.062 | 71.375 | 37.85 |
| 2016-03-265:10:34 PM | 48.988 | 90.95 | 71.375 | 37.85 |
| 2016-03-265:10:38 PM | 48.875 | 90.838 | 71.375 | 37.85 |
| 2016-03-265:10:42 PM | 48.875 | 90.725 | 71.375 | 37.962 |
| 2016-03-265:10:47 PM | 48.762 | 90.613 | 71.375 | 37.962 |
| 2016-03-265:10:51 PM | 48.65 | 90.5 | 71.488 | 38.075 |
| 2016-03-265:10:55 PM | 48.538 | 90.388 | 71.488 | 38.075 |
| 2016-03-265:10:59 PM | 48.425 | 90.275 | 71.488 | 38.075 |
| 2016-03-265:11:03 PM | 48.2 | 90.162 | 71.375 | 37.962 |
| 2016-03-265:11:07 PM | 48.2 | 90.05 | 71.488 | 38.075 |
| 2016-03-265:11:11 PM | 48.088 | 89.938 | 71.488 | 37.962 |
| 2016-03-265:11:15 PM | 47.975 | 89.825 | 71.488 | 37.962 |
| 2016-03-265:11:19 PM | 47.975 | 89.712 | 71.488 | 37.962 |
| 2016-03-265:11:23 PM | 47.862 | 89.712 | 71.488 | 37.962 |
| 2016-03-265:11:27 PM | 47.862 | 89.488 | 71.488 | 37.962 |
| 2016-03-265:11:31 PM | 47.75 | 89.375 | 71.488 | 38.075 |
| 2016-03-265:11:35 PM | 47.75 | 89.262 | 71.488 | 37.962 |
| 2016-03-265:11:39 PM | 47.862 | 89.262 | 71.488 | 37.962 |
| 2016-03-265:11:43 PM | 47.75 | 89.038 | 71.488 | 37.962 |
| 2016-03-265:11:47 PM | 47.862 | 88.925 | 71.488 | 37.962 |
| 2016-03-265:11:51 PM | 47.862 | 88.925 | 71.488 | 37.962 |
| 2016-03-265:11:55 PM | 47.862 | 88.7 | 71.488 | 37.962 |
| 2016-03-265:11:59 PM | 47.975 | 88.7 | 71.488 | 37.962 |
| 2016-03-265:12:03 PM | 48.088 | 88.588 | 71.488 | 37.962 |
| 2016-03-265:12:08 PM | 48.088 | 88.475 | 71.488 | 37.962 |
| 2016-03-265:12:12 PM | 48.2 | 88.363 | 71.488 | 37.962 |
| 2016-03-265:12:16 PM | 48.312 | 88.25 | 71.488 | 37.962 |
| 2016-03-265:12:20 PM | 48.425 | 88.138 | 71.488 | 38.075 |
| 2016-03-265:12:24 PM | 48.538 | 88.025 | 71.6 | 37.962 |
| 2016-03-265:12:28 PM | 48.65 | 87.912 | 71.6 | 38.075 |
| 2016-03-265:12:32 PM | 48.65 | 87.8 | 71.6 | 38.075 |
| 2016-03-265:12:36 PM | 48.65 | 87.688 | 71.6 | 37.962 |
| 2016-03-265:12:40 PM | 48.65 | 87.688 | 71.6 | 37.962 |
| 2016-03-265:12:44 PM | 48.762 | 87.575 | 71.6 | 37.962 |
| 2016-03-265:12:48 PM | 48.762 | 87.35 | 71.712 | 37.962 |
| 2016-03-265:12:52 PM | 48.762 | 87.35 | 71.712 | 37.85 |
| 2016-03-265:12:56 PM | 48.762 | 87.238 | 71.712 | 37.85 |
| 2016-03-265:13:00 PM | 48.65 | 87.125 | 71.712 | 37.85 |
| 2016-03-265:13:04 PM | 48.538 | 87.012 | 71.712 | 37.85 |
| 2016-03-265:13:08 PM | 48.538 | 86.9 | 71.712 | 37.85 |
| 2016-03-265:13:12 PM | 48.425 | 86.788 | 71.712 | 37.85 |
| 2016-03-265:13:16 PM | 48.425 | 86.675 | 71.712 | 37.85 |
| 2016-03-265:13:20 PM | 48.312 | 86.675 | 71.712 | 37.962 |
| 2016-03-265:13:25 PM | 48.312 | 86.562 | 71.712 | 38.075 |
| 2016-03-265:13:29 PM | 48.312 | 86.45 | 71.712 | 38.188 |
| 2016-03-265:13:33 PM | 48.312 | 86.338 | 71.712 | 38.188 |
| 2016-03-265:13:37 PM | 48.312 | 86.225 | 71.712 | 38.188 |
| 2016-03-265:13:41 PM | 48.312 | 86.113 | 71.712 | 38.188 |
| 2016-03-265:13:45 PM | 48.312 | 86 | 71.712 | 38.188 |
| 2016-03-265:13:49 PM | 48.312 | 85.888 | 71.712 | 38.188 |
| 2016-03-265:13:53 PM | 48.312 | 85.775 | 71.712 | 38.188 |
| 2016-03-265:13:57 PM | 48.312 | 85.662 | 71.712 | 38.188 |
| 2016-03-265:14:01 PM | 48.425 | 85.662 | 71.712 | 38.188 |
| 2016-03-265:14:05 PM | 48.425 | 85.55 | 71.712 | 38.075 |
| 2016-03-265:14:09 PM | 48.425 | 85.438 | 71.712 | 38.075 |
| 2016-03-265:14:13 PM | 48.538 | 85.325 | 71.712 | 37.962 |
| 2016-03-265:14:17 PM | 48.538 | 85.212 | 71.712 | 38.075 |
| 2016-03-265:14:21 PM | 48.538 | 85.1 | 71.712 | 37.962 |
| 2016-03-265:14:25 PM | 48.538 | 84.988 | 71.825 | 37.962 |
| 2016-03-265:14:29 PM | 48.65 | 84.988 | 71.825 | 37.962 |
| 2016-03-265:14:33 PM | 48.65 | 84.762 | 71.825 | 37.962 |
| 2016-03-265:14:37 PM | 48.65 | 84.65 | 71.825 | 37.962 |
| 2016-03-265:14:41 PM | 48.762 | 84.538 | 71.825 | 37.962 |
| 2016-03-265:14:46 PM | 48.65 | 84.425 | 71.825 | 37.962 |
| 2016-03-265:14:50 PM | 48.762 | 84.312 | 71.825 | 37.962 |
| 2016-03-265:14:54 PM | 48.875 | 84.312 | 71.825 | 37.962 |
| 2016-03-265:14:58 PM | 48.875 | 84.2 | 71.825 | 37.85 |
| 2016-03-265:15:02 PM | 48.988 | 84.088 | 71.825 | 37.85 |
| 2016-03-265:15:06 PM | 48.988 | 83.975 | 71.825 | 37.85 |
| 2016-03-265:15:10 PM | 48.988 | 83.863 | 71.825 | 37.85 |
| 2016-03-265:15:14 PM | 48.988 | 83.75 | 71.825 | 37.85 |
| 2016-03-265:15:18 PM | 48.988 | 83.638 | 71.825 | 37.85 |
| 2016-03-265:15:22 PM | 48.988 | 83.525 | 71.825 | 37.85 |
| 2016-03-265:15:26 PM | 48.988 | 83.412 | 71.825 | 37.738 |
| 2016-03-265:15:30 PM | 48.988 | 83.3 | 71.825 | 37.738 |
| 2016-03-265:15:34 PM | 49.1 | 83.188 | 71.825 | 37.738 |
| 2016-03-265:15:38 PM | 49.1 | 83.075 | 71.825 | 37.738 |
| 2016-03-265:15:42 PM | 48.988 | 83.075 | 71.825 | 37.85 |
| 2016-03-265:15:46 PM | 48.988 | 82.962 | 71.825 | 37.738 |
| 2016-03-265:15:50 PM | 48.988 | 82.85 | 71.825 | 37.738 |
| 2016-03-265:15:54 PM | 48.988 | 82.738 | 71.825 | 37.85 |
| 2016-03-265:15:58 PM | 48.988 | 82.625 | 71.825 | 37.85 |
| 2016-03-265:16:02 PM | 48.988 | 82.4 | 71.825 | 37.962 |
| 2016-03-265:16:06 PM | 48.988 | 82.4 | 71.825 | 37.962 |
| 2016-03-265:16:10 PM | 48.988 | 82.288 | 71.825 | 37.962 |
| 2016-03-265:16:14 PM | 49.1 | 82.175 | 71.825 | 38.075 |
| 2016-03-265:16:19 PM | 49.1 | 82.062 | 71.825 | 38.075 |
| 2016-03-265:16:23 PM | 49.213 | 81.838 | 71.825 | 38.188 |
| 2016-03-265:16:27 PM | 49.213 | 81.838 | 71.825 | 38.188 |
| 2016-03-265:16:31 PM | 49.213 | 81.725 | 71.825 | 38.188 |
| 2016-03-265:16:35 PM | 49.325 | 81.613 | 71.825 | 38.188 |
| 2016-03-265:16:39 PM | 49.438 | 81.5 | 71.825 | 38.3 |
| 2016-03-265:16:43 PM | 49.438 | 81.388 | 71.825 | 38.3 |
| 2016-03-265:16:47 PM | 49.55 | 81.275 | 71.825 | 38.3 |
| 2016-03-265:16:51 PM | 49.662 | 81.162 | 71.825 | 38.188 |
| 2016-03-265:16:55 PM | 49.662 | 80.938 | 71.825 | 38.3 |
| 2016-03-265:16:59 PM | 49.775 | 80.938 | 71.938 | 38.188 |
| 2016-03-265:17:03 PM | 49.775 | 80.825 | 71.825 | 38.3 |
| 2016-03-265:17:07 PM | 49.888 | 80.712 | 71.938 | 38.3 |
| 2016-03-265:17:11 PM | 49.888 | 80.488 | 71.938 | 38.3 |
| 2016-03-265:17:15 PM | 50 | 80.375 | 71.938 | 38.412 |
| 2016-03-265:17:19 PM | 50 | 80.262 | 71.825 | 38.412 |
| 2016-03-265:17:23 PM | 49.888 | 80.15 | 71.938 | 38.412 |
| 2016-03-265:17:27 PM | 49.888 | 80.038 | 71.938 | 38.525 |
| 2016-03-265:17:31 PM | 49.888 | 79.925 | 71.938 | 38.525 |
| 2016-03-265:17:36 PM | 49.888 | 79.7 | 71.938 | 38.638 |
| 2016-03-265:17:40 PM | 49.888 | 79.588 | 71.938 | 38.638 |
| 2016-03-265:17:44 PM | 49.888 | 79.475 | 71.938 | 38.638 |
| 2016-03-265:17:48 PM | 49.888 | 79.363 | 71.938 | 38.638 |
| 2016-03-265:17:52 PM | 49.888 | 79.25 | 71.938 | 38.638 |
| 2016-03-265:17:56 PM | 49.888 | 79.025 | 71.938 | 38.638 |
| 2016-03-265:18:00 PM | 49.888 | 79.025 | 71.938 | 38.638 |
| 2016-03-265:18:04 PM | 49.888 | 78.8 | 71.938 | 38.638 |
| 2016-03-265:18:08 PM | 49.888 | 78.688 | 71.938 | 38.638 |
| 2016-03-265:18:12 PM | 49.888 | 78.575 | 71.938 | 38.638 |
| 2016-03-265:18:16 PM | 49.775 | 78.462 | 71.938 | 38.638 |
| 2016-03-265:18:20 PM | 49.888 | 78.238 | 71.938 | 38.638 |
| 2016-03-265:18:24 PM | 49.888 | 78.125 | 72.05 | 38.638 |
| 2016-03-265:18:28 PM | 49.888 | 78.012 | 72.05 | 38.75 |
| 2016-03-265:18:32 PM | 50 | 77.9 | 72.05 | 38.75 |
| 2016-03-265:18:36 PM | 50 | 77.675 | 72.05 | 38.75 |
| 2016-03-265:18:40 PM | 50.112 | 77.562 | 72.05 | 38.75 |
| 2016-03-265:18:45 PM | 50.112 | 77.45 | 72.05 | 38.75 |
| 2016-03-265:18:49 PM | 50.112 | 77.338 | 72.05 | 38.862 |
| 2016-03-265:18:53 PM | 50.112 | 77.225 | 72.05 | 38.862 |
| 2016-03-265:18:57 PM | 50.112 | 77.113 | 72.05 | 38.975 |
| 2016-03-265:19:01 PM | 50.112 | 76.888 | 72.05 | 38.975 |
| 2016-03-265:19:05 PM | 50.112 | 76.775 | 72.05 | 38.975 |
| 2016-03-265:19:09 PM | 50.112 | 76.662 | 72.05 | 39.088 |
| 2016-03-265:19:13 PM | 50.112 | 76.438 | 72.05 | 39.088 |
| 2016-03-265:19:17 PM | 50.112 | 76.438 | 72.05 | 39.088 |
| 2016-03-265:19:21 PM | 50.112 | 76.212 | 72.05 | 38.975 |
| 2016-03-265:19:25 PM | 50.112 | 76.1 | 72.05 | 38.975 |
| 2016-03-265:19:29 PM | 50.225 | 75.988 | 72.05 | 38.975 |
| 2016-03-265:19:33 PM | 50.225 | 75.875 | 72.05 | 38.975 |
| 2016-03-265:19:37 PM | 50.225 | 75.762 | 72.05 | 38.975 |
| 2016-03-265:19:41 PM | 50.338 | 75.538 | 72.05 | 38.975 |
| 2016-03-265:19:45 PM | 50.338 | 75.425 | 72.05 | 38.862 |
| 2016-03-265:19:50 PM | 50.338 | 75.312 | 72.05 | 38.862 |
| 2016-03-265:19:54 PM | 50.338 | 75.2 | 72.05 | 38.862 |
| 2016-03-265:19:58 PM | 50.338 | 75.088 | 72.05 | 38.862 |
| 2016-03-265:20:02 PM | 50.338 | 74.863 | 72.05 | 38.975 |
| 2016-03-265:20:06 PM | 50.338 | 74.75 | 72.05 | 38.975 |
| 2016-03-265:20:10 PM | 50.338 | 74.638 | 72.05 | 38.975 |
| 2016-03-265:20:14 PM | 50.338 | 74.412 | 72.162 | 38.975 |
| 2016-03-265:20:18 PM | 50.338 | 74.3 | 72.162 | 39.088 |
| 2016-03-265:20:22 PM | 50.338 | 74.188 | 72.162 | 39.088 |
| 2016-03-265:20:26 PM | 50.338 | 73.962 | 72.05 | 39.088 |
| 2016-03-265:20:30 PM | 50.225 | 73.85 | 72.162 | 39.088 |
| 2016-03-265:20:34 PM | 50.225 | 73.738 | 72.05 | 39.088 |
| 2016-03-265:20:38 PM | 50.338 | 73.625 | 72.162 | 39.088 |
| 2016-03-265:20:42 PM | 50.225 | 73.512 | 72.162 | 39.088 |
| 2016-03-265:20:46 PM | 50.338 | 73.4 | 72.162 | 39.2 |
| 2016-03-265:20:50 PM | 50.338 | 73.175 | 72.05 | 39.2 |
| 2016-03-265:20:54 PM | 50.338 | 73.175 | 72.162 | 39.2 |
| 2016-03-265:20:58 PM | 50.45 | 73.062 | 72.162 | 39.312 |
| 2016-03-265:21:03 PM | 50.45 | 72.838 | 72.162 | 39.2 |
| 2016-03-265:21:07 PM | 50.45 | 72.725 | 72.162 | 39.2 |
| 2016-03-265:21:11 PM | 50.562 | 72.613 | 72.162 | 39.088 |
| 2016-03-265:21:15 PM | 50.562 | 72.388 | 72.162 | 39.088 |
| 2016-03-265:21:19 PM | 50.562 | 72.275 | 72.05 | 39.088 |
| 2016-03-265:21:23 PM | 50.45 | 72.05 | 72.162 | 38.975 |
| 2016-03-265:21:27 PM | 50.562 | 71.938 | 72.05 | 38.975 |
| 2016-03-265:21:31 PM | 50.562 | 71.712 | 72.162 | 38.975 |
| 2016-03-265:21:35 PM | 50.562 | 71.488 | 72.05 | 38.975 |
| 2016-03-265:21:39 PM | 50.45 | 71.375 | 72.05 | 38.975 |
| 2016-03-265:21:43 PM | 50.45 | 71.15 | 72.05 | 38.975 |
| 2016-03-265:21:47 PM | 50.338 | 70.925 | 72.05 | 38.862 |
| 2016-03-265:21:51 PM | 50.338 | 70.812 | 72.05 | 38.862 |
| 2016-03-265:21:56 PM | 50.338 | 70.588 | 72.05 | 38.862 |
| 2016-03-265:22:00 PM | 50.338 | 70.475 | 72.05 | 38.862 |
| 2016-03-265:22:04 PM | 50.338 | 70.25 | 72.05 | 38.75 |
| 2016-03-265:22:08 PM | 50.225 | 70.025 | 72.05 | 38.862 |
| 2016-03-265:22:12 PM | 50.225 | 69.8 | 72.05 | 38.75 |
| 2016-03-265:22:16 PM | 50.225 | 69.688 | 72.05 | 38.75 |
| 2016-03-265:22:20 PM | 50.225 | 69.462 | 72.05 | 38.75 |
| 2016-03-265:22:24 PM | 50.225 | 69.35 | 72.05 | 38.862 |
| 2016-03-265:22:28 PM | 50.225 | 69.238 | 72.05 | 38.75 |
| 2016-03-265:22:32 PM | 50.112 | 69.012 | 72.05 | 38.862 |
| 2016-03-265:22:36 PM | 50.112 | 68.788 | 72.05 | 38.862 |
| 2016-03-265:22:40 PM | 50.112 | 68.675 | 72.05 | 38.975 |
| 2016-03-265:22:44 PM | 50.112 | 68.45 | 71.938 | 38.975 |
| 2016-03-265:22:48 PM | 50.112 | 68.338 | 71.938 | 38.975 |
| 2016-03-265:22:52 PM | 50 | 68.225 | 71.938 | 38.975 |
| 2016-03-265:22:56 PM | 50 | 68 | 72.05 | 39.088 |
| 2016-03-265:23:01 PM | 50 | 67.888 | 72.05 | 39.088 |
| 2016-03-265:23:05 PM | 50 | 67.662 | 72.05 | 39.088 |
| 2016-03-265:23:09 PM | 50 | 67.55 | 71.938 | 39.088 |
| 2016-03-265:23:13 PM | 50 | 67.438 | 71.938 | 39.088 |
| 2016-03-265:23:17 PM | 50 | 67.325 | 71.938 | 39.088 |
| 2016-03-265:23:21 PM | 50 | 67.212 | 72.05 | 39.088 |
| 2016-03-265:23:25 PM | 50 | 67.1 | 72.05 | 39.088 |
| 2016-03-265:23:29 PM | 50.112 | 66.875 | 72.05 | 39.2 |
| 2016-03-265:23:33 PM | 50 | 66.762 | 72.05 | 39.2 |
| 2016-03-265:23:37 PM | 50 | 66.65 | 72.05 | 39.2 |
| 2016-03-265:23:41 PM | 50.112 | 66.538 | 72.05 | 39.2 |
| 2016-03-265:23:45 PM | 50.112 | 66.425 | 72.05 | 39.2 |
| 2016-03-265:23:49 PM | 50.112 | 66.312 | 72.05 | 39.2 |
| 2016-03-265:23:53 PM | 50.112 | 66.2 | 72.05 | 39.2 |
| 2016-03-265:23:57 PM | 50.225 | 66.088 | 72.05 | 39.088 |
| 2016-03-265:24:01 PM | 50.225 | 65.975 | 72.05 | 39.088 |
| 2016-03-265:24:06 PM | 50.225 | 65.863 | 72.05 | 39.088 |
| 2016-03-265:24:10 PM | 50.338 | 65.75 | 72.05 | 39.088 |
| 2016-03-265:24:14 PM | 50.45 | 65.638 | 72.05 | 38.975 |
| 2016-03-265:24:18 PM | 50.45 | 65.525 | 72.05 | 38.975 |
| 2016-03-265:24:22 PM | 50.45 | 65.412 | 72.05 | 38.975 |
| 2016-03-265:24:26 PM | 50.562 | 65.3 | 72.05 | 38.975 |
| 2016-03-265:24:30 PM | 50.562 | 65.3 | 71.938 | 38.975 |
| 2016-03-265:24:34 PM | 50.562 | 65.188 | 71.938 | 38.975 |
| 2016-03-265:24:38 PM | 50.562 | 65.075 | 71.938 | 38.862 |
| 2016-03-265:24:42 PM | 50.45 | 64.963 | 71.938 | 38.862 |
| 2016-03-265:24:46 PM | 50.45 | 64.85 | 71.938 | 38.862 |